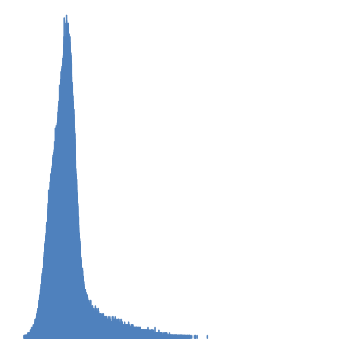
| Category | Series 1 |
|---|---|
| 0 | 0 |
| 1 | 0 |
| 2 | 0 |
| 3 | 0 |
| 4 | 0 |
| 5 | 0 |
| 6 | 0 |
| 7 | 0 |
| 8 | 0 |
| 9 | 0 |
| 10 | 0 |
| 11 | 0 |
| 12 | 0 |
| 13 | 0 |
| 14 | 0 |
| 15 | 0 |
| 16 | 0 |
| 17 | 0 |
| 18 | 0 |
| 19 | 0 |
| 20 | 0 |
| 21 | 0 |
| 22 | 0 |
| 23 | 0 |
| 24 | 0 |
| 25 | 0 |
| 26 | 0 |
| 27 | 0 |
| 28 | 0 |
| 29 | 0 |
| 30 | 0 |
| 31 | 0 |
| 32 | 0 |
| 33 | 0 |
| 34 | 0 |
| 35 | 0 |
| 36 | 0 |
| 37 | 0 |
| 38 | 0 |
| 39 | 0 |
| 40 | 0 |
| 41 | 0 |
| 42 | 0 |
| 43 | 0 |
| 44 | 0 |
| 45 | 0 |
| 46 | 0 |
| 47 | 0 |
| 48 | 0 |
| 49 | 0 |
| 50 | 0 |
| 51 | 0 |
| 52 | 0 |
| 53 | 0 |
| 54 | 0 |
| 55 | 0 |
| 56 | 0 |
| 57 | 0 |
| 58 | 0 |
| 59 | 0 |
| 60 | 0 |
| 61 | 0 |
| 62 | 0 |
| 63 | 0 |
| 64 | 0 |
| 65 | 0 |
| 66 | 0 |
| 67 | 0 |
| 68 | 0 |
| 69 | 0 |
| 70 | 0 |
| 71 | 0 |
| 72 | 0 |
| 73 | 0 |
| 74 | 0 |
| 75 | 0 |
| 76 | 0 |
| 77 | 0 |
| 78 | 0 |
| 79 | 0 |
| 80 | 0 |
| 81 | 0 |
| 82 | 0 |
| 83 | 0 |
| 84 | 0 |
| 85 | 0 |
| 86 | 0 |
| 87 | 0 |
| 88 | 0 |
| 89 | 0 |
| 90 | 0 |
| 91 | 0 |
| 92 | 0 |
| 93 | 0 |
| 94 | 0 |
| 95 | 0 |
| 96 | 0 |
| 97 | 0 |
| 98 | 0 |
| 99 | 0 |
| 100 | 0 |
| 101 | 0 |
| 102 | 0 |
| 103 | 0 |
| 104 | 0 |
| 105 | 0 |
| 106 | 0 |
| 107 | 0 |
| 108 | 0 |
| 109 | 0 |
| 110 | 0 |
| 111 | 0 |
| 112 | 0 |
| 113 | 0 |
| 114 | 0 |
| 115 | 0 |
| 116 | 0 |
| 117 | 0 |
| 118 | 0 |
| 119 | 0 |
| 120 | 0 |
| 121 | 0 |
| 122 | 0 |
| 123 | 0 |
| 124 | 0 |
| 125 | 0 |
| 126 | 0 |
| 127 | 0 |
| 128 | 0 |
| 129 | 0 |
| 130 | 0 |
| 131 | 0 |
| 132 | 0 |
| 133 | 0 |
| 134 | 0 |
| 135 | 0 |
| 136 | 0 |
| 137 | 0 |
| 138 | 0 |
| 139 | 0 |
| 140 | 0 |
| 141 | 0 |
| 142 | 0 |
| 143 | 0 |
| 144 | 0 |
| 145 | 0 |
| 146 | 0 |
| 147 | 0 |
| 148 | 0 |
| 149 | 0 |
| 150 | 0 |
| 151 | 0 |
| 152 | 0 |
| 153 | 0 |
| 154 | 0 |
| 155 | 0 |
| 156 | 0 |
| 157 | 0 |
| 158 | 0 |
| 159 | 0 |
| 160 | 0 |
| 161 | 0 |
| 162 | 0 |
| 163 | 0 |
| 164 | 0 |
| 165 | 0 |
| 166 | 0 |
| 167 | 0 |
| 168 | 0 |
| 169 | 0 |
| 170 | 0 |
| 171 | 0 |
| 172 | 0 |
| 173 | 0 |
| 174 | 0 |
| 175 | 0 |
| 176 | 0 |
| 177 | 0 |
| 178 | 0 |
| 179 | 0 |
| 180 | 0 |
| 181 | 0 |
| 182 | 0 |
| 183 | 0 |
| 184 | 0 |
| 185 | 0 |
| 186 | 0 |
| 187 | 0 |
| 188 | 0 |
| 189 | 0 |
| 190 | 0 |
| 191 | 0 |
| 192 | 0 |
| 193 | 0 |
| 194 | 0 |
| 195 | 0 |
| 196 | 0 |
| 197 | 0 |
| 198 | 0 |
| 199 | 0 |
| 200 | 0 |
| 201 | 0 |
| 202 | 0 |
| 203 | 0 |
| 204 | 0 |
| 205 | 0 |
| 206 | 0 |
| 207 | 0 |
| 208 | 0 |
| 209 | 0 |
| 210 | 0 |
| 211 | 0 |
| 212 | 0 |
| 213 | 0 |
| 214 | 0 |
| 215 | 0 |
| 216 | 0 |
| 217 | 0 |
| 218 | 0 |
| 219 | 0 |
| 220 | 0 |
| 221 | 0 |
| 222 | 0 |
| 223 | 0 |
| 224 | 0 |
| 225 | 0 |
| 226 | 0 |
| 227 | 0 |
| 228 | 0 |
| 229 | 0 |
| 230 | 0 |
| 231 | 0 |
| 232 | 0 |
| 233 | 0 |
| 234 | 0 |
| 235 | 0 |
| 236 | 0 |
| 237 | 0 |
| 238 | 0 |
| 239 | 0 |
| 240 | 0 |
| 241 | 0 |
| 242 | 0 |
| 243 | 0 |
| 244 | 0 |
| 245 | 0 |
| 246 | 0 |
| 247 | 0 |
| 248 | 0 |
| 249 | 0 |
| 250 | 0 |
| 251 | 0 |
| 252 | 0 |
| 253 | 0 |
| 254 | 0 |
| 255 | 0 |
| 256 | 0 |
| 257 | 0 |
| 258 | 0 |
| 259 | 0 |
| 260 | 0 |
| 261 | 0 |
| 262 | 0 |
| 263 | 0 |
| 264 | 0 |
| 265 | 0 |
| 266 | 0 |
| 267 | 0 |
| 268 | 0 |
| 269 | 0 |
| 270 | 0 |
| 271 | 0 |
| 272 | 0 |
| 273 | 0 |
| 274 | 0 |
| 275 | 0 |
| 276 | 0 |
| 277 | 0 |
| 278 | 0 |
| 279 | 0 |
| 280 | 0 |
| 281 | 0 |
| 282 | 0 |
| 283 | 0 |
| 284 | 0 |
| 285 | 0 |
| 286 | 0 |
| 287 | 0 |
| 288 | 0 |
| 289 | 0 |
| 290 | 0 |
| 291 | 0 |
| 292 | 0 |
| 293 | 0 |
| 294 | 0 |
| 295 | 0 |
| 296 | 0 |
| 297 | 0 |
| 298 | 0 |
| 299 | 0 |
| 300 | 0 |
| 301 | 0 |
| 302 | 0 |
| 303 | 0 |
| 304 | 0 |
| 305 | 0 |
| 306 | 0 |
| 307 | 0 |
| 308 | 0 |
| 309 | 0 |
| 310 | 0 |
| 311 | 0 |
| 312 | 0 |
| 313 | 0 |
| 314 | 0 |
| 315 | 0 |
| 316 | 0 |
| 317 | 0 |
| 318 | 0 |
| 319 | 0 |
| 320 | 0 |
| 321 | 0 |
| 322 | 0 |
| 323 | 0 |
| 324 | 0 |
| 325 | 0 |
| 326 | 0 |
| 327 | 0 |
| 328 | 0 |
| 329 | 0 |
| 330 | 0 |
| 331 | 0 |
| 332 | 0 |
| 333 | 0 |
| 334 | 0 |
| 335 | 0 |
| 336 | 0 |
| 337 | 0 |
| 338 | 0 |
| 339 | 0 |
| 340 | 0 |
| 341 | 0 |
| 342 | 0 |
| 343 | 0 |
| 344 | 0 |
| 345 | 0 |
| 346 | 0 |
| 347 | 0 |
| 348 | 0 |
| 349 | 0 |
| 350 | 0 |
| 351 | 0 |
| 352 | 0 |
| 353 | 0 |
| 354 | 0 |
| 355 | 0 |
| 356 | 0 |
| 357 | 0 |
| 358 | 0 |
| 359 | 0 |
| 360 | 0 |
| 361 | 0 |
| 362 | 0 |
| 363 | 0 |
| 364 | 0 |
| 365 | 0 |
| 366 | 0 |
| 367 | 0 |
| 368 | 0 |
| 369 | 0 |
| 370 | 0 |
| 371 | 0 |
| 372 | 0 |
| 373 | 0 |
| 374 | 0 |
| 375 | 0 |
| 376 | 0 |
| 377 | 0 |
| 378 | 0 |
| 379 | 0 |
| 380 | 0 |
| 381 | 0 |
| 382 | 0 |
| 383 | 0 |
| 384 | 0 |
| 385 | 0 |
| 386 | 0 |
| 387 | 0 |
| 388 | 0 |
| 389 | 0 |
| 390 | 0 |
| 391 | 0 |
| 392 | 0 |
| 393 | 0 |
| 394 | 0 |
| 395 | 0 |
| 396 | 0 |
| 397 | 0 |
| 398 | 0 |
| 399 | 0 |
| 400 | 0 |
| 401 | 0 |
| 402 | 0 |
| 403 | 0 |
| 404 | 0 |
| 405 | 0 |
| 406 | 0 |
| 407 | 0 |
| 408 | 0 |
| 409 | 0 |
| 410 | 0 |
| 411 | 0 |
| 412 | 0 |
| 413 | 0 |
| 414 | 0 |
| 415 | 0 |
| 416 | 0 |
| 417 | 0 |
| 418 | 0 |
| 419 | 0 |
| 420 | 0 |
| 421 | 0 |
| 422 | 0 |
| 423 | 0 |
| 424 | 0 |
| 425 | 0 |
| 426 | 0 |
| 427 | 0 |
| 428 | 0 |
| 429 | 0 |
| 430 | 0 |
| 431 | 0 |
| 432 | 0 |
| 433 | 0 |
| 434 | 0 |
| 435 | 0 |
| 436 | 0 |
| 437 | 0 |
| 438 | 0 |
| 439 | 0 |
| 440 | 0 |
| 441 | 0 |
| 442 | 0 |
| 443 | 0 |
| 444 | 0 |
| 445 | 0 |
| 446 | 0 |
| 447 | 0 |
| 448 | 0 |
| 449 | 0 |
| 450 | 0 |
| 451 | 0 |
| 452 | 0 |
| 453 | 0 |
| 454 | 0 |
| 455 | 0 |
| 456 | 0 |
| 457 | 0 |
| 458 | 0 |
| 459 | 0 |
| 460 | 0 |
| 461 | 0 |
| 462 | 0 |
| 463 | 0 |
| 464 | 0 |
| 465 | 0 |
| 466 | 0 |
| 467 | 0 |
| 468 | 0 |
| 469 | 0 |
| 470 | 0 |
| 471 | 0 |
| 472 | 0 |
| 473 | 0 |
| 474 | 0 |
| 475 | 0 |
| 476 | 0 |
| 477 | 0 |
| 478 | 0 |
| 479 | 0 |
| 480 | 0 |
| 481 | 0 |
| 482 | 0 |
| 483 | 0 |
| 484 | 0 |
| 485 | 0 |
| 486 | 0 |
| 487 | 0 |
| 488 | 0 |
| 489 | 0 |
| 490 | 0 |
| 491 | 0 |
| 492 | 0 |
| 493 | 0 |
| 494 | 0 |
| 495 | 0 |
| 496 | 0 |
| 497 | 0 |
| 498 | 0 |
| 499 | 0 |
| 500 | 0 |
| 501 | 0 |
| 502 | 0 |
| 503 | 0 |
| 504 | 0 |
| 505 | 0 |
| 506 | 0 |
| 507 | 0 |
| 508 | 0 |
| 509 | 0 |
| 510 | 0 |
| 511 | 0 |
| 512 | 0 |
| 513 | 0 |
| 514 | 0 |
| 515 | 0 |
| 516 | 0 |
| 517 | 0 |
| 518 | 0 |
| 519 | 0 |
| 520 | 0 |
| 521 | 0 |
| 522 | 0 |
| 523 | 0 |
| 524 | 0 |
| 525 | 0 |
| 526 | 0 |
| 527 | 0 |
| 528 | 0 |
| 529 | 0 |
| 530 | 0 |
| 531 | 0 |
| 532 | 0 |
| 533 | 0 |
| 534 | 0 |
| 535 | 0 |
| 536 | 0 |
| 537 | 0 |
| 538 | 0 |
| 539 | 0 |
| 540 | 0 |
| 541 | 0 |
| 542 | 0 |
| 543 | 0 |
| 544 | 0 |
| 545 | 0 |
| 546 | 0 |
| 547 | 0 |
| 548 | 0 |
| 549 | 0 |
| 550 | 0 |
| 551 | 0 |
| 552 | 0 |
| 553 | 0 |
| 554 | 0 |
| 555 | 0 |
| 556 | 0 |
| 557 | 0 |
| 558 | 0 |
| 559 | 0 |
| 560 | 0 |
| 561 | 0 |
| 562 | 0 |
| 563 | 0 |
| 564 | 0 |
| 565 | 0 |
| 566 | 0 |
| 567 | 0 |
| 568 | 0 |
| 569 | 0 |
| 570 | 0 |
| 571 | 0 |
| 572 | 0 |
| 573 | 0 |
| 574 | 0 |
| 575 | 0 |
| 576 | 0 |
| 577 | 0 |
| 578 | 0 |
| 579 | 0 |
| 580 | 0 |
| 581 | 0 |
| 582 | 0 |
| 583 | 0 |
| 584 | 0 |
| 585 | 0 |
| 586 | 0 |
| 587 | 0 |
| 588 | 0 |
| 589 | 0 |
| 590 | 0 |
| 591 | 0 |
| 592 | 0 |
| 593 | 0 |
| 594 | 0 |
| 595 | 0 |
| 596 | 0 |
| 597 | 0 |
| 598 | 0 |
| 599 | 0 |
| 600 | 0 |
| 601 | 0 |
| 602 | 0 |
| 603 | 0 |
| 604 | 0 |
| 605 | 0 |
| 606 | 0 |
| 607 | 0 |
| 608 | 0 |
| 609 | 0 |
| 610 | 0 |
| 611 | 0 |
| 612 | 0 |
| 613 | 0 |
| 614 | 0 |
| 615 | 0 |
| 616 | 0 |
| 617 | 0 |
| 618 | 0 |
| 619 | 0 |
| 620 | 0 |
| 621 | 0 |
| 622 | 0 |
| 623 | 0 |
| 624 | 0 |
| 625 | 0 |
| 626 | 0 |
| 627 | 0 |
| 628 | 0 |
| 629 | 0 |
| 630 | 0 |
| 631 | 0 |
| 632 | 0 |
| 633 | 0 |
| 634 | 0 |
| 635 | 0 |
| 636 | 0 |
| 637 | 0 |
| 638 | 0 |
| 639 | 0 |
| 640 | 0 |
| 641 | 0 |
| 642 | 0 |
| 643 | 0 |
| 644 | 0 |
| 645 | 0 |
| 646 | 0 |
| 647 | 0 |
| 648 | 0 |
| 649 | 0 |
| 650 | 0 |
| 651 | 0 |
| 652 | 0 |
| 653 | 0 |
| 654 | 0 |
| 655 | 0 |
| 656 | 0 |
| 657 | 0 |
| 658 | 0 |
| 659 | 0 |
| 660 | 0 |
| 661 | 0 |
| 662 | 0 |
| 663 | 0 |
| 664 | 0 |
| 665 | 0 |
| 666 | 0 |
| 667 | 0 |
| 668 | 0 |
| 669 | 0 |
| 670 | 0 |
| 671 | 0 |
| 672 | 0 |
| 673 | 0 |
| 674 | 0 |
| 675 | 0 |
| 676 | 0 |
| 677 | 0 |
| 678 | 0 |
| 679 | 0 |
| 680 | 0 |
| 681 | 0 |
| 682 | 0 |
| 683 | 0 |
| 684 | 0 |
| 685 | 0 |
| 686 | 0 |
| 687 | 0 |
| 688 | 0 |
| 689 | 0 |
| 690 | 0 |
| 691 | 0 |
| 692 | 0 |
| 693 | 0 |
| 694 | 0 |
| 695 | 0 |
| 696 | 0 |
| 697 | 0 |
| 698 | 0 |
| 699 | 0 |
| 700 | 0 |
| 701 | 0 |
| 702 | 0 |
| 703 | 0 |
| 704 | 0 |
| 705 | 0 |
| 706 | 0 |
| 707 | 0 |
| 708 | 0 |
| 709 | 0 |
| 710 | 0 |
| 711 | 0 |
| 712 | 0 |
| 713 | 0 |
| 714 | 0 |
| 715 | 0 |
| 716 | 0 |
| 717 | 0 |
| 718 | 0 |
| 719 | 0 |
| 720 | 0 |
| 721 | 0 |
| 722 | 0 |
| 723 | 0 |
| 724 | 0 |
| 725 | 0 |
| 726 | 0 |
| 727 | 0 |
| 728 | 0 |
| 729 | 0 |
| 730 | 0 |
| 731 | 0 |
| 732 | 0 |
| 733 | 0 |
| 734 | 0 |
| 735 | 0 |
| 736 | 0 |
| 737 | 0 |
| 738 | 0 |
| 739 | 0 |
| 740 | 0 |
| 741 | 0 |
| 742 | 0 |
| 743 | 0 |
| 744 | 0 |
| 745 | 0 |
| 746 | 0 |
| 747 | 0 |
| 748 | 0 |
| 749 | 0 |
| 750 | 0 |
| 751 | 0 |
| 752 | 0 |
| 753 | 0 |
| 754 | 0 |
| 755 | 0 |
| 756 | 0 |
| 757 | 0 |
| 758 | 0 |
| 759 | 0 |
| 760 | 0 |
| 761 | 0 |
| 762 | 0 |
| 763 | 0 |
| 764 | 0 |
| 765 | 0 |
| 766 | 0 |
| 767 | 0 |
| 768 | 0 |
| 769 | 0 |
| 770 | 0 |
| 771 | 0 |
| 772 | 0 |
| 773 | 0 |
| 774 | 0 |
| 775 | 0 |
| 776 | 0 |
| 777 | 0 |
| 778 | 0 |
| 779 | 0 |
| 780 | 0 |
| 781 | 0 |
| 782 | 0 |
| 783 | 0 |
| 784 | 0 |
| 785 | 0 |
| 786 | 0 |
| 787 | 0 |
| 788 | 0 |
| 789 | 0 |
| 790 | 0 |
| 791 | 0 |
| 792 | 0 |
| 793 | 0 |
| 794 | 0 |
| 795 | 0 |
| 796 | 0 |
| 797 | 0 |
| 798 | 0 |
| 799 | 0 |
| 800 | 0 |
| 801 | 0 |
| 802 | 0 |
| 803 | 0 |
| 804 | 0 |
| 805 | 0 |
| 806 | 0 |
| 807 | 0 |
| 808 | 0 |
| 809 | 0 |
| 810 | 0 |
| 811 | 0 |
| 812 | 0 |
| 813 | 0 |
| 814 | 0 |
| 815 | 0 |
| 816 | 0 |
| 817 | 0 |
| 818 | 0 |
| 819 | 0 |
| 820 | 0 |
| 821 | 0 |
| 822 | 0 |
| 823 | 0 |
| 824 | 0 |
| 825 | 0 |
| 826 | 0 |
| 827 | 0 |
| 828 | 0 |
| 829 | 0 |
| 830 | 0 |
| 831 | 0 |
| 832 | 0 |
| 833 | 0 |
| 834 | 0 |
| 835 | 0 |
| 836 | 0 |
| 837 | 0 |
| 838 | 0 |
| 839 | 0 |
| 840 | 0 |
| 841 | 0 |
| 842 | 0 |
| 843 | 0 |
| 844 | 0 |
| 845 | 0 |
| 846 | 0 |
| 847 | 0 |
| 848 | 0 |
| 849 | 0 |
| 850 | 0 |
| 851 | 0 |
| 852 | 0 |
| 853 | 0 |
| 854 | 0 |
| 855 | 0 |
| 856 | 0 |
| 857 | 0 |
| 858 | 0 |
| 859 | 0 |
| 860 | 0 |
| 861 | 0 |
| 862 | 0 |
| 863 | 0 |
| 864 | 0 |
| 865 | 0 |
| 866 | 0 |
| 867 | 0 |
| 868 | 0 |
| 869 | 0 |
| 870 | 0 |
| 871 | 0 |
| 872 | 0 |
| 873 | 0 |
| 874 | 0 |
| 875 | 0 |
| 876 | 0 |
| 877 | 0 |
| 878 | 0 |
| 879 | 0 |
| 880 | 0 |
| 881 | 0 |
| 882 | 0 |
| 883 | 0 |
| 884 | 0 |
| 885 | 0 |
| 886 | 0 |
| 887 | 0 |
| 888 | 0 |
| 889 | 0 |
| 890 | 0 |
| 891 | 0 |
| 892 | 0 |
| 893 | 0 |
| 894 | 0 |
| 895 | 0 |
| 896 | 0 |
| 897 | 0 |
| 898 | 0 |
| 899 | 0 |
| 900 | 0 |
| 901 | 0 |
| 902 | 0 |
| 903 | 0 |
| 904 | 0 |
| 905 | 0 |
| 906 | 0 |
| 907 | 0 |
| 908 | 0 |
| 909 | 0 |
| 910 | 0 |
| 911 | 0 |
| 912 | 0 |
| 913 | 0 |
| 914 | 0 |
| 915 | 0 |
| 916 | 0 |
| 917 | 0 |
| 918 | 0 |
| 919 | 0 |
| 920 | 0 |
| 921 | 0 |
| 922 | 0 |
| 923 | 0 |
| 924 | 0 |
| 925 | 0 |
| 926 | 0 |
| 927 | 0 |
| 928 | 0 |
| 929 | 0 |
| 930 | 0 |
| 931 | 0 |
| 932 | 0 |
| 933 | 0 |
| 934 | 0 |
| 935 | 0 |
| 936 | 0 |
| 937 | 0 |
| 938 | 0 |
| 939 | 0 |
| 940 | 0 |
| 941 | 0 |
| 942 | 0 |
| 943 | 0 |
| 944 | 0 |
| 945 | 0 |
| 946 | 0 |
| 947 | 0 |
| 948 | 0 |
| 949 | 0 |
| 950 | 0 |
| 951 | 0 |
| 952 | 0 |
| 953 | 0 |
| 954 | 0 |
| 955 | 0 |
| 956 | 0 |
| 957 | 0 |
| 958 | 0 |
| 959 | 0 |
| 960 | 0 |
| 961 | 0 |
| 962 | 0 |
| 963 | 0 |
| 964 | 0 |
| 965 | 0 |
| 966 | 0 |
| 967 | 0 |
| 968 | 0 |
| 969 | 0 |
| 970 | 0 |
| 971 | 0 |
| 972 | 0 |
| 973 | 0 |
| 974 | 0 |
| 975 | 0 |
| 976 | 0 |
| 977 | 0 |
| 978 | 0 |
| 979 | 0 |
| 980 | 0 |
| 981 | 0 |
| 982 | 0 |
| 983 | 0 |
| 984 | 0 |
| 985 | 0 |
| 986 | 0 |
| 987 | 0 |
| 988 | 0 |
| 989 | 0 |
| 990 | 0 |
| 991 | 0 |
| 992 | 0 |
| 993 | 0 |
| 994 | 0 |
| 995 | 0 |
| 996 | 0 |
| 997 | 0 |
| 998 | 0 |
| 999 | 0 |
| 1000 | 0 |
| 1001 | 0 |
| 1002 | 0 |
| 1003 | 0 |
| 1004 | 0 |
| 1005 | 0 |
| 1006 | 0 |
| 1007 | 0 |
| 1008 | 0 |
| 1009 | 0 |
| 1010 | 0 |
| 1011 | 0 |
| 1012 | 0 |
| 1013 | 0 |
| 1014 | 0 |
| 1015 | 0 |
| 1016 | 0 |
| 1017 | 0 |
| 1018 | 0 |
| 1019 | 0 |
| 1020 | 0 |
| 1021 | 0 |
| 1022 | 0 |
| 1023 | 0 |
| 1024 | 0 |
| 1025 | 0 |
| 1026 | 0 |
| 1027 | 0 |
| 1028 | 0 |
| 1029 | 0 |
| 1030 | 0 |
| 1031 | 0 |
| 1032 | 0 |
| 1033 | 0 |
| 1034 | 0 |
| 1035 | 0 |
| 1036 | 0 |
| 1037 | 0 |
| 1038 | 0 |
| 1039 | 0 |
| 1040 | 0 |
| 1041 | 0 |
| 1042 | 0 |
| 1043 | 0 |
| 1044 | 0 |
| 1045 | 0 |
| 1046 | 0 |
| 1047 | 0 |
| 1048 | 0 |
| 1049 | 0 |
| 1050 | 0 |
| 1051 | 0 |
| 1052 | 0 |
| 1053 | 0 |
| 1054 | 0 |
| 1055 | 0 |
| 1056 | 0 |
| 1057 | 0 |
| 1058 | 0 |
| 1059 | 0 |
| 1060 | 0 |
| 1061 | 0 |
| 1062 | 0 |
| 1063 | 0.001 |
| 1064 | 0 |
| 1065 | 0 |
| 1066 | 0 |
| 1067 | 0 |
| 1068 | 0 |
| 1069 | 0 |
| 1070 | 0 |
| 1071 | 0 |
| 1072 | 0 |
| 1073 | 0 |
| 1074 | 0 |
| 1075 | 0 |
| 1076 | 0 |
| 1077 | 0 |
| 1078 | 0 |
| 1079 | 0 |
| 1080 | 0.001 |
| 1081 | 0 |
| 1082 | 0.001 |
| 1083 | 0 |
| 1084 | 0 |
| 1085 | 0 |
| 1086 | 0.001 |
| 1087 | 0 |
| 1088 | 0 |
| 1089 | 0 |
| 1090 | 0 |
| 1091 | 0 |
| 1092 | 0 |
| 1093 | 0 |
| 1094 | 0 |
| 1095 | 0 |
| 1096 | 0.001 |
| 1097 | 0 |
| 1098 | 0 |
| 1099 | 0 |
| 1100 | 0 |
| 1101 | 0 |
| 1102 | 0.001 |
| 1103 | 0 |
| 1104 | 0.001 |
| 1105 | 0 |
| 1106 | 0 |
| 1107 | 0.001 |
| 1108 | 0.001 |
| 1109 | 0 |
| 1110 | 0.001 |
| 1111 | 0.001 |
| 1112 | 0 |
| 1113 | 0.001 |
| 1114 | 0 |
| 1115 | 0.001 |
| 1116 | 0 |
| 1117 | 0 |
| 1118 | 0.001 |
| 1119 | 0.001 |
| 1120 | 0 |
| 1121 | 0.001 |
| 1122 | 0 |
| 1123 | 0.001 |
| 1124 | 0 |
| 1125 | 0.001 |
| 1126 | 0.001 |
| 1127 | 0.001 |
| 1128 | 0 |
| 1129 | 0.001 |
| 1130 | 0.001 |
| 1131 | 0.001 |
| 1132 | 0.001 |
| 1133 | 0.001 |
| 1134 | 0.001 |
| 1135 | 0.001 |
| 1136 | 0.001 |
| 1137 | 0.001 |
| 1138 | 0.001 |
| 1139 | 0.001 |
| 1140 | 0.001 |
| 1141 | 0.001 |
| 1142 | 0.001 |
| 1143 | 0.001 |
| 1144 | 0.001 |
| 1145 | 0.001 |
| 1146 | 0.001 |
| 1147 | 0.001 |
| 1148 | 0.001 |
| 1149 | 0.001 |
| 1150 | 0.001 |
| 1151 | 0.001 |
| 1152 | 0.001 |
| 1153 | 0.001 |
| 1154 | 0.001 |
| 1155 | 0.001 |
| 1156 | 0.001 |
| 1157 | 0.001 |
| 1158 | 0.001 |
| 1159 | 0.001 |
| 1160 | 0.001 |
| 1161 | 0.001 |
| 1162 | 0.001 |
| 1163 | 0.001 |
| 1164 | 0.001 |
| 1165 | 0.001 |
| 1166 | 0.001 |
| 1167 | 0.001 |
| 1168 | 0.001 |
| 1169 | 0.001 |
| 1170 | 0.001 |
| 1171 | 0.001 |
| 1172 | 0.001 |
| 1173 | 0.001 |
| 1174 | 0.001 |
| 1175 | 0.001 |
| 1176 | 0.001 |
| 1177 | 0.001 |
| 1178 | 0.001 |
| 1179 | 0.001 |
| 1180 | 0.001 |
| 1181 | 0.001 |
| 1182 | 0.001 |
| 1183 | 0.001 |
| 1184 | 0.001 |
| 1185 | 0.001 |
| 1186 | 0.001 |
| 1187 | 0.001 |
| 1188 | 0.001 |
| 1189 | 0.001 |
| 1190 | 0.001 |
| 1191 | 0.001 |
| 1192 | 0.001 |
| 1193 | 0.001 |
| 1194 | 0.001 |
| 1195 | 0.001 |
| 1196 | 0.001 |
| 1197 | 0.001 |
| 1198 | 0.001 |
| 1199 | 0.001 |
| 1200 | 0.001 |
| 1201 | 0.001 |
| 1202 | 0.001 |
| 1203 | 0.001 |
| 1204 | 0.001 |
| 1205 | 0.001 |
| 1206 | 0.001 |
| 1207 | 0.001 |
| 1208 | 0.001 |
| 1209 | 0.001 |
| 1210 | 0.001 |
| 1211 | 0.001 |
| 1212 | 0.001 |
| 1213 | 0.001 |
| 1214 | 0.001 |
| 1215 | 0.001 |
| 1216 | 0.001 |
| 1217 | 0.001 |
| 1218 | 0.001 |
| 1219 | 0.001 |
| 1220 | 0.001 |
| 1221 | 0.001 |
| 1222 | 0.001 |
| 1223 | 0.001 |
| 1224 | 0.001 |
| 1225 | 0.001 |
| 1226 | 0.001 |
| 1227 | 0.001 |
| 1228 | 0.001 |
| 1229 | 0.001 |
| 1230 | 0.001 |
| 1231 | 0.001 |
| 1232 | 0.001 |
| 1233 | 0.001 |
| 1234 | 0.001 |
| 1235 | 0.001 |
| 1236 | 0.001 |
| 1237 | 0.001 |
| 1238 | 0.001 |
| 1239 | 0.001 |
| 1240 | 0.001 |
| 1241 | 0.001 |
| 1242 | 0.001 |
| 1243 | 0.001 |
| 1244 | 0.001 |
| 1245 | 0.001 |
| 1246 | 0.001 |
| 1247 | 0.001 |
| 1248 | 0.001 |
| 1249 | 0.001 |
| 1250 | 0.001 |
| 1251 | 0.001 |
| 1252 | 0.001 |
| 1253 | 0.001 |
| 1254 | 0.001 |
| 1255 | 0.001 |
| 1256 | 0.001 |
| 1257 | 0.001 |
| 1258 | 0.001 |
| 1259 | 0.001 |
| 1260 | 0.001 |
| 1261 | 0.001 |
| 1262 | 0.001 |
| 1263 | 0.001 |
| 1264 | 0.001 |
| 1265 | 0.001 |
| 1266 | 0.001 |
| 1267 | 0.001 |
| 1268 | 0.001 |
| 1269 | 0.001 |
| 1270 | 0.001 |
| 1271 | 0.001 |
| 1272 | 0.001 |
| 1273 | 0.001 |
| 1274 | 0.001 |
| 1275 | 0.001 |
| 1276 | 0.001 |
| 1277 | 0.001 |
| 1278 | 0.001 |
| 1279 | 0.001 |
| 1280 | 0.001 |
| 1281 | 0.001 |
| 1282 | 0.001 |
| 1283 | 0.001 |
| 1284 | 0.001 |
| 1285 | 0.001 |
| 1286 | 0.001 |
| 1287 | 0.001 |
| 1288 | 0.001 |
| 1289 | 0.001 |
| 1290 | 0.001 |
| 1291 | 0.001 |
| 1292 | 0.001 |
| 1293 | 0.001 |
| 1294 | 0.001 |
| 1295 | 0.001 |
| 1296 | 0.001 |
| 1297 | 0.001 |
| 1298 | 0.001 |
| 1299 | 0.001 |
| 1300 | 0.001 |
| 1301 | 0.001 |
| 1302 | 0.001 |
| 1303 | 0.001 |
| 1304 | 0.001 |
| 1305 | 0.001 |
| 1306 | 0.001 |
| 1307 | 0.001 |
| 1308 | 0.001 |
| 1309 | 0.001 |
| 1310 | 0.001 |
| 1311 | 0.001 |
| 1312 | 0.001 |
| 1313 | 0.001 |
| 1314 | 0.001 |
| 1315 | 0.001 |
| 1316 | 0.001 |
| 1317 | 0.001 |
| 1318 | 0.001 |
| 1319 | 0.001 |
| 1320 | 0.001 |
| 1321 | 0.001 |
| 1322 | 0.001 |
| 1323 | 0.001 |
| 1324 | 0.001 |
| 1325 | 0.001 |
| 1326 | 0.001 |
| 1327 | 0.001 |
| 1328 | 0.001 |
| 1329 | 0.001 |
| 1330 | 0.001 |
| 1331 | 0.001 |
| 1332 | 0.001 |
| 1333 | 0.001 |
| 1334 | 0.001 |
| 1335 | 0.001 |
| 1336 | 0.001 |
| 1337 | 0.001 |
| 1338 | 0.001 |
| 1339 | 0.001 |
| 1340 | 0.001 |
| 1341 | 0.001 |
| 1342 | 0.001 |
| 1343 | 0.001 |
| 1344 | 0.001 |
| 1345 | 0.001 |
| 1346 | 0.001 |
| 1347 | 0.001 |
| 1348 | 0.001 |
| 1349 | 0.001 |
| 1350 | 0.001 |
| 1351 | 0.001 |
| 1352 | 0.001 |
| 1353 | 0.001 |
| 1354 | 0.001 |
| 1355 | 0.001 |
| 1356 | 0.001 |
| 1357 | 0.001 |
| 1358 | 0.001 |
| 1359 | 0.001 |
| 1360 | 0.001 |
| 1361 | 0.001 |
| 1362 | 0.001 |
| 1363 | 0.001 |
| 1364 | 0.001 |
| 1365 | 0.001 |
| 1366 | 0.001 |
| 1367 | 0.001 |
| 1368 | 0.001 |
| 1369 | 0.001 |
| 1370 | 0.001 |
| 1371 | 0.001 |
| 1372 | 0.001 |
| 1373 | 0.001 |
| 1374 | 0.001 |
| 1375 | 0.001 |
| 1376 | 0.001 |
| 1377 | 0.001 |
| 1378 | 0.001 |
| 1379 | 0.001 |
| 1380 | 0.001 |
| 1381 | 0.001 |
| 1382 | 0.001 |
| 1383 | 0.001 |
| 1384 | 0.001 |
| 1385 | 0.001 |
| 1386 | 0.001 |
| 1387 | 0.001 |
| 1388 | 0.001 |
| 1389 | 0.001 |
| 1390 | 0.001 |
| 1391 | 0.001 |
| 1392 | 0.001 |
| 1393 | 0.001 |
| 1394 | 0.001 |
| 1395 | 0.001 |
| 1396 | 0.001 |
| 1397 | 0.001 |
| 1398 | 0.001 |
| 1399 | 0.001 |
| 1400 | 0.001 |
| 1401 | 0.001 |
| 1402 | 0.001 |
| 1403 | 0.001 |
| 1404 | 0.001 |
| 1405 | 0.001 |
| 1406 | 0.001 |
| 1407 | 0.001 |
| 1408 | 0.001 |
| 1409 | 0.001 |
| 1410 | 0.001 |
| 1411 | 0.001 |
| 1412 | 0.001 |
| 1413 | 0.001 |
| 1414 | 0.001 |
| 1415 | 0.001 |
| 1416 | 0.001 |
| 1417 | 0.001 |
| 1418 | 0.001 |
| 1419 | 0.001 |
| 1420 | 0.001 |
| 1421 | 0.001 |
| 1422 | 0.001 |
| 1423 | 0.001 |
| 1424 | 0.001 |
| 1425 | 0.001 |
| 1426 | 0.001 |
| 1427 | 0.001 |
| 1428 | 0.001 |
| 1429 | 0.001 |
| 1430 | 0.001 |
| 1431 | 0.001 |
| 1432 | 0.001 |
| 1433 | 0.001 |
| 1434 | 0.001 |
| 1435 | 0.001 |
| 1436 | 0.001 |
| 1437 | 0.001 |
| 1438 | 0.001 |
| 1439 | 0.001 |
| 1440 | 0.001 |
| 1441 | 0.001 |
| 1442 | 0.001 |
| 1443 | 0.001 |
| 1444 | 0.001 |
| 1445 | 0.001 |
| 1446 | 0.001 |
| 1447 | 0.001 |
| 1448 | 0.001 |
| 1449 | 0.001 |
| 1450 | 0.001 |
| 1451 | 0.001 |
| 1452 | 0.001 |
| 1453 | 0.001 |
| 1454 | 0.001 |
| 1455 | 0.001 |
| 1456 | 0.001 |
| 1457 | 0.001 |
| 1458 | 0.001 |
| 1459 | 0.001 |
| 1460 | 0.001 |
| 1461 | 0.001 |
| 1462 | 0.001 |
| 1463 | 0.001 |
| 1464 | 0.001 |
| 1465 | 0.001 |
| 1466 | 0.001 |
| 1467 | 0.001 |
| 1468 | 0.001 |
| 1469 | 0.001 |
| 1470 | 0.001 |
| 1471 | 0.001 |
| 1472 | 0.001 |
| 1473 | 0.001 |
| 1474 | 0.001 |
| 1475 | 0.001 |
| 1476 | 0.001 |
| 1477 | 0.001 |
| 1478 | 0.001 |
| 1479 | 0.001 |
| 1480 | 0.001 |
| 1481 | 0.001 |
| 1482 | 0.001 |
| 1483 | 0.001 |
| 1484 | 0.001 |
| 1485 | 0.001 |
| 1486 | 0.001 |
| 1487 | 0.001 |
| 1488 | 0.001 |
| 1489 | 0.001 |
| 1490 | 0.001 |
| 1491 | 0.001 |
| 1492 | 0.001 |
| 1493 | 0.001 |
| 1494 | 0.001 |
| 1495 | 0.001 |
| 1496 | 0.001 |
| 1497 | 0.001 |
| 1498 | 0.001 |
| 1499 | 0.001 |
| 1500 | 0.001 |
| 1501 | 0.001 |
| 1502 | 0.001 |
| 1503 | 0.001 |
| 1504 | 0.001 |
| 1505 | 0.001 |
| 1506 | 0.001 |
| 1507 | 0.001 |
| 1508 | 0.001 |
| 1509 | 0.001 |
| 1510 | 0.001 |
| 1511 | 0.001 |
| 1512 | 0.001 |
| 1513 | 0.001 |
| 1514 | 0.001 |
| 1515 | 0.001 |
| 1516 | 0.001 |
| 1517 | 0.001 |
| 1518 | 0.001 |
| 1519 | 0.001 |
| 1520 | 0.001 |
| 1521 | 0.001 |
| 1522 | 0.001 |
| 1523 | 0.001 |
| 1524 | 0.001 |
| 1525 | 0.001 |
| 1526 | 0.001 |
| 1527 | 0.001 |
| 1528 | 0.001 |
| 1529 | 0.001 |
| 1530 | 0.001 |
| 1531 | 0.001 |
| 1532 | 0.001 |
| 1533 | 0.001 |
| 1534 | 0.001 |
| 1535 | 0.001 |
| 1536 | 0.001 |
| 1537 | 0.001 |
| 1538 | 0.001 |
| 1539 | 0.001 |
| 1540 | 0.001 |
| 1541 | 0.001 |
| 1542 | 0.001 |
| 1543 | 0.001 |
| 1544 | 0.001 |
| 1545 | 0.001 |
| 1546 | 0.001 |
| 1547 | 0.001 |
| 1548 | 0.001 |
| 1549 | 0.001 |
| 1550 | 0.001 |
| 1551 | 0.001 |
| 1552 | 0.001 |
| 1553 | 0.001 |
| 1554 | 0.001 |
| 1555 | 0.001 |
| 1556 | 0.001 |
| 1557 | 0.001 |
| 1558 | 0.001 |
| 1559 | 0.001 |
| 1560 | 0.001 |
| 1561 | 0.001 |
| 1562 | 0.001 |
| 1563 | 0.001 |
| 1564 | 0.001 |
| 1565 | 0.001 |
| 1566 | 0.001 |
| 1567 | 0.001 |
| 1568 | 0.001 |
| 1569 | 0.001 |
| 1570 | 0.001 |
| 1571 | 0.001 |
| 1572 | 0.001 |
| 1573 | 0.001 |
| 1574 | 0.001 |
| 1575 | 0.001 |
| 1576 | 0.001 |
| 1577 | 0.001 |
| 1578 | 0.001 |
| 1579 | 0.001 |
| 1580 | 0.001 |
| 1581 | 0.001 |
| 1582 | 0.001 |
| 1583 | 0.001 |
| 1584 | 0.001 |
| 1585 | 0.001 |
| 1586 | 0.001 |
| 1587 | 0.001 |
| 1588 | 0.001 |
| 1589 | 0.001 |
| 1590 | 0.001 |
| 1591 | 0.001 |
| 1592 | 0.001 |
| 1593 | 0.001 |
| 1594 | 0.001 |
| 1595 | 0.001 |
| 1596 | 0.001 |
| 1597 | 0.001 |
| 1598 | 0.001 |
| 1599 | 0.001 |
| 1600 | 0.001 |
| 1601 | 0.001 |
| 1602 | 0.001 |
| 1603 | 0.001 |
| 1604 | 0.001 |
| 1605 | 0.001 |
| 1606 | 0.001 |
| 1607 | 0.001 |
| 1608 | 0.001 |
| 1609 | 0.001 |
| 1610 | 0.001 |
| 1611 | 0.001 |
| 1612 | 0.001 |
| 1613 | 0.001 |
| 1614 | 0.001 |
| 1615 | 0.001 |
| 1616 | 0.001 |
| 1617 | 0.001 |
| 1618 | 0.001 |
| 1619 | 0.001 |
| 1620 | 0.001 |
| 1621 | 0.001 |
| 1622 | 0.001 |
| 1623 | 0.001 |
| 1624 | 0.001 |
| 1625 | 0.001 |
| 1626 | 0.001 |
| 1627 | 0.001 |
| 1628 | 0.001 |
| 1629 | 0.001 |
| 1630 | 0.001 |
| 1631 | 0.001 |
| 1632 | 0.001 |
| 1633 | 0.001 |
| 1634 | 0.001 |
| 1635 | 0.001 |
| 1636 | 0.001 |
| 1637 | 0.001 |
| 1638 | 0.001 |
| 1639 | 0.001 |
| 1640 | 0.001 |
| 1641 | 0.001 |
| 1642 | 0.001 |
| 1643 | 0.001 |
| 1644 | 0.001 |
| 1645 | 0.001 |
| 1646 | 0.001 |
| 1647 | 0.001 |
| 1648 | 0.001 |
| 1649 | 0.001 |
| 1650 | 0.001 |
| 1651 | 0.001 |
| 1652 | 0.001 |
| 1653 | 0.001 |
| 1654 | 0.001 |
| 1655 | 0.001 |
| 1656 | 0.001 |
| 1657 | 0.001 |
| 1658 | 0.001 |
| 1659 | 0.001 |
| 1660 | 0.001 |
| 1661 | 0.001 |
| 1662 | 0.001 |
| 1663 | 0.001 |
| 1664 | 0.001 |
| 1665 | 0.001 |
| 1666 | 0.001 |
| 1667 | 0.001 |
| 1668 | 0.001 |
| 1669 | 0.001 |
| 1670 | 0.001 |
| 1671 | 0.001 |
| 1672 | 0.001 |
| 1673 | 0.001 |
| 1674 | 0.001 |
| 1675 | 0.001 |
| 1676 | 0.001 |
| 1677 | 0.001 |
| 1678 | 0.001 |
| 1679 | 0.001 |
| 1680 | 0.001 |
| 1681 | 0.001 |
| 1682 | 0.001 |
| 1683 | 0.001 |
| 1684 | 0.001 |
| 1685 | 0.001 |
| 1686 | 0.001 |
| 1687 | 0.001 |
| 1688 | 0.001 |
| 1689 | 0.001 |
| 1690 | 0.001 |
| 1691 | 0.001 |
| 1692 | 0.001 |
| 1693 | 0.001 |
| 1694 | 0.001 |
| 1695 | 0.001 |
| 1696 | 0.001 |
| 1697 | 0.001 |
| 1698 | 0.001 |
| 1699 | 0.001 |
| 1700 | 0.001 |
| 1701 | 0.001 |
| 1702 | 0.001 |
| 1703 | 0.001 |
| 1704 | 0.001 |
| 1705 | 0.001 |
| 1706 | 0.001 |
| 1707 | 0.001 |
| 1708 | 0.001 |
| 1709 | 0.001 |
| 1710 | 0.001 |
| 1711 | 0.001 |
| 1712 | 0.001 |
| 1713 | 0.001 |
| 1714 | 0.001 |
| 1715 | 0.001 |
| 1716 | 0.001 |
| 1717 | 0.001 |
| 1718 | 0.001 |
| 1719 | 0.001 |
| 1720 | 0.001 |
| 1721 | 0.001 |
| 1722 | 0.001 |
| 1723 | 0.001 |
| 1724 | 0.001 |
| 1725 | 0.001 |
| 1726 | 0.001 |
| 1727 | 0.001 |
| 1728 | 0.001 |
| 1729 | 0.001 |
| 1730 | 0.001 |
| 1731 | 0.001 |
| 1732 | 0.001 |
| 1733 | 0.001 |
| 1734 | 0.001 |
| 1735 | 0.001 |
| 1736 | 0.001 |
| 1737 | 0.001 |
| 1738 | 0.001 |
| 1739 | 0.001 |
| 1740 | 0.001 |
| 1741 | 0.001 |
| 1742 | 0.001 |
| 1743 | 0.001 |
| 1744 | 0.001 |
| 1745 | 0.001 |
| 1746 | 0.001 |
| 1747 | 0.001 |
| 1748 | 0.001 |
| 1749 | 0.001 |
| 1750 | 0.001 |
| 1751 | 0.001 |
| 1752 | 0.001 |
| 1753 | 0.001 |
| 1754 | 0.001 |
| 1755 | 0.001 |
| 1756 | 0.001 |
| 1757 | 0.001 |
| 1758 | 0.001 |
| 1759 | 0.001 |
| 1760 | 0.001 |
| 1761 | 0.001 |
| 1762 | 0.001 |
| 1763 | 0.001 |
| 1764 | 0.001 |
| 1765 | 0.001 |
| 1766 | 0.001 |
| 1767 | 0.001 |
| 1768 | 0.001 |
| 1769 | 0.001 |
| 1770 | 0.001 |
| 1771 | 0.001 |
| 1772 | 0.001 |
| 1773 | 0.001 |
| 1774 | 0.001 |
| 1775 | 0.001 |
| 1776 | 0.001 |
| 1777 | 0.001 |
| 1778 | 0.001 |
| 1779 | 0.001 |
| 1780 | 0.001 |
| 1781 | 0.001 |
| 1782 | 0.001 |
| 1783 | 0.001 |
| 1784 | 0.001 |
| 1785 | 0.001 |
| 1786 | 0.001 |
| 1787 | 0.001 |
| 1788 | 0.001 |
| 1789 | 0.001 |
| 1790 | 0.001 |
| 1791 | 0.001 |
| 1792 | 0.001 |
| 1793 | 0.001 |
| 1794 | 0.001 |
| 1795 | 0.001 |
| 1796 | 0.001 |
| 1797 | 0.001 |
| 1798 | 0.001 |
| 1799 | 0.001 |
| 1800 | 0.001 |
| 1801 | 0.001 |
| 1802 | 0.001 |
| 1803 | 0.001 |
| 1804 | 0.001 |
| 1805 | 0.001 |
| 1806 | 0.001 |
| 1807 | 0.001 |
| 1808 | 0.001 |
| 1809 | 0.001 |
| 1810 | 0.001 |
| 1811 | 0.001 |
| 1812 | 0.001 |
| 1813 | 0.001 |
| 1814 | 0.001 |
| 1815 | 0.001 |
| 1816 | 0.001 |
| 1817 | 0.001 |
| 1818 | 0.001 |
| 1819 | 0.001 |
| 1820 | 0.001 |
| 1821 | 0.001 |
| 1822 | 0.001 |
| 1823 | 0.001 |
| 1824 | 0.001 |
| 1825 | 0.001 |
| 1826 | 0.001 |
| 1827 | 0.001 |
| 1828 | 0.001 |
| 1829 | 0.001 |
| 1830 | 0.001 |
| 1831 | 0.001 |
| 1832 | 0.001 |
| 1833 | 0.001 |
| 1834 | 0.001 |
| 1835 | 0.001 |
| 1836 | 0.001 |
| 1837 | 0.001 |
| 1838 | 0.001 |
| 1839 | 0.001 |
| 1840 | 0.001 |
| 1841 | 0.001 |
| 1842 | 0.001 |
| 1843 | 0.001 |
| 1844 | 0.001 |
| 1845 | 0.001 |
| 1846 | 0.001 |
| 1847 | 0.001 |
| 1848 | 0.001 |
| 1849 | 0.001 |
| 1850 | 0.001 |
| 1851 | 0.001 |
| 1852 | 0.001 |
| 1853 | 0.001 |
| 1854 | 0.001 |
| 1855 | 0.001 |
| 1856 | 0.001 |
| 1857 | 0.001 |
| 1858 | 0.001 |
| 1859 | 0.001 |
| 1860 | 0.001 |
| 1861 | 0.001 |
| 1862 | 0.001 |
| 1863 | 0.001 |
| 1864 | 0.001 |
| 1865 | 0.001 |
| 1866 | 0.001 |
| 1867 | 0.001 |
| 1868 | 0.001 |
| 1869 | 0.001 |
| 1870 | 0.001 |
| 1871 | 0.001 |
| 1872 | 0.001 |
| 1873 | 0.001 |
| 1874 | 0.001 |
| 1875 | 0.001 |
| 1876 | 0.001 |
| 1877 | 0.001 |
| 1878 | 0.001 |
| 1879 | 0.001 |
| 1880 | 0.001 |
| 1881 | 0.001 |
| 1882 | 0.001 |
| 1883 | 0.001 |
| 1884 | 0.001 |
| 1885 | 0.001 |
| 1886 | 0.001 |
| 1887 | 0.001 |
| 1888 | 0.001 |
| 1889 | 0.001 |
| 1890 | 0.001 |
| 1891 | 0.001 |
| 1892 | 0.001 |
| 1893 | 0.001 |
| 1894 | 0.001 |
| 1895 | 0.001 |
| 1896 | 0.001 |
| 1897 | 0.001 |
| 1898 | 0.001 |
| 1899 | 0.001 |
| 1900 | 0.001 |
| 1901 | 0.001 |
| 1902 | 0.001 |
| 1903 | 0.001 |
| 1904 | 0.001 |
| 1905 | 0.001 |
| 1906 | 0.001 |
| 1907 | 0.001 |
| 1908 | 0.001 |
| 1909 | 0.001 |
| 1910 | 0.001 |
| 1911 | 0.001 |
| 1912 | 0.001 |
| 1913 | 0.001 |
| 1914 | 0.001 |
| 1915 | 0.001 |
| 1916 | 0.001 |
| 1917 | 0 |
| 1918 | 0.001 |
| 1919 | 0.001 |
| 1920 | 0.001 |
| 1921 | 0.001 |
| 1922 | 0.001 |
| 1923 | 0.001 |
| 1924 | 0.001 |
| 1925 | 0.001 |
| 1926 | 0 |
| 1927 | 0.001 |
| 1928 | 0.001 |
| 1929 | 0.001 |
| 1930 | 0 |
| 1931 | 0.001 |
| 1932 | 0.001 |
| 1933 | 0.001 |
| 1934 | 0.001 |
| 1935 | 0.001 |
| 1936 | 0.001 |
| 1937 | 0.001 |
| 1938 | 0.001 |
| 1939 | 0.001 |
| 1940 | 0 |
| 1941 | 0.001 |
| 1942 | 0 |
| 1943 | 0 |
| 1944 | 0.001 |
| 1945 | 0 |
| 1946 | 0 |
| 1947 | 0 |
| 1948 | 0 |
| 1949 | 0.001 |
| 1950 | 0.001 |
| 1951 | 0 |
| 1952 | 0 |
| 1953 | 0.001 |
| 1954 | 0 |
| 1955 | 0.001 |
| 1956 | 0 |
| 1957 | 0 |
| 1958 | 0 |
| 1959 | 0 |
| 1960 | 0 |
| 1961 | 0 |
| 1962 | 0 |
| 1963 | 0 |
| 1964 | 0 |
| 1965 | 0 |
| 1966 | 0 |
| 1967 | 0 |
| 1968 | 0 |
| 1969 | 0 |
| 1970 | 0 |
| 1971 | 0 |
| 1972 | 0 |
| 1973 | 0 |
| 1974 | 0 |
| 1975 | 0 |
| 1976 | 0 |
| 1977 | 0 |
| 1978 | 0 |
| 1979 | 0 |
| 1980 | 0 |
| 1981 | 0 |
| 1982 | 0 |
| 1983 | 0 |
| 1984 | 0 |
| 1985 | 0 |
| 1986 | 0 |
| 1987 | 0 |
| 1988 | 0 |
| 1989 | 0 |
| 1990 | 0 |
| 1991 | 0 |
| 1992 | 0 |
| 1993 | 0 |
| 1994 | 0 |
| 1995 | 0 |
| 1996 | 0 |
| 1997 | 0 |
| 1998 | 0 |
| 1999 | 0 |
| 2000 | 0 |
| 2001 | 0 |
| 2002 | 0 |
| 2003 | 0 |
| 2004 | 0 |
| 2005 | 0 |
| 2006 | 0 |
| 2007 | 0 |
| 2008 | 0 |
| 2009 | 0 |
| 2010 | 0 |
| 2011 | 0 |
| 2012 | 0 |
| 2013 | 0 |
| 2014 | 0 |
| 2015 | 0 |
| 2016 | 0 |
| 2017 | 0 |
| 2018 | 0 |
| 2019 | 0 |
| 2020 | 0 |
| 2021 | 0 |
| 2022 | 0 |
| 2023 | 0 |
| 2024 | 0 |
| 2025 | 0 |
| 2026 | 0 |
| 2027 | 0 |
| 2028 | 0 |
| 2029 | 0 |
| 2030 | 0 |
| 2031 | 0 |
| 2032 | 0 |
| 2033 | 0 |
| 2034 | 0 |
| 2035 | 0 |
| 2036 | 0 |
| 2037 | 0 |
| 2038 | 0 |
| 2039 | 0 |
| 2040 | 0 |
| 2041 | 0 |
| 2042 | 0 |
| 2043 | 0 |
| 2044 | 0 |
| 2045 | 0 |
| 2046 | 0 |
| 2047 | 0 |
| 2048 | 0 |
| 2049 | 0 |
| 2050 | 0 |
| 2051 | 0 |
| 2052 | 0 |
| 2053 | 0 |
| 2054 | 0 |
| 2055 | 0 |
| 2056 | 0 |
| 2057 | 0 |
| 2058 | 0 |
| 2059 | 0 |
| 2060 | 0 |
| 2061 | 0 |
| 2062 | 0 |
| 2063 | 0 |
| 2064 | 0 |
| 2065 | 0 |
| 2066 | 0 |
| 2067 | 0 |
| 2068 | 0 |
| 2069 | 0 |
| 2070 | 0 |
| 2071 | 0 |
| 2072 | 0 |
| 2073 | 0 |
| 2074 | 0 |
| 2075 | 0 |
| 2076 | 0 |
| 2077 | 0 |
| 2078 | 0 |
| 2079 | 0 |
| 2080 | 0 |
| 2081 | 0 |
| 2082 | 0 |
| 2083 | 0 |
| 2084 | 0 |
| 2085 | 0 |
| 2086 | 0 |
| 2087 | 0 |
| 2088 | 0 |
| 2089 | 0 |
| 2090 | 0 |
| 2091 | 0 |
| 2092 | 0 |
| 2093 | 0 |
| 2094 | 0 |
| 2095 | 0 |
| 2096 | 0 |
| 2097 | 0 |
| 2098 | 0 |
| 2099 | 0 |
| 2100 | 0 |
| 2101 | 0 |
| 2102 | 0 |
| 2103 | 0 |
| 2104 | 0 |
| 2105 | 0 |
| 2106 | 0 |
| 2107 | 0 |
| 2108 | 0 |
| 2109 | 0 |
| 2110 | 0 |
| 2111 | 0 |
| 2112 | 0 |
| 2113 | 0 |
| 2114 | 0 |
| 2115 | 0 |
| 2116 | 0 |
| 2117 | 0 |
| 2118 | 0 |
| 2119 | 0 |
| 2120 | 0 |
| 2121 | 0 |
| 2122 | 0 |
| 2123 | 0 |
| 2124 | 0 |
| 2125 | 0 |
| 2126 | 0 |
| 2127 | 0 |
| 2128 | 0 |
| 2129 | 0 |
| 2130 | 0 |
| 2131 | 0 |
| 2132 | 0 |
| 2133 | 0 |
| 2134 | 0 |
| 2135 | 0 |
| 2136 | 0 |
| 2137 | 0 |
| 2138 | 0 |
| 2139 | 0 |
| 2140 | 0 |
| 2141 | 0 |
| 2142 | 0 |
| 2143 | 0 |
| 2144 | 0 |
| 2145 | 0 |
| 2146 | 0 |
| 2147 | 0 |
| 2148 | 0 |
| 2149 | 0 |
| 2150 | 0 |
| 2151 | 0 |
| 2152 | 0 |
| 2153 | 0 |
| 2154 | 0 |
| 2155 | 0 |
| 2156 | 0 |
| 2157 | 0 |
| 2158 | 0 |
| 2159 | 0 |
| 2160 | 0 |
| 2161 | 0 |
| 2162 | 0 |
| 2163 | 0 |
| 2164 | 0 |
| 2165 | 0 |
| 2166 | 0 |
| 2167 | 0 |
| 2168 | 0 |
| 2169 | 0 |
| 2170 | 0 |
| 2171 | 0 |
| 2172 | 0 |
| 2173 | 0 |
| 2174 | 0 |
| 2175 | 0 |
| 2176 | 0 |
| 2177 | 0 |
| 2178 | 0 |
| 2179 | 0 |
| 2180 | 0 |
| 2181 | 0 |
| 2182 | 0 |
| 2183 | 0 |
| 2184 | 0 |
| 2185 | 0 |
| 2186 | 0 |
| 2187 | 0 |
| 2188 | 0 |
| 2189 | 0 |
| 2190 | 0 |
| 2191 | 0 |
| 2192 | 0 |
| 2193 | 0 |
| 2194 | 0 |
| 2195 | 0 |
| 2196 | 0 |
| 2197 | 0 |
| 2198 | 0 |
| 2199 | 0 |
| 2200 | 0 |
| 2201 | 0 |
| 2202 | 0 |
| 2203 | 0 |
| 2204 | 0 |
| 2205 | 0 |
| 2206 | 0 |
| 2207 | 0 |
| 2208 | 0 |
| 2209 | 0 |
| 2210 | 0 |
| 2211 | 0 |
| 2212 | 0 |
| 2213 | 0 |
| 2214 | 0 |
| 2215 | 0 |
| 2216 | 0 |
| 2217 | 0 |
| 2218 | 0 |
| 2219 | 0 |
| 2220 | 0 |
| 2221 | 0 |
| 2222 | 0 |
| 2223 | 0 |
| 2224 | 0 |
| 2225 | 0 |
| 2226 | 0 |
| 2227 | 0 |
| 2228 | 0 |
| 2229 | 0 |
| 2230 | 0 |
| 2231 | 0 |
| 2232 | 0 |
| 2233 | 0 |
| 2234 | 0 |
| 2235 | 0 |
| 2236 | 0 |
| 2237 | 0 |
| 2238 | 0 |
| 2239 | 0 |
| 2240 | 0 |
| 2241 | 0 |
| 2242 | 0 |
| 2243 | 0 |
| 2244 | 0 |
| 2245 | 0 |
| 2246 | 0 |
| 2247 | 0 |
| 2248 | 0 |
| 2249 | 0 |
| 2250 | 0 |
| 2251 | 0 |
| 2252 | 0 |
| 2253 | 0 |
| 2254 | 0 |
| 2255 | 0 |
| 2256 | 0 |
| 2257 | 0 |
| 2258 | 0 |
| 2259 | 0 |
| 2260 | 0 |
| 2261 | 0 |
| 2262 | 0 |
| 2263 | 0 |
| 2264 | 0 |
| 2265 | 0 |
| 2266 | 0 |
| 2267 | 0 |
| 2268 | 0 |
| 2269 | 0 |
| 2270 | 0 |
| 2271 | 0 |
| 2272 | 0 |
| 2273 | 0 |
| 2274 | 0 |
| 2275 | 0 |
| 2276 | 0 |
| 2277 | 0 |
| 2278 | 0 |
| 2279 | 0 |
| 2280 | 0 |
| 2281 | 0 |
| 2282 | 0 |
| 2283 | 0 |
| 2284 | 0 |
| 2285 | 0 |
| 2286 | 0 |
| 2287 | 0 |
| 2288 | 0 |
| 2289 | 0 |
| 2290 | 0 |
| 2291 | 0 |
| 2292 | 0 |
| 2293 | 0 |
| 2294 | 0 |
| 2295 | 0 |
| 2296 | 0 |
| 2297 | 0 |
| 2298 | 0 |
| 2299 | 0 |
| 2300 | 0 |
| 2301 | 0 |
| 2302 | 0 |
| 2303 | 0 |
| 2304 | 0 |
| 2305 | 0 |
| 2306 | 0 |
| 2307 | 0 |
| 2308 | 0 |
| 2309 | 0 |
| 2310 | 0 |
| 2311 | 0 |
| 2312 | 0 |
| 2313 | 0 |
| 2314 | 0 |
| 2315 | 0 |
| 2316 | 0 |
| 2317 | 0 |
| 2318 | 0 |
| 2319 | 0 |
| 2320 | 0 |
| 2321 | 0 |
| 2322 | 0 |
| 2323 | 0 |
| 2324 | 0 |
| 2325 | 0 |
| 2326 | 0 |
| 2327 | 0 |
| 2328 | 0 |
| 2329 | 0 |
| 2330 | 0 |
| 2331 | 0 |
| 2332 | 0 |
| 2333 | 0 |
| 2334 | 0 |
| 2335 | 0 |
| 2336 | 0 |
| 2337 | 0 |
| 2338 | 0 |
| 2339 | 0 |
| 2340 | 0 |
| 2341 | 0 |
| 2342 | 0 |
| 2343 | 0 |
| 2344 | 0 |
| 2345 | 0 |
| 2346 | 0 |
| 2347 | 0 |
| 2348 | 0 |
| 2349 | 0 |
| 2350 | 0 |
| 2351 | 0 |
| 2352 | 0 |
| 2353 | 0 |
| 2354 | 0 |
| 2355 | 0 |
| 2356 | 0 |
| 2357 | 0 |
| 2358 | 0 |
| 2359 | 0 |
| 2360 | 0 |
| 2361 | 0 |
| 2362 | 0 |
| 2363 | 0 |
| 2364 | 0 |
| 2365 | 0 |
| 2366 | 0 |
| 2367 | 0 |
| 2368 | 0 |
| 2369 | 0 |
| 2370 | 0 |
| 2371 | 0 |
| 2372 | 0 |
| 2373 | 0 |
| 2374 | 0 |
| 2375 | 0 |
| 2376 | 0 |
| 2377 | 0 |
| 2378 | 0 |
| 2379 | 0 |
| 2380 | 0 |
| 2381 | 0 |
| 2382 | 0 |
| 2383 | 0 |
| 2384 | 0 |
| 2385 | 0 |
| 2386 | 0 |
| 2387 | 0 |
| 2388 | 0 |
| 2389 | 0 |
| 2390 | 0 |
| 2391 | 0 |
| 2392 | 0 |
| 2393 | 0 |
| 2394 | 0 |
| 2395 | 0 |
| 2396 | 0 |
| 2397 | 0 |
| 2398 | 0 |
| 2399 | 0 |
| 2400 | 0 |
| 2401 | 0 |
| 2402 | 0 |
| 2403 | 0 |
| 2404 | 0 |
| 2405 | 0 |
| 2406 | 0 |
| 2407 | 0 |
| 2408 | 0 |
| 2409 | 0 |
| 2410 | 0 |
| 2411 | 0 |
| 2412 | 0 |
| 2413 | 0 |
| 2414 | 0 |
| 2415 | 0 |
| 2416 | 0 |
| 2417 | 0 |
| 2418 | 0 |
| 2419 | 0 |
| 2420 | 0 |
| 2421 | 0 |
| 2422 | 0 |
| 2423 | 0 |
| 2424 | 0 |
| 2425 | 0 |
| 2426 | 0 |
| 2427 | 0 |
| 2428 | 0 |
| 2429 | 0 |
| 2430 | 0 |
| 2431 | 0 |
| 2432 | 0 |
| 2433 | 0 |
| 2434 | 0 |
| 2435 | 0 |
| 2436 | 0 |
| 2437 | 0 |
| 2438 | 0 |
| 2439 | 0 |
| 2440 | 0 |
| 2441 | 0 |
| 2442 | 0 |
| 2443 | 0 |
| 2444 | 0 |
| 2445 | 0 |
| 2446 | 0 |
| 2447 | 0 |
| 2448 | 0 |
| 2449 | 0 |
| 2450 | 0 |
| 2451 | 0 |
| 2452 | 0 |
| 2453 | 0 |
| 2454 | 0 |
| 2455 | 0 |
| 2456 | 0 |
| 2457 | 0 |
| 2458 | 0 |
| 2459 | 0 |
| 2460 | 0 |
| 2461 | 0 |
| 2462 | 0 |
| 2463 | 0 |
| 2464 | 0 |
| 2465 | 0 |
| 2466 | 0 |
| 2467 | 0 |
| 2468 | 0 |
| 2469 | 0 |
| 2470 | 0 |
| 2471 | 0 |
| 2472 | 0 |
| 2473 | 0 |
| 2474 | 0 |
| 2475 | 0 |
| 2476 | 0 |
| 2477 | 0 |
| 2478 | 0 |
| 2479 | 0 |
| 2480 | 0 |
| 2481 | 0 |
| 2482 | 0 |
| 2483 | 0 |
| 2484 | 0 |
| 2485 | 0 |
| 2486 | 0 |
| 2487 | 0 |
| 2488 | 0 |
| 2489 | 0 |
| 2490 | 0 |
| 2491 | 0 |
| 2492 | 0 |
| 2493 | 0 |
| 2494 | 0 |
| 2495 | 0 |
| 2496 | 0 |
| 2497 | 0 |
| 2498 | 0 |
| 2499 | 0 |
| 2500 | 0 |
| 2501 | 0 |
| 2502 | 0 |
| 2503 | 0 |
| 2504 | 0 |
| 2505 | 0 |
| 2506 | 0 |
| 2507 | 0 |
| 2508 | 0 |
| 2509 | 0 |
| 2510 | 0 |
| 2511 | 0 |
| 2512 | 0 |
| 2513 | 0 |
| 2514 | 0 |
| 2515 | 0 |
| 2516 | 0 |
| 2517 | 0 |
| 2518 | 0 |
| 2519 | 0 |
| 2520 | 0 |
| 2521 | 0 |
| 2522 | 0 |
| 2523 | 0 |
| 2524 | 0 |
| 2525 | 0 |
| 2526 | 0 |
| 2527 | 0 |
| 2528 | 0 |
| 2529 | 0 |
| 2530 | 0 |
| 2531 | 0 |
| 2532 | 0 |
| 2533 | 0 |
| 2534 | 0 |
| 2535 | 0 |
| 2536 | 0 |
| 2537 | 0 |
| 2538 | 0 |
| 2539 | 0 |
| 2540 | 0 |
| 2541 | 0 |
| 2542 | 0 |
| 2543 | 0 |
| 2544 | 0 |
| 2545 | 0 |
| 2546 | 0 |
| 2547 | 0 |
| 2548 | 0 |
| 2549 | 0 |
| 2550 | 0 |
| 2551 | 0 |
| 2552 | 0 |
| 2553 | 0 |
| 2554 | 0 |
| 2555 | 0 |
| 2556 | 0 |
| 2557 | 0 |
| 2558 | 0 |
| 2559 | 0 |
| 2560 | 0 |
| 2561 | 0 |
| 2562 | 0 |
| 2563 | 0 |
| 2564 | 0 |
| 2565 | 0 |
| 2566 | 0 |
| 2567 | 0 |
| 2568 | 0 |
| 2569 | 0 |
| 2570 | 0 |
| 2571 | 0 |
| 2572 | 0 |
| 2573 | 0 |
| 2574 | 0 |
| 2575 | 0 |
| 2576 | 0 |
| 2577 | 0 |
| 2578 | 0 |
| 2579 | 0 |
| 2580 | 0 |
| 2581 | 0 |
| 2582 | 0 |
| 2583 | 0 |
| 2584 | 0 |
| 2585 | 0 |
| 2586 | 0 |
| 2587 | 0 |
| 2588 | 0 |
| 2589 | 0 |
| 2590 | 0 |
| 2591 | 0 |
| 2592 | 0 |
| 2593 | 0 |
| 2594 | 0 |
| 2595 | 0 |
| 2596 | 0 |
| 2597 | 0 |
| 2598 | 0 |
| 2599 | 0 |
| 2600 | 0 |
| 2601 | 0 |
| 2602 | 0 |
| 2603 | 0 |
| 2604 | 0 |
| 2605 | 0 |
| 2606 | 0 |
| 2607 | 0 |
| 2608 | 0 |
| 2609 | 0 |
| 2610 | 0 |
| 2611 | 0 |
| 2612 | 0 |
| 2613 | 0 |
| 2614 | 0 |
| 2615 | 0 |
| 2616 | 0 |
| 2617 | 0 |
| 2618 | 0 |
| 2619 | 0 |
| 2620 | 0 |
| 2621 | 0 |
| 2622 | 0 |
| 2623 | 0 |
| 2624 | 0 |
| 2625 | 0 |
| 2626 | 0 |
| 2627 | 0 |
| 2628 | 0 |
| 2629 | 0 |
| 2630 | 0 |
| 2631 | 0 |
| 2632 | 0 |
| 2633 | 0 |
| 2634 | 0 |
| 2635 | 0 |
| 2636 | 0 |
| 2637 | 0 |
| 2638 | 0 |
| 2639 | 0 |
| 2640 | 0 |
| 2641 | 0 |
| 2642 | 0 |
| 2643 | 0 |
| 2644 | 0 |
| 2645 | 0 |
| 2646 | 0 |
| 2647 | 0 |
| 2648 | 0 |
| 2649 | 0 |
| 2650 | 0 |
| 2651 | 0 |
| 2652 | 0 |
| 2653 | 0 |
| 2654 | 0 |
| 2655 | 0 |
| 2656 | 0 |
| 2657 | 0 |
| 2658 | 0 |
| 2659 | 0 |
| 2660 | 0 |
| 2661 | 0 |
| 2662 | 0 |
| 2663 | 0 |
| 2664 | 0 |
| 2665 | 0 |
| 2666 | 0 |
| 2667 | 0 |
| 2668 | 0 |
| 2669 | 0 |
| 2670 | 0 |
| 2671 | 0 |
| 2672 | 0 |
| 2673 | 0 |
| 2674 | 0 |
| 2675 | 0 |
| 2676 | 0 |
| 2677 | 0 |
| 2678 | 0 |
| 2679 | 0 |
| 2680 | 0 |
| 2681 | 0 |
| 2682 | 0 |
| 2683 | 0 |
| 2684 | 0 |
| 2685 | 0 |
| 2686 | 0 |
| 2687 | 0 |
| 2688 | 0 |
| 2689 | 0 |
| 2690 | 0 |
| 2691 | 0 |
| 2692 | 0 |
| 2693 | 0 |
| 2694 | 0 |
| 2695 | 0 |
| 2696 | 0 |
| 2697 | 0 |
| 2698 | 0 |
| 2699 | 0 |
| 2700 | 0 |
| 2701 | 0 |
| 2702 | 0 |
| 2703 | 0 |
| 2704 | 0 |
| 2705 | 0 |
| 2706 | 0 |
| 2707 | 0 |
| 2708 | 0 |
| 2709 | 0 |
| 2710 | 0 |
| 2711 | 0 |
| 2712 | 0 |
| 2713 | 0 |
| 2714 | 0 |
| 2715 | 0 |
| 2716 | 0 |
| 2717 | 0 |
| 2718 | 0 |
| 2719 | 0 |
| 2720 | 0 |
| 2721 | 0 |
| 2722 | 0 |
| 2723 | 0 |
| 2724 | 0 |
| 2725 | 0 |
| 2726 | 0 |
| 2727 | 0 |
| 2728 | 0 |
| 2729 | 0 |
| 2730 | 0 |
| 2731 | 0 |
| 2732 | 0 |
| 2733 | 0 |
| 2734 | 0 |
| 2735 | 0 |
| 2736 | 0 |
| 2737 | 0 |
| 2738 | 0 |
| 2739 | 0 |
| 2740 | 0 |
| 2741 | 0 |
| 2742 | 0 |
| 2743 | 0 |
| 2744 | 0 |
| 2745 | 0 |
| 2746 | 0 |
| 2747 | 0 |
| 2748 | 0 |
| 2749 | 0 |
| 2750 | 0 |
| 2751 | 0 |
| 2752 | 0 |
| 2753 | 0 |
| 2754 | 0 |
| 2755 | 0 |
| 2756 | 0 |
| 2757 | 0 |
| 2758 | 0 |
| 2759 | 0 |
| 2760 | 0 |
| 2761 | 0 |
| 2762 | 0 |
| 2763 | 0 |
| 2764 | 0 |
| 2765 | 0 |
| 2766 | 0 |
| 2767 | 0 |
| 2768 | 0 |
| 2769 | 0 |
| 2770 | 0 |
| 2771 | 0 |
| 2772 | 0 |
| 2773 | 0 |
| 2774 | 0 |
| 2775 | 0 |
| 2776 | 0 |
| 2777 | 0 |
| 2778 | 0 |
| 2779 | 0 |
| 2780 | 0 |
| 2781 | 0 |
| 2782 | 0 |
| 2783 | 0 |
| 2784 | 0 |
| 2785 | 0 |
| 2786 | 0 |
| 2787 | 0 |
| 2788 | 0 |
| 2789 | 0 |
| 2790 | 0 |
| 2791 | 0 |
| 2792 | 0 |
| 2793 | 0 |
| 2794 | 0 |
| 2795 | 0 |
| 2796 | 0 |
| 2797 | 0 |
| 2798 | 0 |
| 2799 | 0 |
| 2800 | 0 |
| 2801 | 0 |
| 2802 | 0 |
| 2803 | 0 |
| 2804 | 0 |
| 2805 | 0 |
| 2806 | 0 |
| 2807 | 0 |
| 2808 | 0 |
| 2809 | 0 |
| 2810 | 0 |
| 2811 | 0 |
| 2812 | 0 |
| 2813 | 0 |
| 2814 | 0 |
| 2815 | 0 |
| 2816 | 0 |
| 2817 | 0 |
| 2818 | 0 |
| 2819 | 0 |
| 2820 | 0 |
| 2821 | 0 |
| 2822 | 0 |
| 2823 | 0 |
| 2824 | 0 |
| 2825 | 0 |
| 2826 | 0 |
| 2827 | 0 |
| 2828 | 0 |
| 2829 | 0 |
| 2830 | 0 |
| 2831 | 0 |
| 2832 | 0 |
| 2833 | 0 |
| 2834 | 0 |
| 2835 | 0 |
| 2836 | 0 |
| 2837 | 0 |
| 2838 | 0 |
| 2839 | 0 |
| 2840 | 0 |
| 2841 | 0 |
| 2842 | 0 |
| 2843 | 0 |
| 2844 | 0 |
| 2845 | 0 |
| 2846 | 0 |
| 2847 | 0 |
| 2848 | 0 |
| 2849 | 0 |
| 2850 | 0 |
| 2851 | 0 |
| 2852 | 0 |
| 2853 | 0 |
| 2854 | 0 |
| 2855 | 0 |
| 2856 | 0 |
| 2857 | 0 |
| 2858 | 0 |
| 2859 | 0 |
| 2860 | 0 |
| 2861 | 0 |
| 2862 | 0 |
| 2863 | 0 |
| 2864 | 0 |
| 2865 | 0 |
| 2866 | 0 |
| 2867 | 0 |
| 2868 | 0 |
| 2869 | 0 |
| 2870 | 0 |
| 2871 | 0 |
| 2872 | 0 |
| 2873 | 0 |
| 2874 | 0 |
| 2875 | 0 |
| 2876 | 0 |
| 2877 | 0 |
| 2878 | 0 |
| 2879 | 0 |
| 2880 | 0 |
| 2881 | 0 |
| 2882 | 0 |
| 2883 | 0 |
| 2884 | 0 |
| 2885 | 0 |
| 2886 | 0 |
| 2887 | 0 |
| 2888 | 0 |
| 2889 | 0 |
| 2890 | 0 |
| 2891 | 0 |
| 2892 | 0 |
| 2893 | 0 |
| 2894 | 0 |
| 2895 | 0 |
| 2896 | 0 |
| 2897 | 0 |
| 2898 | 0 |
| 2899 | 0 |
| 2900 | 0 |
| 2901 | 0 |
| 2902 | 0 |
| 2903 | 0 |
| 2904 | 0 |
| 2905 | 0 |
| 2906 | 0 |
| 2907 | 0 |
| 2908 | 0 |
| 2909 | 0 |
| 2910 | 0 |
| 2911 | 0 |
| 2912 | 0 |
| 2913 | 0 |
| 2914 | 0 |
| 2915 | 0 |
| 2916 | 0 |
| 2917 | 0 |
| 2918 | 0 |
| 2919 | 0 |
| 2920 | 0 |
| 2921 | 0 |
| 2922 | 0 |
| 2923 | 0 |
| 2924 | 0 |
| 2925 | 0 |
| 2926 | 0 |
| 2927 | 0 |
| 2928 | 0 |
| 2929 | 0 |
| 2930 | 0 |
| 2931 | 0 |
| 2932 | 0 |
| 2933 | 0 |
| 2934 | 0 |
| 2935 | 0 |
| 2936 | 0 |
| 2937 | 0 |
| 2938 | 0 |
| 2939 | 0 |
| 2940 | 0 |
| 2941 | 0 |
| 2942 | 0 |
| 2943 | 0 |
| 2944 | 0 |
| 2945 | 0 |
| 2946 | 0 |
| 2947 | 0 |
| 2948 | 0 |
| 2949 | 0 |
| 2950 | 0 |
| 2951 | 0 |
| 2952 | 0 |
| 2953 | 0 |
| 2954 | 0 |
| 2955 | 0 |
| 2956 | 0 |
| 2957 | 0 |
| 2958 | 0 |
| 2959 | 0 |
| 2960 | 0 |
| 2961 | 0 |
| 2962 | 0 |
| 2963 | 0 |
| 2964 | 0 |
| 2965 | 0 |
| 2966 | 0 |
| 2967 | 0 |
| 2968 | 0 |
| 2969 | 0 |
| 2970 | 0 |
| 2971 | 0 |
| 2972 | 0 |
| 2973 | 0 |
| 2974 | 0 |
| 2975 | 0 |
| 2976 | 0 |
| 2977 | 0 |
| 2978 | 0 |
| 2979 | 0 |
| 2980 | 0 |
| 2981 | 0 |
| 2982 | 0 |
| 2983 | 0 |
| 2984 | 0 |
| 2985 | 0 |
| 2986 | 0 |
| 2987 | 0 |
| 2988 | 0 |
| 2989 | 0 |
| 2990 | 0 |
| 2991 | 0 |
| 2992 | 0 |
| 2993 | 0 |
| 2994 | 0 |
| 2995 | 0 |
| 2996 | 0 |
| 2997 | 0 |
| 2998 | 0 |
| 2999 | 0 |
| 3000 | 0 |
| 3001 | 0 |
| 3002 | 0 |
| 3003 | 0 |
| 3004 | 0 |
| 3005 | 0 |
| 3006 | 0 |
| 3007 | 0 |
| 3008 | 0 |
| 3009 | 0 |
| 3010 | 0 |
| 3011 | 0 |
| 3012 | 0 |
| 3013 | 0 |
| 3014 | 0 |
| 3015 | 0 |
| 3016 | 0 |
| 3017 | 0 |
| 3018 | 0 |
| 3019 | 0 |
| 3020 | 0 |
| 3021 | 0 |
| 3022 | 0 |
| 3023 | 0 |
| 3024 | 0 |
| 3025 | 0 |
| 3026 | 0 |
| 3027 | 0 |
| 3028 | 0 |
| 3029 | 0 |
| 3030 | 0 |
| 3031 | 0 |
| 3032 | 0 |
| 3033 | 0 |
| 3034 | 0 |
| 3035 | 0 |
| 3036 | 0 |
| 3037 | 0 |
| 3038 | 0 |
| 3039 | 0 |
| 3040 | 0 |
| 3041 | 0 |
| 3042 | 0 |
| 3043 | 0 |
| 3044 | 0 |
| 3045 | 0 |
| 3046 | 0 |
| 3047 | 0 |
| 3048 | 0 |
| 3049 | 0 |
| 3050 | 0 |
| 3051 | 0 |
| 3052 | 0 |
| 3053 | 0 |
| 3054 | 0 |
| 3055 | 0 |
| 3056 | 0 |
| 3057 | 0 |
| 3058 | 0 |
| 3059 | 0 |
| 3060 | 0 |
| 3061 | 0 |
| 3062 | 0 |
| 3063 | 0 |
| 3064 | 0 |
| 3065 | 0 |
| 3066 | 0 |
| 3067 | 0 |
| 3068 | 0 |
| 3069 | 0 |
| 3070 | 0 |
| 3071 | 0 |
| 3072 | 0 |
| 3073 | 0 |
| 3074 | 0 |
| 3075 | 0 |
| 3076 | 0 |
| 3077 | 0 |
| 3078 | 0 |
| 3079 | 0 |
| 3080 | 0 |
| 3081 | 0 |
| 3082 | 0 |
| 3083 | 0 |
| 3084 | 0 |
| 3085 | 0 |
| 3086 | 0 |
| 3087 | 0 |
| 3088 | 0 |
| 3089 | 0 |
| 3090 | 0 |
| 3091 | 0 |
| 3092 | 0 |
| 3093 | 0 |
| 3094 | 0 |
| 3095 | 0 |
| 3096 | 0 |
| 3097 | 0 |
| 3098 | 0 |
| 3099 | 0 |
| 3100 | 0 |
| 3101 | 0 |
| 3102 | 0 |
| 3103 | 0 |
| 3104 | 0 |
| 3105 | 0 |
| 3106 | 0 |
| 3107 | 0 |
| 3108 | 0 |
| 3109 | 0 |
| 3110 | 0 |
| 3111 | 0 |
| 3112 | 0 |
| 3113 | 0 |
| 3114 | 0 |
| 3115 | 0 |
| 3116 | 0 |
| 3117 | 0 |
| 3118 | 0 |
| 3119 | 0 |
| 3120 | 0 |
| 3121 | 0 |
| 3122 | 0 |
| 3123 | 0 |
| 3124 | 0 |
| 3125 | 0 |
| 3126 | 0 |
| 3127 | 0 |
| 3128 | 0 |
| 3129 | 0 |
| 3130 | 0 |
| 3131 | 0 |
| 3132 | 0 |
| 3133 | 0 |
| 3134 | 0 |
| 3135 | 0 |
| 3136 | 0 |
| 3137 | 0 |
| 3138 | 0 |
| 3139 | 0 |
| 3140 | 0 |
| 3141 | 0 |
| 3142 | 0 |
| 3143 | 0 |
| 3144 | 0 |
| 3145 | 0 |
| 3146 | 0 |
| 3147 | 0 |
| 3148 | 0 |
| 3149 | 0 |
| 3150 | 0 |
| 3151 | 0 |
| 3152 | 0 |
| 3153 | 0 |
| 3154 | 0 |
| 3155 | 0 |
| 3156 | 0 |
| 3157 | 0 |
| 3158 | 0 |
| 3159 | 0 |
| 3160 | 0 |
| 3161 | 0 |
| 3162 | 0 |
| 3163 | 0 |
| 3164 | 0 |
| 3165 | 0 |
| 3166 | 0 |
| 3167 | 0 |
| 3168 | 0 |
| 3169 | 0 |
| 3170 | 0 |
| 3171 | 0 |
| 3172 | 0 |
| 3173 | 0 |
| 3174 | 0 |
| 3175 | 0 |
| 3176 | 0 |
| 3177 | 0 |
| 3178 | 0 |
| 3179 | 0 |
| 3180 | 0 |
| 3181 | 0 |
| 3182 | 0 |
| 3183 | 0 |
| 3184 | 0 |
| 3185 | 0 |
| 3186 | 0 |
| 3187 | 0 |
| 3188 | 0 |
| 3189 | 0 |
| 3190 | 0 |
| 3191 | 0 |
| 3192 | 0 |
| 3193 | 0 |
| 3194 | 0 |
| 3195 | 0 |
| 3196 | 0 |
| 3197 | 0 |
| 3198 | 0 |
| 3199 | 0 |
| 3200 | 0 |
| 3201 | 0 |
| 3202 | 0 |
| 3203 | 0 |
| 3204 | 0 |
| 3205 | 0 |
| 3206 | 0 |
| 3207 | 0 |
| 3208 | 0 |
| 3209 | 0 |
| 3210 | 0 |
| 3211 | 0 |
| 3212 | 0 |
| 3213 | 0 |
| 3214 | 0 |
| 3215 | 0 |
| 3216 | 0 |
| 3217 | 0 |
| 3218 | 0 |
| 3219 | 0 |
| 3220 | 0 |
| 3221 | 0 |
| 3222 | 0 |
| 3223 | 0 |
| 3224 | 0 |
| 3225 | 0 |
| 3226 | 0 |
| 3227 | 0 |
| 3228 | 0 |
| 3229 | 0 |
| 3230 | 0 |
| 3231 | 0 |
| 3232 | 0 |
| 3233 | 0 |
| 3234 | 0 |
| 3235 | 0 |
| 3236 | 0 |
| 3237 | 0 |
| 3238 | 0 |
| 3239 | 0 |
| 3240 | 0 |
| 3241 | 0 |
| 3242 | 0 |
| 3243 | 0 |
| 3244 | 0 |
| 3245 | 0 |
| 3246 | 0 |
| 3247 | 0 |
| 3248 | 0 |
| 3249 | 0 |
| 3250 | 0 |
| 3251 | 0 |
| 3252 | 0 |
| 3253 | 0 |
| 3254 | 0 |
| 3255 | 0 |
| 3256 | 0 |
| 3257 | 0 |
| 3258 | 0 |
| 3259 | 0 |
| 3260 | 0 |
| 3261 | 0 |
| 3262 | 0 |
| 3263 | 0 |
| 3264 | 0 |
| 3265 | 0 |
| 3266 | 0 |
| 3267 | 0 |
| 3268 | 0 |
| 3269 | 0 |
| 3270 | 0 |
| 3271 | 0 |
| 3272 | 0 |
| 3273 | 0 |
| 3274 | 0 |
| 3275 | 0 |
| 3276 | 0 |
| 3277 | 0 |
| 3278 | 0 |
| 3279 | 0 |
| 3280 | 0 |
| 3281 | 0 |
| 3282 | 0 |
| 3283 | 0 |
| 3284 | 0 |
| 3285 | 0 |
| 3286 | 0 |
| 3287 | 0 |
| 3288 | 0 |
| 3289 | 0 |
| 3290 | 0 |
| 3291 | 0 |
| 3292 | 0 |
| 3293 | 0 |
| 3294 | 0 |
| 3295 | 0 |
| 3296 | 0 |
| 3297 | 0 |
| 3298 | 0 |
| 3299 | 0 |
| 3300 | 0 |
| 3301 | 0 |
| 3302 | 0 |
| 3303 | 0 |
| 3304 | 0 |
| 3305 | 0 |
| 3306 | 0 |
| 3307 | 0 |
| 3308 | 0 |
| 3309 | 0 |
| 3310 | 0 |
| 3311 | 0 |
| 3312 | 0 |
| 3313 | 0 |
| 3314 | 0 |
| 3315 | 0 |
| 3316 | 0 |
| 3317 | 0 |
| 3318 | 0 |
| 3319 | 0 |
| 3320 | 0 |
| 3321 | 0 |
| 3322 | 0 |
| 3323 | 0 |
| 3324 | 0 |
| 3325 | 0 |
| 3326 | 0 |
| 3327 | 0 |
| 3328 | 0 |
| 3329 | 0 |
| 3330 | 0 |
| 3331 | 0 |
| 3332 | 0 |
| 3333 | 0 |
| 3334 | 0 |
| 3335 | 0 |
| 3336 | 0 |
| 3337 | 0 |
| 3338 | 0 |
| 3339 | 0 |
| 3340 | 0 |
| 3341 | 0 |
| 3342 | 0 |
| 3343 | 0 |
| 3344 | 0 |
| 3345 | 0 |
| 3346 | 0 |
| 3347 | 0 |
| 3348 | 0 |
| 3349 | 0 |
| 3350 | 0 |
| 3351 | 0 |
| 3352 | 0 |
| 3353 | 0 |
| 3354 | 0 |
| 3355 | 0 |
| 3356 | 0 |
| 3357 | 0 |
| 3358 | 0 |
| 3359 | 0 |
| 3360 | 0 |
| 3361 | 0 |
| 3362 | 0 |
| 3363 | 0 |
| 3364 | 0 |
| 3365 | 0 |
| 3366 | 0 |
| 3367 | 0 |
| 3368 | 0 |
| 3369 | 0 |
| 3370 | 0 |
| 3371 | 0 |
| 3372 | 0 |
| 3373 | 0 |
| 3374 | 0 |
| 3375 | 0 |
| 3376 | 0 |
| 3377 | 0 |
| 3378 | 0 |
| 3379 | 0 |
| 3380 | 0 |
| 3381 | 0 |
| 3382 | 0 |
| 3383 | 0 |
| 3384 | 0 |
| 3385 | 0 |
| 3386 | 0 |
| 3387 | 0 |
| 3388 | 0 |
| 3389 | 0 |
| 3390 | 0 |
| 3391 | 0 |
| 3392 | 0 |
| 3393 | 0 |
| 3394 | 0 |
| 3395 | 0 |
| 3396 | 0 |
| 3397 | 0 |
| 3398 | 0 |
| 3399 | 0 |
| 3400 | 0 |
| 3401 | 0 |
| 3402 | 0 |
| 3403 | 0 |
| 3404 | 0 |
| 3405 | 0 |
| 3406 | 0 |
| 3407 | 0 |
| 3408 | 0 |
| 3409 | 0 |
| 3410 | 0 |
| 3411 | 0 |
| 3412 | 0 |
| 3413 | 0 |
| 3414 | 0 |
| 3415 | 0 |
| 3416 | 0 |
| 3417 | 0 |
| 3418 | 0 |
| 3419 | 0 |
| 3420 | 0 |
| 3421 | 0 |
| 3422 | 0 |
| 3423 | 0 |
| 3424 | 0 |
| 3425 | 0 |
| 3426 | 0 |
| 3427 | 0 |
| 3428 | 0 |
| 3429 | 0 |
| 3430 | 0 |
| 3431 | 0 |
| 3432 | 0 |
| 3433 | 0 |
| 3434 | 0 |
| 3435 | 0 |
| 3436 | 0 |
| 3437 | 0 |
| 3438 | 0 |
| 3439 | 0 |
| 3440 | 0 |
| 3441 | 0 |
| 3442 | 0 |
| 3443 | 0 |
| 3444 | 0 |
| 3445 | 0 |
| 3446 | 0 |
| 3447 | 0 |
| 3448 | 0 |
| 3449 | 0 |
| 3450 | 0 |
| 3451 | 0 |
| 3452 | 0 |
| 3453 | 0 |
| 3454 | 0 |
| 3455 | 0 |
| 3456 | 0 |
| 3457 | 0 |
| 3458 | 0 |
| 3459 | 0 |
| 3460 | 0 |
| 3461 | 0 |
| 3462 | 0 |
| 3463 | 0 |
| 3464 | 0 |
| 3465 | 0 |
| 3466 | 0 |
| 3467 | 0 |
| 3468 | 0 |
| 3469 | 0 |
| 3470 | 0 |
| 3471 | 0 |
| 3472 | 0 |
| 3473 | 0 |
| 3474 | 0 |
| 3475 | 0 |
| 3476 | 0 |
| 3477 | 0 |
| 3478 | 0 |
| 3479 | 0 |
| 3480 | 0 |
| 3481 | 0 |
| 3482 | 0 |
| 3483 | 0 |
| 3484 | 0 |
| 3485 | 0 |
| 3486 | 0 |
| 3487 | 0 |
| 3488 | 0 |
| 3489 | 0 |
| 3490 | 0 |
| 3491 | 0 |
| 3492 | 0 |
| 3493 | 0 |
| 3494 | 0 |
| 3495 | 0 |
| 3496 | 0 |
| 3497 | 0 |
| 3498 | 0 |
| 3499 | 0 |
| 3500 | 0 |
| 3501 | 0 |
| 3502 | 0 |
| 3503 | 0 |
| 3504 | 0 |
| 3505 | 0 |
| 3506 | 0 |
| 3507 | 0 |
| 3508 | 0 |
| 3509 | 0 |
| 3510 | 0 |
| 3511 | 0 |
| 3512 | 0 |
| 3513 | 0 |
| 3514 | 0 |
| 3515 | 0 |
| 3516 | 0 |
| 3517 | 0 |
| 3518 | 0 |
| 3519 | 0 |
| 3520 | 0 |
| 3521 | 0 |
| 3522 | 0 |
| 3523 | 0 |
| 3524 | 0 |
| 3525 | 0 |
| 3526 | 0 |
| 3527 | 0 |
| 3528 | 0 |
| 3529 | 0 |
| 3530 | 0 |
| 3531 | 0 |
| 3532 | 0 |
| 3533 | 0 |
| 3534 | 0 |
| 3535 | 0 |
| 3536 | 0 |
| 3537 | 0 |
| 3538 | 0 |
| 3539 | 0 |
| 3540 | 0 |
| 3541 | 0 |
| 3542 | 0 |
| 3543 | 0 |
| 3544 | 0 |
| 3545 | 0 |
| 3546 | 0 |
| 3547 | 0 |
| 3548 | 0 |
| 3549 | 0 |
| 3550 | 0 |
| 3551 | 0 |
| 3552 | 0 |
| 3553 | 0 |
| 3554 | 0 |
| 3555 | 0 |
| 3556 | 0 |
| 3557 | 0 |
| 3558 | 0 |
| 3559 | 0 |
| 3560 | 0 |
| 3561 | 0 |
| 3562 | 0 |
| 3563 | 0 |
| 3564 | 0 |
| 3565 | 0 |
| 3566 | 0 |
| 3567 | 0 |
| 3568 | 0 |
| 3569 | 0 |
| 3570 | 0 |
| 3571 | 0 |
| 3572 | 0 |
| 3573 | 0 |
| 3574 | 0 |
| 3575 | 0 |
| 3576 | 0 |
| 3577 | 0 |
| 3578 | 0 |
| 3579 | 0 |
| 3580 | 0 |
| 3581 | 0 |
| 3582 | 0 |
| 3583 | 0 |
| 3584 | 0 |
| 3585 | 0 |
| 3586 | 0 |
| 3587 | 0 |
| 3588 | 0 |
| 3589 | 0 |
| 3590 | 0 |
| 3591 | 0 |
| 3592 | 0 |
| 3593 | 0 |
| 3594 | 0 |
| 3595 | 0 |
| 3596 | 0 |
| 3597 | 0 |
| 3598 | 0 |
| 3599 | 0 |
| 3600 | 0 |
| 3601 | 0 |
| 3602 | 0 |
| 3603 | 0 |
| 3604 | 0 |
| 3605 | 0 |
| 3606 | 0 |
| 3607 | 0 |
| 3608 | 0 |
| 3609 | 0 |
| 3610 | 0 |
| 3611 | 0 |
| 3612 | 0 |
| 3613 | 0 |
| 3614 | 0 |
| 3615 | 0 |
| 3616 | 0 |
| 3617 | 0 |
| 3618 | 0 |
| 3619 | 0 |
| 3620 | 0 |
| 3621 | 0 |
| 3622 | 0 |
| 3623 | 0 |
| 3624 | 0 |
| 3625 | 0 |
| 3626 | 0 |
| 3627 | 0 |
| 3628 | 0 |
| 3629 | 0 |
| 3630 | 0 |
| 3631 | 0 |
| 3632 | 0 |
| 3633 | 0 |
| 3634 | 0 |
| 3635 | 0 |
| 3636 | 0 |
| 3637 | 0 |
| 3638 | 0 |
| 3639 | 0 |
| 3640 | 0 |
| 3641 | 0 |
| 3642 | 0 |
| 3643 | 0 |
| 3644 | 0 |
| 3645 | 0 |
| 3646 | 0 |
| 3647 | 0 |
| 3648 | 0 |
| 3649 | 0 |
| 3650 | 0 |
| 3651 | 0 |
| 3652 | 0 |
| 3653 | 0 |
| 3654 | 0 |
| 3655 | 0 |
| 3656 | 0 |
| 3657 | 0 |
| 3658 | 0 |
| 3659 | 0 |
| 3660 | 0 |
| 3661 | 0 |
| 3662 | 0 |
| 3663 | 0 |
| 3664 | 0 |
| 3665 | 0 |
| 3666 | 0 |
| 3667 | 0 |
| 3668 | 0 |
| 3669 | 0 |
| 3670 | 0 |
| 3671 | 0 |
| 3672 | 0 |
| 3673 | 0 |
| 3674 | 0 |
| 3675 | 0 |
| 3676 | 0 |
| 3677 | 0 |
| 3678 | 0 |
| 3679 | 0 |
| 3680 | 0 |
| 3681 | 0 |
| 3682 | 0 |
| 3683 | 0 |
| 3684 | 0 |
| 3685 | 0 |
| 3686 | 0 |
| 3687 | 0 |
| 3688 | 0 |
| 3689 | 0 |
| 3690 | 0 |
| 3691 | 0 |
| 3692 | 0 |
| 3693 | 0 |
| 3694 | 0 |
| 3695 | 0 |
| 3696 | 0 |
| 3697 | 0 |
| 3698 | 0 |
| 3699 | 0 |
| 3700 | 0 |
| 3701 | 0 |
| 3702 | 0 |
| 3703 | 0 |
| 3704 | 0 |
| 3705 | 0 |
| 3706 | 0 |
| 3707 | 0 |
| 3708 | 0 |
| 3709 | 0 |
| 3710 | 0 |
| 3711 | 0 |
| 3712 | 0 |
| 3713 | 0 |
| 3714 | 0 |
| 3715 | 0 |
| 3716 | 0 |
| 3717 | 0 |
| 3718 | 0 |
| 3719 | 0 |
| 3720 | 0 |
| 3721 | 0 |
| 3722 | 0 |
| 3723 | 0 |
| 3724 | 0 |
| 3725 | 0 |
| 3726 | 0 |
| 3727 | 0 |
| 3728 | 0 |
| 3729 | 0 |
| 3730 | 0 |
| 3731 | 0 |
| 3732 | 0 |
| 3733 | 0 |
| 3734 | 0 |
| 3735 | 0 |
| 3736 | 0 |
| 3737 | 0 |
| 3738 | 0 |
| 3739 | 0 |
| 3740 | 0 |
| 3741 | 0 |
| 3742 | 0 |
| 3743 | 0 |
| 3744 | 0 |
| 3745 | 0 |
| 3746 | 0 |
| 3747 | 0 |
| 3748 | 0 |
| 3749 | 0 |
| 3750 | 0 |
| 3751 | 0 |
| 3752 | 0 |
| 3753 | 0 |
| 3754 | 0 |
| 3755 | 0 |
| 3756 | 0 |
| 3757 | 0 |
| 3758 | 0 |
| 3759 | 0 |
| 3760 | 0 |
| 3761 | 0 |
| 3762 | 0 |
| 3763 | 0 |
| 3764 | 0 |
| 3765 | 0 |
| 3766 | 0 |
| 3767 | 0 |
| 3768 | 0 |
| 3769 | 0 |
| 3770 | 0 |
| 3771 | 0 |
| 3772 | 0 |
| 3773 | 0 |
| 3774 | 0 |
| 3775 | 0 |
| 3776 | 0 |
| 3777 | 0 |
| 3778 | 0 |
| 3779 | 0 |
| 3780 | 0 |
| 3781 | 0 |
| 3782 | 0 |
| 3783 | 0 |
| 3784 | 0 |
| 3785 | 0 |
| 3786 | 0 |
| 3787 | 0 |
| 3788 | 0 |
| 3789 | 0 |
| 3790 | 0 |
| 3791 | 0 |
| 3792 | 0 |
| 3793 | 0 |
| 3794 | 0 |
| 3795 | 0 |
| 3796 | 0 |
| 3797 | 0 |
| 3798 | 0 |
| 3799 | 0 |
| 3800 | 0 |
| 3801 | 0 |
| 3802 | 0 |
| 3803 | 0 |
| 3804 | 0 |
| 3805 | 0 |
| 3806 | 0 |
| 3807 | 0 |
| 3808 | 0 |
| 3809 | 0 |
| 3810 | 0 |
| 3811 | 0 |
| 3812 | 0 |
| 3813 | 0 |
| 3814 | 0 |
| 3815 | 0 |
| 3816 | 0 |
| 3817 | 0 |
| 3818 | 0 |
| 3819 | 0 |
| 3820 | 0 |
| 3821 | 0 |
| 3822 | 0 |
| 3823 | 0 |
| 3824 | 0 |
| 3825 | 0 |
| 3826 | 0 |
| 3827 | 0 |
| 3828 | 0 |
| 3829 | 0 |
| 3830 | 0 |
| 3831 | 0 |
| 3832 | 0 |
| 3833 | 0 |
| 3834 | 0 |
| 3835 | 0 |
| 3836 | 0 |
| 3837 | 0 |
| 3838 | 0 |
| 3839 | 0 |
| 3840 | 0 |
| 3841 | 0 |
| 3842 | 0 |
| 3843 | 0 |
| 3844 | 0 |
| 3845 | 0 |
| 3846 | 0 |
| 3847 | 0 |
| 3848 | 0 |
| 3849 | 0 |
| 3850 | 0 |
| 3851 | 0 |
| 3852 | 0 |
| 3853 | 0 |
| 3854 | 0 |
| 3855 | 0 |
| 3856 | 0 |
| 3857 | 0 |
| 3858 | 0 |
| 3859 | 0 |
| 3860 | 0 |
| 3861 | 0 |
| 3862 | 0 |
| 3863 | 0 |
| 3864 | 0 |
| 3865 | 0 |
| 3866 | 0 |
| 3867 | 0 |
| 3868 | 0 |
| 3869 | 0 |
| 3870 | 0 |
| 3871 | 0 |
| 3872 | 0 |
| 3873 | 0 |
| 3874 | 0 |
| 3875 | 0 |
| 3876 | 0 |
| 3877 | 0 |
| 3878 | 0 |
| 3879 | 0 |
| 3880 | 0 |
| 3881 | 0 |
| 3882 | 0 |
| 3883 | 0 |
| 3884 | 0 |
| 3885 | 0 |
| 3886 | 0 |
| 3887 | 0 |
| 3888 | 0 |
| 3889 | 0 |
| 3890 | 0 |
| 3891 | 0 |
| 3892 | 0 |
| 3893 | 0 |
| 3894 | 0 |
| 3895 | 0 |
| 3896 | 0 |
| 3897 | 0 |
| 3898 | 0 |
| 3899 | 0 |
| 3900 | 0 |
| 3901 | 0 |
| 3902 | 0 |
| 3903 | 0 |
| 3904 | 0 |
| 3905 | 0 |
| 3906 | 0 |
| 3907 | 0 |
| 3908 | 0 |
| 3909 | 0 |
| 3910 | 0 |
| 3911 | 0 |
| 3912 | 0 |
| 3913 | 0 |
| 3914 | 0 |
| 3915 | 0 |
| 3916 | 0 |
| 3917 | 0 |
| 3918 | 0 |
| 3919 | 0 |
| 3920 | 0 |
| 3921 | 0 |
| 3922 | 0 |
| 3923 | 0 |
| 3924 | 0 |
| 3925 | 0 |
| 3926 | 0 |
| 3927 | 0 |
| 3928 | 0 |
| 3929 | 0 |
| 3930 | 0 |
| 3931 | 0 |
| 3932 | 0 |
| 3933 | 0 |
| 3934 | 0 |
| 3935 | 0 |
| 3936 | 0 |
| 3937 | 0 |
| 3938 | 0 |
| 3939 | 0 |
| 3940 | 0 |
| 3941 | 0 |
| 3942 | 0 |
| 3943 | 0 |
| 3944 | 0 |
| 3945 | 0 |
| 3946 | 0 |
| 3947 | 0 |
| 3948 | 0 |
| 3949 | 0 |
| 3950 | 0 |
| 3951 | 0 |
| 3952 | 0 |
| 3953 | 0 |
| 3954 | 0 |
| 3955 | 0 |
| 3956 | 0 |
| 3957 | 0 |
| 3958 | 0 |
| 3959 | 0 |
| 3960 | 0 |
| 3961 | 0 |
| 3962 | 0 |
| 3963 | 0 |
| 3964 | 0 |
| 3965 | 0 |
| 3966 | 0 |
| 3967 | 0 |
| 3968 | 0 |
| 3969 | 0 |
| 3970 | 0 |
| 3971 | 0 |
| 3972 | 0 |
| 3973 | 0 |
| 3974 | 0 |
| 3975 | 0 |
| 3976 | 0 |
| 3977 | 0 |
| 3978 | 0 |
| 3979 | 0 |
| 3980 | 0 |
| 3981 | 0 |
| 3982 | 0 |
| 3983 | 0 |
| 3984 | 0 |
| 3985 | 0 |
| 3986 | 0 |
| 3987 | 0 |
| 3988 | 0 |
| 3989 | 0 |
| 3990 | 0 |
| 3991 | 0 |
| 3992 | 0 |
| 3993 | 0 |
| 3994 | 0 |
| 3995 | 0 |
| 3996 | 0 |
| 3997 | 0 |
| 3998 | 0 |
| 3999 | 0 |
| 4000 | 0 |
| 4001 | 0 |
| 4002 | 0 |
| 4003 | 0 |
| 4004 | 0 |
| 4005 | 0 |
| 4006 | 0 |
| 4007 | 0 |
| 4008 | 0 |
| 4009 | 0 |
| 4010 | 0 |
| 4011 | 0 |
| 4012 | 0 |
| 4013 | 0 |
| 4014 | 0 |
| 4015 | 0 |
| 4016 | 0 |
| 4017 | 0 |
| 4018 | 0 |
| 4019 | 0 |
| 4020 | 0 |
| 4021 | 0 |
| 4022 | 0 |
| 4023 | 0 |
| 4024 | 0 |
| 4025 | 0 |
| 4026 | 0 |
| 4027 | 0 |
| 4028 | 0 |
| 4029 | 0 |
| 4030 | 0 |
| 4031 | 0 |
| 4032 | 0 |
| 4033 | 0 |
| 4034 | 0 |
| 4035 | 0 |
| 4036 | 0 |
| 4037 | 0 |
| 4038 | 0 |
| 4039 | 0 |
| 4040 | 0 |
| 4041 | 0 |
| 4042 | 0 |
| 4043 | 0 |
| 4044 | 0 |
| 4045 | 0 |
| 4046 | 0 |
| 4047 | 0 |
| 4048 | 0 |
| 4049 | 0 |
| 4050 | 0 |
| 4051 | 0 |
| 4052 | 0 |
| 4053 | 0 |
| 4054 | 0 |
| 4055 | 0 |
| 4056 | 0 |
| 4057 | 0 |
| 4058 | 0 |
| 4059 | 0 |
| 4060 | 0 |
| 4061 | 0 |
| 4062 | 0 |
| 4063 | 0 |
| 4064 | 0 |
| 4065 | 0 |
| 4066 | 0 |
| 4067 | 0 |
| 4068 | 0 |
| 4069 | 0 |
| 4070 | 0 |
| 4071 | 0 |
| 4072 | 0 |
| 4073 | 0 |
| 4074 | 0 |
| 4075 | 0 |
| 4076 | 0 |
| 4077 | 0 |
| 4078 | 0 |
| 4079 | 0 |
| 4080 | 0 |
| 4081 | 0 |
| 4082 | 0 |
| 4083 | 0 |
| 4084 | 0 |
| 4085 | 0 |
| 4086 | 0 |
| 4087 | 0 |
| 4088 | 0 |
| 4089 | 0 |
| 4090 | 0 |
| 4091 | 0 |
| 4092 | 0 |
| 4093 | 0 |
| 4094 | 0 |
| 4095 | 0 |
| 4096 | 0 |
| 4097 | 0 |
| 4098 | 0 |
| 4099 | 0 |
| 4100 | 0 |
| 4101 | 0 |
| 4102 | 0 |
| 4103 | 0 |
| 4104 | 0 |
| 4105 | 0 |
| 4106 | 0 |
| 4107 | 0 |
| 4108 | 0 |
| 4109 | 0 |
| 4110 | 0 |
| 4111 | 0 |
| 4112 | 0 |
| 4113 | 0 |
| 4114 | 0 |
| 4115 | 0 |
| 4116 | 0 |
| 4117 | 0 |
| 4118 | 0 |
| 4119 | 0 |
| 4120 | 0 |
| 4121 | 0 |
| 4122 | 0 |
| 4123 | 0 |
| 4124 | 0 |
| 4125 | 0 |
| 4126 | 0 |
| 4127 | 0 |
| 4128 | 0 |
| 4129 | 0 |
| 4130 | 0 |
| 4131 | 0 |
| 4132 | 0 |
| 4133 | 0 |
| 4134 | 0 |
| 4135 | 0 |
| 4136 | 0 |
| 4137 | 0 |
| 4138 | 0 |
| 4139 | 0 |
| 4140 | 0 |
| 4141 | 0 |
| 4142 | 0 |
| 4143 | 0 |
| 4144 | 0 |
| 4145 | 0 |
| 4146 | 0 |
| 4147 | 0 |
| 4148 | 0 |
| 4149 | 0 |
| 4150 | 0 |
| 4151 | 0 |
| 4152 | 0 |
| 4153 | 0 |
| 4154 | 0 |
| 4155 | 0 |
| 4156 | 0 |
| 4157 | 0 |
| 4158 | 0 |
| 4159 | 0 |
| 4160 | 0 |
| 4161 | 0 |
| 4162 | 0 |
| 4163 | 0 |
| 4164 | 0 |
| 4165 | 0 |
| 4166 | 0 |
| 4167 | 0 |
| 4168 | 0 |
| 4169 | 0 |
| 4170 | 0 |
| 4171 | 0 |
| 4172 | 0 |
| 4173 | 0 |
| 4174 | 0 |
| 4175 | 0 |
| 4176 | 0 |
| 4177 | 0 |
| 4178 | 0 |
| 4179 | 0 |
| 4180 | 0 |
| 4181 | 0 |
| 4182 | 0 |
| 4183 | 0 |
| 4184 | 0 |
| 4185 | 0 |
| 4186 | 0 |
| 4187 | 0 |
| 4188 | 0 |
| 4189 | 0 |
| 4190 | 0 |
| 4191 | 0 |
| 4192 | 0 |
| 4193 | 0 |
| 4194 | 0 |
| 4195 | 0 |
| 4196 | 0 |
| 4197 | 0 |
| 4198 | 0 |
| 4199 | 0 |
| 4200 | 0 |
| 4201 | 0 |
| 4202 | 0 |
| 4203 | 0 |
| 4204 | 0 |
| 4205 | 0 |
| 4206 | 0 |
| 4207 | 0 |
| 4208 | 0 |
| 4209 | 0 |
| 4210 | 0 |
| 4211 | 0 |
| 4212 | 0 |
| 4213 | 0 |
| 4214 | 0 |
| 4215 | 0 |
| 4216 | 0 |
| 4217 | 0 |
| 4218 | 0 |
| 4219 | 0 |
| 4220 | 0 |
| 4221 | 0 |
| 4222 | 0 |
| 4223 | 0 |
| 4224 | 0 |
| 4225 | 0 |
| 4226 | 0 |
| 4227 | 0 |
| 4228 | 0 |
| 4229 | 0 |
| 4230 | 0 |
| 4231 | 0 |
| 4232 | 0 |
| 4233 | 0 |
| 4234 | 0 |
| 4235 | 0 |
| 4236 | 0 |
| 4237 | 0 |
| 4238 | 0 |
| 4239 | 0 |
| 4240 | 0 |
| 4241 | 0 |
| 4242 | 0 |
| 4243 | 0 |
| 4244 | 0 |
| 4245 | 0 |
| 4246 | 0 |
| 4247 | 0 |
| 4248 | 0 |
| 4249 | 0 |
| 4250 | 0 |
| 4251 | 0 |
| 4252 | 0 |
| 4253 | 0 |
| 4254 | 0 |
| 4255 | 0 |
| 4256 | 0 |
| 4257 | 0 |
| 4258 | 0 |
| 4259 | 0 |
| 4260 | 0 |
| 4261 | 0 |
| 4262 | 0 |
| 4263 | 0 |
| 4264 | 0 |
| 4265 | 0 |
| 4266 | 0 |
| 4267 | 0 |
| 4268 | 0 |
| 4269 | 0 |
| 4270 | 0 |
| 4271 | 0 |
| 4272 | 0 |
| 4273 | 0 |
| 4274 | 0 |
| 4275 | 0 |
| 4276 | 0 |
| 4277 | 0 |
| 4278 | 0 |
| 4279 | 0 |
| 4280 | 0 |
| 4281 | 0 |
| 4282 | 0 |
| 4283 | 0 |
| 4284 | 0 |
| 4285 | 0 |
| 4286 | 0 |
| 4287 | 0 |
| 4288 | 0 |
| 4289 | 0 |
| 4290 | 0 |
| 4291 | 0 |
| 4292 | 0 |
| 4293 | 0 |
| 4294 | 0 |
| 4295 | 0 |
| 4296 | 0 |
| 4297 | 0 |
| 4298 | 0 |
| 4299 | 0 |
| 4300 | 0 |
| 4301 | 0 |
| 4302 | 0 |
| 4303 | 0 |
| 4304 | 0 |
| 4305 | 0 |
| 4306 | 0 |
| 4307 | 0 |
| 4308 | 0 |
| 4309 | 0 |
| 4310 | 0 |
| 4311 | 0 |
| 4312 | 0 |
| 4313 | 0 |
| 4314 | 0 |
| 4315 | 0 |
| 4316 | 0 |
| 4317 | 0 |
| 4318 | 0 |
| 4319 | 0 |
| 4320 | 0 |
| 4321 | 0 |
| 4322 | 0 |
| 4323 | 0 |
| 4324 | 0 |
| 4325 | 0 |
| 4326 | 0 |
| 4327 | 0 |
| 4328 | 0 |
| 4329 | 0 |
| 4330 | 0 |
| 4331 | 0 |
| 4332 | 0 |
| 4333 | 0 |
| 4334 | 0 |
| 4335 | 0 |
| 4336 | 0 |
| 4337 | 0 |
| 4338 | 0 |
| 4339 | 0 |
| 4340 | 0 |
| 4341 | 0 |
| 4342 | 0 |
| 4343 | 0 |
| 4344 | 0 |
| 4345 | 0 |
| 4346 | 0 |
| 4347 | 0 |
| 4348 | 0 |
| 4349 | 0 |
| 4350 | 0 |
| 4351 | 0 |
| 4352 | 0 |
| 4353 | 0 |
| 4354 | 0 |
| 4355 | 0 |
| 4356 | 0 |
| 4357 | 0 |
| 4358 | 0 |
| 4359 | 0 |
| 4360 | 0 |
| 4361 | 0 |
| 4362 | 0 |
| 4363 | 0 |
| 4364 | 0 |
| 4365 | 0 |
| 4366 | 0 |
| 4367 | 0 |
| 4368 | 0 |
| 4369 | 0 |
| 4370 | 0 |
| 4371 | 0 |
| 4372 | 0 |
| 4373 | 0 |
| 4374 | 0 |
| 4375 | 0 |
| 4376 | 0 |
| 4377 | 0 |
| 4378 | 0 |
| 4379 | 0 |
| 4380 | 0 |
| 4381 | 0 |
| 4382 | 0 |
| 4383 | 0 |
| 4384 | 0 |
| 4385 | 0 |
| 4386 | 0 |
| 4387 | 0 |
| 4388 | 0 |
| 4389 | 0 |
| 4390 | 0 |
| 4391 | 0 |
| 4392 | 0 |
| 4393 | 0 |
| 4394 | 0 |
| 4395 | 0 |
| 4396 | 0 |
| 4397 | 0 |
| 4398 | 0 |
| 4399 | 0 |
| 4400 | 0 |
| 4401 | 0 |
| 4402 | 0 |
| 4403 | 0 |
| 4404 | 0 |
| 4405 | 0 |
| 4406 | 0 |
| 4407 | 0 |
| 4408 | 0 |
| 4409 | 0 |
| 4410 | 0 |
| 4411 | 0 |
| 4412 | 0 |
| 4413 | 0 |
| 4414 | 0 |
| 4415 | 0 |
| 4416 | 0 |
| 4417 | 0 |
| 4418 | 0 |
| 4419 | 0 |
| 4420 | 0 |
| 4421 | 0 |
| 4422 | 0 |
| 4423 | 0 |
| 4424 | 0 |
| 4425 | 0 |
| 4426 | 0 |
| 4427 | 0 |
| 4428 | 0 |
| 4429 | 0 |
| 4430 | 0 |
| 4431 | 0 |
| 4432 | 0 |
| 4433 | 0 |
| 4434 | 0 |
| 4435 | 0 |
| 4436 | 0 |
| 4437 | 0 |
| 4438 | 0 |
| 4439 | 0 |
| 4440 | 0 |
| 4441 | 0 |
| 4442 | 0 |
| 4443 | 0 |
| 4444 | 0 |
| 4445 | 0 |
| 4446 | 0 |
| 4447 | 0 |
| 4448 | 0 |
| 4449 | 0 |
| 4450 | 0 |
| 4451 | 0 |
| 4452 | 0 |
| 4453 | 0 |
| 4454 | 0 |
| 4455 | 0 |
| 4456 | 0 |
| 4457 | 0 |
| 4458 | 0 |
| 4459 | 0 |
| 4460 | 0 |
| 4461 | 0 |
| 4462 | 0 |
| 4463 | 0 |
| 4464 | 0 |
| 4465 | 0 |
| 4466 | 0 |
| 4467 | 0 |
| 4468 | 0 |
| 4469 | 0 |
| 4470 | 0 |
| 4471 | 0 |
| 4472 | 0 |
| 4473 | 0 |
| 4474 | 0 |
| 4475 | 0 |
| 4476 | 0 |
| 4477 | 0 |
| 4478 | 0 |
| 4479 | 0 |
| 4480 | 0 |
| 4481 | 0 |
| 4482 | 0 |
| 4483 | 0 |
| 4484 | 0 |
| 4485 | 0 |
| 4486 | 0 |
| 4487 | 0 |
| 4488 | 0 |
| 4489 | 0 |
| 4490 | 0 |
| 4491 | 0 |
| 4492 | 0 |
| 4493 | 0 |
| 4494 | 0 |
| 4495 | 0 |
| 4496 | 0 |
| 4497 | 0 |
| 4498 | 0 |
| 4499 | 0 |
| 4500 | 0 |
| 4501 | 0 |
| 4502 | 0 |
| 4503 | 0 |
| 4504 | 0 |
| 4505 | 0 |
| 4506 | 0 |
| 4507 | 0 |
| 4508 | 0 |
| 4509 | 0 |
| 4510 | 0 |
| 4511 | 0 |
| 4512 | 0 |
| 4513 | 0 |
| 4514 | 0 |
| 4515 | 0 |
| 4516 | 0 |
| 4517 | 0 |
| 4518 | 0 |
| 4519 | 0 |
| 4520 | 0 |
| 4521 | 0 |
| 4522 | 0 |
| 4523 | 0 |
| 4524 | 0 |
| 4525 | 0 |
| 4526 | 0 |
| 4527 | 0 |
| 4528 | 0 |
| 4529 | 0 |
| 4530 | 0 |
| 4531 | 0 |
| 4532 | 0 |
| 4533 | 0 |
| 4534 | 0 |
| 4535 | 0 |
| 4536 | 0 |
| 4537 | 0 |
| 4538 | 0 |
| 4539 | 0 |
| 4540 | 0 |
| 4541 | 0 |
| 4542 | 0 |
| 4543 | 0 |
| 4544 | 0 |
| 4545 | 0 |
| 4546 | 0 |
| 4547 | 0 |
| 4548 | 0 |
| 4549 | 0 |
| 4550 | 0 |
| 4551 | 0 |
| 4552 | 0 |
| 4553 | 0 |
| 4554 | 0 |
| 4555 | 0 |
| 4556 | 0 |
| 4557 | 0 |
| 4558 | 0 |
| 4559 | 0 |
| 4560 | 0 |
| 4561 | 0 |
| 4562 | 0 |
| 4563 | 0 |
| 4564 | 0 |
| 4565 | 0 |
| 4566 | 0 |
| 4567 | 0 |
| 4568 | 0 |
| 4569 | 0 |
| 4570 | 0 |
| 4571 | 0 |
| 4572 | 0 |
| 4573 | 0 |
| 4574 | 0 |
| 4575 | 0 |
| 4576 | 0 |
| 4577 | 0 |
| 4578 | 0 |
| 4579 | 0 |
| 4580 | 0 |
| 4581 | 0 |
| 4582 | 0 |
| 4583 | 0 |
| 4584 | 0 |
| 4585 | 0 |
| 4586 | 0 |
| 4587 | 0 |
| 4588 | 0 |
| 4589 | 0 |
| 4590 | 0 |
| 4591 | 0 |
| 4592 | 0 |
| 4593 | 0 |
| 4594 | 0 |
| 4595 | 0 |
| 4596 | 0 |
| 4597 | 0 |
| 4598 | 0 |
| 4599 | 0 |
| 4600 | 0 |
| 4601 | 0 |
| 4602 | 0 |
| 4603 | 0 |
| 4604 | 0 |
| 4605 | 0 |
| 4606 | 0 |
| 4607 | 0 |
| 4608 | 0 |
| 4609 | 0 |
| 4610 | 0 |
| 4611 | 0 |
| 4612 | 0 |
| 4613 | 0 |
| 4614 | 0 |
| 4615 | 0 |
| 4616 | 0 |
| 4617 | 0 |
| 4618 | 0 |
| 4619 | 0 |
| 4620 | 0 |
| 4621 | 0 |
| 4622 | 0 |
| 4623 | 0 |
| 4624 | 0 |
| 4625 | 0 |
| 4626 | 0 |
| 4627 | 0 |
| 4628 | 0 |
| 4629 | 0 |
| 4630 | 0 |
| 4631 | 0 |
| 4632 | 0 |
| 4633 | 0 |
| 4634 | 0 |
| 4635 | 0 |
| 4636 | 0 |
| 4637 | 0 |
| 4638 | 0 |
| 4639 | 0 |
| 4640 | 0 |
| 4641 | 0 |
| 4642 | 0 |
| 4643 | 0 |
| 4644 | 0 |
| 4645 | 0 |
| 4646 | 0 |
| 4647 | 0 |
| 4648 | 0 |
| 4649 | 0 |
| 4650 | 0 |
| 4651 | 0 |
| 4652 | 0 |
| 4653 | 0 |
| 4654 | 0 |
| 4655 | 0 |
| 4656 | 0 |
| 4657 | 0 |
| 4658 | 0 |
| 4659 | 0 |
| 4660 | 0 |
| 4661 | 0 |
| 4662 | 0 |
| 4663 | 0 |
| 4664 | 0 |
| 4665 | 0 |
| 4666 | 0 |
| 4667 | 0 |
| 4668 | 0 |
| 4669 | 0 |
| 4670 | 0 |
| 4671 | 0 |
| 4672 | 0 |
| 4673 | 0 |
| 4674 | 0 |
| 4675 | 0 |
| 4676 | 0 |
| 4677 | 0 |
| 4678 | 0 |
| 4679 | 0 |
| 4680 | 0 |
| 4681 | 0 |
| 4682 | 0 |
| 4683 | 0 |
| 4684 | 0 |
| 4685 | 0 |
| 4686 | 0 |
| 4687 | 0 |
| 4688 | 0 |
| 4689 | 0 |
| 4690 | 0 |
| 4691 | 0 |
| 4692 | 0 |
| 4693 | 0 |
| 4694 | 0 |
| 4695 | 0 |
| 4696 | 0 |
| 4697 | 0 |
| 4698 | 0 |
| 4699 | 0 |
| 4700 | 0 |
| 4701 | 0 |
| 4702 | 0 |
| 4703 | 0 |
| 4704 | 0 |
| 4705 | 0 |
| 4706 | 0 |
| 4707 | 0 |
| 4708 | 0 |
| 4709 | 0 |
| 4710 | 0 |
| 4711 | 0 |
| 4712 | 0 |
| 4713 | 0 |
| 4714 | 0 |
| 4715 | 0 |
| 4716 | 0 |
| 4717 | 0 |
| 4718 | 0 |
| 4719 | 0 |
| 4720 | 0 |
| 4721 | 0 |
| 4722 | 0 |
| 4723 | 0 |
| 4724 | 0 |
| 4725 | 0 |
| 4726 | 0 |
| 4727 | 0 |
| 4728 | 0 |
| 4729 | 0 |
| 4730 | 0 |
| 4731 | 0 |
| 4732 | 0 |
| 4733 | 0 |
| 4734 | 0 |
| 4735 | 0 |
| 4736 | 0 |
| 4737 | 0 |
| 4738 | 0 |
| 4739 | 0 |
| 4740 | 0 |
| 4741 | 0 |
| 4742 | 0 |
| 4743 | 0 |
| 4744 | 0 |
| 4745 | 0 |
| 4746 | 0 |
| 4747 | 0 |
| 4748 | 0 |
| 4749 | 0 |
| 4750 | 0 |
| 4751 | 0 |
| 4752 | 0 |
| 4753 | 0 |
| 4754 | 0 |
| 4755 | 0 |
| 4756 | 0 |
| 4757 | 0 |
| 4758 | 0 |
| 4759 | 0 |
| 4760 | 0 |
| 4761 | 0 |
| 4762 | 0 |
| 4763 | 0 |
| 4764 | 0 |
| 4765 | 0 |
| 4766 | 0 |
| 4767 | 0 |
| 4768 | 0 |
| 4769 | 0 |
| 4770 | 0 |
| 4771 | 0 |
| 4772 | 0 |
| 4773 | 0 |
| 4774 | 0 |
| 4775 | 0 |
| 4776 | 0 |
| 4777 | 0 |
| 4778 | 0 |
| 4779 | 0 |
| 4780 | 0 |
| 4781 | 0 |
| 4782 | 0 |
| 4783 | 0 |
| 4784 | 0 |
| 4785 | 0 |
| 4786 | 0 |
| 4787 | 0 |
| 4788 | 0 |
| 4789 | 0 |
| 4790 | 0 |
| 4791 | 0 |
| 4792 | 0 |
| 4793 | 0 |
| 4794 | 0 |
| 4795 | 0 |
| 4796 | 0 |
| 4797 | 0 |
| 4798 | 0 |
| 4799 | 0 |
| 4800 | 0 |
| 4801 | 0 |
| 4802 | 0 |
| 4803 | 0 |
| 4804 | 0 |
| 4805 | 0 |
| 4806 | 0 |
| 4807 | 0 |
| 4808 | 0 |
| 4809 | 0 |
| 4810 | 0 |
| 4811 | 0 |
| 4812 | 0 |
| 4813 | 0 |
| 4814 | 0 |
| 4815 | 0 |
| 4816 | 0 |
| 4817 | 0 |
| 4818 | 0 |
| 4819 | 0 |
| 4820 | 0 |
| 4821 | 0 |
| 4822 | 0 |
| 4823 | 0 |
| 4824 | 0 |
| 4825 | 0 |
| 4826 | 0 |
| 4827 | 0 |
| 4828 | 0 |
| 4829 | 0 |
| 4830 | 0 |
| 4831 | 0 |
| 4832 | 0 |
| 4833 | 0 |
| 4834 | 0 |
| 4835 | 0 |
| 4836 | 0 |
| 4837 | 0 |
| 4838 | 0 |
| 4839 | 0 |
| 4840 | 0 |
| 4841 | 0 |
| 4842 | 0 |
| 4843 | 0 |
| 4844 | 0 |
| 4845 | 0 |
| 4846 | 0 |
| 4847 | 0 |
| 4848 | 0 |
| 4849 | 0 |
| 4850 | 0 |
| 4851 | 0 |
| 4852 | 0 |
| 4853 | 0 |
| 4854 | 0 |
| 4855 | 0 |
| 4856 | 0 |
| 4857 | 0 |
| 4858 | 0 |
| 4859 | 0 |
| 4860 | 0 |
| 4861 | 0 |
| 4862 | 0 |
| 4863 | 0 |
| 4864 | 0 |
| 4865 | 0 |
| 4866 | 0 |
| 4867 | 0 |
| 4868 | 0 |
| 4869 | 0 |
| 4870 | 0 |
| 4871 | 0 |
| 4872 | 0 |
| 4873 | 0 |
| 4874 | 0 |
| 4875 | 0 |
| 4876 | 0 |
| 4877 | 0 |
| 4878 | 0 |
| 4879 | 0 |
| 4880 | 0 |
| 4881 | 0 |
| 4882 | 0 |
| 4883 | 0 |
| 4884 | 0 |
| 4885 | 0 |
| 4886 | 0 |
| 4887 | 0 |
| 4888 | 0 |
| 4889 | 0 |
| 4890 | 0 |
| 4891 | 0 |
| 4892 | 0 |
| 4893 | 0 |
| 4894 | 0 |
| 4895 | 0 |
| 4896 | 0 |
| 4897 | 0 |
| 4898 | 0 |
| 4899 | 0 |
| 4900 | 0 |
| 4901 | 0 |
| 4902 | 0 |
| 4903 | 0 |
| 4904 | 0 |
| 4905 | 0 |
| 4906 | 0 |
| 4907 | 0 |
| 4908 | 0 |
| 4909 | 0 |
| 4910 | 0 |
| 4911 | 0 |
| 4912 | 0 |
| 4913 | 0 |
| 4914 | 0 |
| 4915 | 0 |
| 4916 | 0 |
| 4917 | 0 |
| 4918 | 0 |
| 4919 | 0 |
| 4920 | 0 |
| 4921 | 0 |
| 4922 | 0 |
| 4923 | 0 |
| 4924 | 0 |
| 4925 | 0 |
| 4926 | 0 |
| 4927 | 0 |
| 4928 | 0 |
| 4929 | 0 |
| 4930 | 0 |
| 4931 | 0 |
| 4932 | 0 |
| 4933 | 0 |
| 4934 | 0 |
| 4935 | 0 |
| 4936 | 0 |
| 4937 | 0 |
| 4938 | 0 |
| 4939 | 0 |
| 4940 | 0 |
| 4941 | 0 |
| 4942 | 0 |
| 4943 | 0 |
| 4944 | 0 |
| 4945 | 0 |
| 4946 | 0 |
| 4947 | 0 |
| 4948 | 0 |
| 4949 | 0 |
| 4950 | 0 |
| 4951 | 0 |
| 4952 | 0 |
| 4953 | 0 |
| 4954 | 0 |
| 4955 | 0 |
| 4956 | 0 |
| 4957 | 0 |
| 4958 | 0 |
| 4959 | 0 |
| 4960 | 0 |
| 4961 | 0 |
| 4962 | 0 |
| 4963 | 0 |
| 4964 | 0 |
| 4965 | 0 |
| 4966 | 0 |
| 4967 | 0 |
| 4968 | 0 |
| 4969 | 0 |
| 4970 | 0 |
| 4971 | 0 |
| 4972 | 0 |
| 4973 | 0 |
| 4974 | 0 |
| 4975 | 0 |
| 4976 | 0 |
| 4977 | 0 |
| 4978 | 0 |
| 4979 | 0 |
| 4980 | 0 |
| 4981 | 0 |
| 4982 | 0 |
| 4983 | 0 |
| 4984 | 0 |
| 4985 | 0 |
| 4986 | 0 |
| 4987 | 0 |
| 4988 | 0 |
| 4989 | 0 |
| 4990 | 0 |
| 4991 | 0 |
| 4992 | 0 |
| 4993 | 0 |
| 4994 | 0 |
| 4995 | 0 |
| 4996 | 0 |
| 4997 | 0 |
| 4998 | 0 |
| 4999 | 0 |
| 5000 | 0 |
| 5001 | 0 |
| 5002 | 0 |
| 5003 | 0 |
| 5004 | 0 |
| 5005 | 0 |
| 5006 | 0 |
| 5007 | 0 |
| 5008 | 0 |
| 5009 | 0 |
| 5010 | 0 |
| 5011 | 0 |
| 5012 | 0 |
| 5013 | 0 |
| 5014 | 0 |
| 5015 | 0 |
| 5016 | 0 |
| 5017 | 0 |
| 5018 | 0 |
| 5019 | 0 |
| 5020 | 0 |
| 5021 | 0 |
| 5022 | 0 |
| 5023 | 0 |
| 5024 | 0 |
| 5025 | 0 |
| 5026 | 0 |
| 5027 | 0 |
| 5028 | 0 |
| 5029 | 0 |
| 5030 | 0 |
| 5031 | 0 |
| 5032 | 0 |
| 5033 | 0 |
| 5034 | 0 |
| 5035 | 0 |
| 5036 | 0 |
| 5037 | 0 |
| 5038 | 0 |
| 5039 | 0 |
| 5040 | 0 |
| 5041 | 0 |
| 5042 | 0 |
| 5043 | 0 |
| 5044 | 0 |
| 5045 | 0 |
| 5046 | 0 |
| 5047 | 0 |
| 5048 | 0 |
| 5049 | 0 |
| 5050 | 0 |
| 5051 | 0 |
| 5052 | 0 |
| 5053 | 0 |
| 5054 | 0 |
| 5055 | 0 |
| 5056 | 0 |
| 5057 | 0 |
| 5058 | 0 |
| 5059 | 0 |
| 5060 | 0 |
| 5061 | 0 |
| 5062 | 0 |
| 5063 | 0 |
| 5064 | 0 |
| 5065 | 0 |
| 5066 | 0 |
| 5067 | 0 |
| 5068 | 0 |
| 5069 | 0 |
| 5070 | 0 |
| 5071 | 0 |
| 5072 | 0 |
| 5073 | 0 |
| 5074 | 0 |
| 5075 | 0 |
| 5076 | 0 |
| 5077 | 0 |
| 5078 | 0 |
| 5079 | 0 |
| 5080 | 0 |
| 5081 | 0 |
| 5082 | 0 |
| 5083 | 0 |
| 5084 | 0 |
| 5085 | 0 |
| 5086 | 0 |
| 5087 | 0 |
| 5088 | 0 |
| 5089 | 0 |
| 5090 | 0 |
| 5091 | 0 |
| 5092 | 0 |
| 5093 | 0 |
| 5094 | 0 |
| 5095 | 0 |
| 5096 | 0 |
| 5097 | 0 |
| 5098 | 0 |
| 5099 | 0 |
| 5100 | 0 |
| 5101 | 0 |
| 5102 | 0 |
| 5103 | 0 |
| 5104 | 0 |
| 5105 | 0 |
| 5106 | 0 |
| 5107 | 0 |
| 5108 | 0 |
| 5109 | 0 |
| 5110 | 0 |
| 5111 | 0 |
| 5112 | 0 |
| 5113 | 0 |
| 5114 | 0 |
| 5115 | 0 |
| 5116 | 0 |
| 5117 | 0 |
| 5118 | 0 |
| 5119 | 0 |
| 5120 | 0 |
| 5121 | 0 |
| 5122 | 0 |
| 5123 | 0 |
| 5124 | 0 |
| 5125 | 0 |
| 5126 | 0 |
| 5127 | 0 |
| 5128 | 0 |
| 5129 | 0 |
| 5130 | 0 |
| 5131 | 0 |
| 5132 | 0 |
| 5133 | 0 |
| 5134 | 0 |
| 5135 | 0 |
| 5136 | 0 |
| 5137 | 0 |
| 5138 | 0 |
| 5139 | 0 |
| 5140 | 0 |
| 5141 | 0 |
| 5142 | 0 |
| 5143 | 0 |
| 5144 | 0 |
| 5145 | 0 |
| 5146 | 0 |
| 5147 | 0 |
| 5148 | 0 |
| 5149 | 0 |
| 5150 | 0 |
| 5151 | 0 |
| 5152 | 0 |
| 5153 | 0 |
| 5154 | 0 |
| 5155 | 0 |
| 5156 | 0 |
| 5157 | 0 |
| 5158 | 0 |
| 5159 | 0 |
| 5160 | 0 |
| 5161 | 0 |
| 5162 | 0 |
| 5163 | 0 |
| 5164 | 0 |
| 5165 | 0 |
| 5166 | 0 |
| 5167 | 0 |
| 5168 | 0 |
| 5169 | 0 |
| 5170 | 0 |
| 5171 | 0 |
| 5172 | 0 |
| 5173 | 0 |
| 5174 | 0 |
| 5175 | 0 |
| 5176 | 0 |
| 5177 | 0 |
| 5178 | 0 |
| 5179 | 0 |
| 5180 | 0 |
| 5181 | 0 |
| 5182 | 0 |
| 5183 | 0 |
| 5184 | 0 |
| 5185 | 0 |
| 5186 | 0 |
| 5187 | 0 |
| 5188 | 0 |
| 5189 | 0 |
| 5190 | 0 |
| 5191 | 0 |
| 5192 | 0 |
| 5193 | 0 |
| 5194 | 0 |
| 5195 | 0 |
| 5196 | 0 |
| 5197 | 0 |
| 5198 | 0 |
| 5199 | 0 |
| 5200 | 0 |
| 5201 | 0 |
| 5202 | 0 |
| 5203 | 0 |
| 5204 | 0 |
| 5205 | 0 |
| 5206 | 0 |
| 5207 | 0 |
| 5208 | 0 |
| 5209 | 0 |
| 5210 | 0 |
| 5211 | 0 |
| 5212 | 0 |
| 5213 | 0 |
| 5214 | 0 |
| 5215 | 0 |
| 5216 | 0 |
| 5217 | 0 |
| 5218 | 0 |
| 5219 | 0 |
| 5220 | 0 |
| 5221 | 0 |
| 5222 | 0 |
| 5223 | 0 |
| 5224 | 0 |
| 5225 | 0 |
| 5226 | 0 |
| 5227 | 0 |
| 5228 | 0 |
| 5229 | 0 |
| 5230 | 0 |
| 5231 | 0 |
| 5232 | 0 |
| 5233 | 0 |
| 5234 | 0 |
| 5235 | 0 |
| 5236 | 0 |
| 5237 | 0 |
| 5238 | 0 |
| 5239 | 0 |
| 5240 | 0 |
| 5241 | 0 |
| 5242 | 0 |
| 5243 | 0 |
| 5244 | 0 |
| 5245 | 0 |
| 5246 | 0 |
| 5247 | 0 |
| 5248 | 0 |
| 5249 | 0 |
| 5250 | 0 |
| 5251 | 0 |
| 5252 | 0 |
| 5253 | 0 |
| 5254 | 0 |
| 5255 | 0 |
| 5256 | 0 |
| 5257 | 0 |
| 5258 | 0 |
| 5259 | 0 |
| 5260 | 0 |
| 5261 | 0 |
| 5262 | 0 |
| 5263 | 0 |
| 5264 | 0 |
| 5265 | 0 |
| 5266 | 0 |
| 5267 | 0 |
| 5268 | 0 |
| 5269 | 0 |
| 5270 | 0 |
| 5271 | 0 |
| 5272 | 0 |
| 5273 | 0 |
| 5274 | 0 |
| 5275 | 0 |
| 5276 | 0 |
| 5277 | 0 |
| 5278 | 0 |
| 5279 | 0 |
| 5280 | 0 |
| 5281 | 0 |
| 5282 | 0 |
| 5283 | 0 |
| 5284 | 0 |
| 5285 | 0 |
| 5286 | 0 |
| 5287 | 0 |
| 5288 | 0 |
| 5289 | 0 |
| 5290 | 0 |
| 5291 | 0 |
| 5292 | 0 |
| 5293 | 0 |
| 5294 | 0 |
| 5295 | 0 |
| 5296 | 0 |
| 5297 | 0 |
| 5298 | 0 |
| 5299 | 0 |
| 5300 | 0 |
| 5301 | 0 |
| 5302 | 0 |
| 5303 | 0 |
| 5304 | 0 |
| 5305 | 0 |
| 5306 | 0 |
| 5307 | 0 |
| 5308 | 0 |
| 5309 | 0 |
| 5310 | 0 |
| 5311 | 0 |
| 5312 | 0 |
| 5313 | 0 |
| 5314 | 0 |
| 5315 | 0 |
| 5316 | 0 |
| 5317 | 0 |
| 5318 | 0 |
| 5319 | 0 |
| 5320 | 0 |
| 5321 | 0 |
| 5322 | 0 |
| 5323 | 0 |
| 5324 | 0 |
| 5325 | 0 |
| 5326 | 0 |
| 5327 | 0 |
| 5328 | 0 |
| 5329 | 0 |
| 5330 | 0 |
| 5331 | 0 |
| 5332 | 0 |
| 5333 | 0 |
| 5334 | 0 |
| 5335 | 0 |
| 5336 | 0 |
| 5337 | 0 |
| 5338 | 0 |
| 5339 | 0 |
| 5340 | 0 |
| 5341 | 0 |
| 5342 | 0 |
| 5343 | 0 |
| 5344 | 0 |
| 5345 | 0 |
| 5346 | 0 |
| 5347 | 0 |
| 5348 | 0 |
| 5349 | 0 |
| 5350 | 0 |
| 5351 | 0 |
| 5352 | 0 |
| 5353 | 0 |
| 5354 | 0 |
| 5355 | 0 |
| 5356 | 0 |
| 5357 | 0 |
| 5358 | 0 |
| 5359 | 0 |
| 5360 | 0 |
| 5361 | 0 |
| 5362 | 0 |
| 5363 | 0 |
| 5364 | 0 |
| 5365 | 0 |
| 5366 | 0 |
| 5367 | 0 |
| 5368 | 0 |
| 5369 | 0 |
| 5370 | 0 |
| 5371 | 0 |
| 5372 | 0 |
| 5373 | 0 |
| 5374 | 0 |
| 5375 | 0 |
| 5376 | 0 |
| 5377 | 0 |
| 5378 | 0 |
| 5379 | 0 |
| 5380 | 0 |
| 5381 | 0 |
| 5382 | 0 |
| 5383 | 0 |
| 5384 | 0 |
| 5385 | 0 |
| 5386 | 0 |
| 5387 | 0 |
| 5388 | 0 |
| 5389 | 0 |
| 5390 | 0 |
| 5391 | 0 |
| 5392 | 0 |
| 5393 | 0 |
| 5394 | 0 |
| 5395 | 0 |
| 5396 | 0 |
| 5397 | 0 |
| 5398 | 0 |
| 5399 | 0 |
| 5400 | 0 |
| 5401 | 0 |
| 5402 | 0 |
| 5403 | 0 |
| 5404 | 0 |
| 5405 | 0 |
| 5406 | 0 |
| 5407 | 0 |
| 5408 | 0 |
| 5409 | 0 |
| 5410 | 0 |
| 5411 | 0 |
| 5412 | 0 |
| 5413 | 0 |
| 5414 | 0 |
| 5415 | 0 |
| 5416 | 0 |
| 5417 | 0 |
| 5418 | 0 |
| 5419 | 0 |
| 5420 | 0 |
| 5421 | 0 |
| 5422 | 0 |
| 5423 | 0 |
| 5424 | 0 |
| 5425 | 0 |
| 5426 | 0 |
| 5427 | 0 |
| 5428 | 0 |
| 5429 | 0 |
| 5430 | 0 |
| 5431 | 0 |
| 5432 | 0 |
| 5433 | 0 |
| 5434 | 0 |
| 5435 | 0 |
| 5436 | 0 |
| 5437 | 0 |
| 5438 | 0 |
| 5439 | 0 |
| 5440 | 0 |
| 5441 | 0 |
| 5442 | 0 |
| 5443 | 0 |
| 5444 | 0 |
| 5445 | 0 |
| 5446 | 0 |
| 5447 | 0 |
| 5448 | 0 |
| 5449 | 0 |
| 5450 | 0 |
| 5451 | 0 |
| 5452 | 0 |
| 5453 | 0 |
| 5454 | 0 |
| 5455 | 0 |
| 5456 | 0 |
| 5457 | 0 |
| 5458 | 0 |
| 5459 | 0 |
| 5460 | 0 |
| 5461 | 0 |
| 5462 | 0 |
| 5463 | 0 |
| 5464 | 0 |
| 5465 | 0 |
| 5466 | 0 |
| 5467 | 0 |
| 5468 | 0 |
| 5469 | 0 |
| 5470 | 0 |
| 5471 | 0 |
| 5472 | 0 |
| 5473 | 0 |
| 5474 | 0 |
| 5475 | 0 |
| 5476 | 0 |
| 5477 | 0 |
| 5478 | 0 |
| 5479 | 0 |
| 5480 | 0 |
| 5481 | 0 |
| 5482 | 0 |
| 5483 | 0 |
| 5484 | 0 |
| 5485 | 0 |
| 5486 | 0 |
| 5487 | 0 |
| 5488 | 0 |
| 5489 | 0 |
| 5490 | 0 |
| 5491 | 0 |
| 5492 | 0 |
| 5493 | 0 |
| 5494 | 0 |
| 5495 | 0 |
| 5496 | 0 |
| 5497 | 0 |
| 5498 | 0 |
| 5499 | 0 |
| 5500 | 0 |
| 5501 | 0 |
| 5502 | 0 |
| 5503 | 0 |
| 5504 | 0 |
| 5505 | 0 |
| 5506 | 0 |
| 5507 | 0 |
| 5508 | 0 |
| 5509 | 0 |
| 5510 | 0 |
| 5511 | 0 |
| 5512 | 0 |
| 5513 | 0 |
| 5514 | 0 |
| 5515 | 0 |
| 5516 | 0 |
| 5517 | 0 |
| 5518 | 0 |
| 5519 | 0 |
| 5520 | 0 |
| 5521 | 0 |
| 5522 | 0 |
| 5523 | 0 |
| 5524 | 0 |
| 5525 | 0 |
| 5526 | 0 |
| 5527 | 0 |
| 5528 | 0 |
| 5529 | 0 |
| 5530 | 0 |
| 5531 | 0 |
| 5532 | 0 |
| 5533 | 0 |
| 5534 | 0 |
| 5535 | 0 |
| 5536 | 0 |
| 5537 | 0 |
| 5538 | 0 |
| 5539 | 0 |
| 5540 | 0 |
| 5541 | 0 |
| 5542 | 0 |
| 5543 | 0 |
| 5544 | 0 |
| 5545 | 0 |
| 5546 | 0 |
| 5547 | 0 |
| 5548 | 0 |
| 5549 | 0 |
| 5550 | 0 |
| 5551 | 0 |
| 5552 | 0 |
| 5553 | 0 |
| 5554 | 0 |
| 5555 | 0 |
| 5556 | 0 |
| 5557 | 0 |
| 5558 | 0 |
| 5559 | 0 |
| 5560 | 0 |
| 5561 | 0 |
| 5562 | 0 |
| 5563 | 0 |
| 5564 | 0 |
| 5565 | 0 |
| 5566 | 0 |
| 5567 | 0 |
| 5568 | 0 |
| 5569 | 0 |
| 5570 | 0 |
| 5571 | 0 |
| 5572 | 0 |
| 5573 | 0 |
| 5574 | 0 |
| 5575 | 0 |
| 5576 | 0 |
| 5577 | 0 |
| 5578 | 0 |
| 5579 | 0 |
| 5580 | 0 |
| 5581 | 0 |
| 5582 | 0 |
| 5583 | 0 |
| 5584 | 0 |
| 5585 | 0 |
| 5586 | 0 |
| 5587 | 0 |
| 5588 | 0 |
| 5589 | 0 |
| 5590 | 0 |
| 5591 | 0 |
| 5592 | 0 |
| 5593 | 0 |
| 5594 | 0 |
| 5595 | 0 |
| 5596 | 0 |
| 5597 | 0 |
| 5598 | 0 |
| 5599 | 0 |
| 5600 | 0 |
| 5601 | 0 |
| 5602 | 0 |
| 5603 | 0 |
| 5604 | 0 |
| 5605 | 0 |
| 5606 | 0 |
| 5607 | 0 |
| 5608 | 0 |
| 5609 | 0 |
| 5610 | 0 |
| 5611 | 0 |
| 5612 | 0 |
| 5613 | 0 |
| 5614 | 0 |
| 5615 | 0 |
| 5616 | 0 |
| 5617 | 0 |
| 5618 | 0 |
| 5619 | 0 |
| 5620 | 0 |
| 5621 | 0 |
| 5622 | 0 |
| 5623 | 0 |
| 5624 | 0 |
| 5625 | 0 |
| 5626 | 0 |
| 5627 | 0 |
| 5628 | 0 |
| 5629 | 0 |
| 5630 | 0 |
| 5631 | 0 |
| 5632 | 0 |
| 5633 | 0 |
| 5634 | 0 |
| 5635 | 0 |
| 5636 | 0 |
| 5637 | 0 |
| 5638 | 0 |
| 5639 | 0 |
| 5640 | 0 |
| 5641 | 0 |
| 5642 | 0 |
| 5643 | 0 |
| 5644 | 0 |
| 5645 | 0 |
| 5646 | 0 |
| 5647 | 0 |
| 5648 | 0 |
| 5649 | 0 |
| 5650 | 0 |
| 5651 | 0 |
| 5652 | 0 |
| 5653 | 0 |
| 5654 | 0 |
| 5655 | 0 |
| 5656 | 0 |
| 5657 | 0 |
| 5658 | 0 |
| 5659 | 0 |
| 5660 | 0 |
| 5661 | 0 |
| 5662 | 0 |
| 5663 | 0 |
| 5664 | 0 |
| 5665 | 0 |
| 5666 | 0 |
| 5667 | 0 |
| 5668 | 0 |
| 5669 | 0 |
| 5670 | 0 |
| 5671 | 0 |
| 5672 | 0 |
| 5673 | 0 |
| 5674 | 0 |
| 5675 | 0 |
| 5676 | 0 |
| 5677 | 0 |
| 5678 | 0 |
| 5679 | 0 |
| 5680 | 0 |
| 5681 | 0 |
| 5682 | 0 |
| 5683 | 0 |
| 5684 | 0 |
| 5685 | 0 |
| 5686 | 0 |
| 5687 | 0 |
| 5688 | 0 |
| 5689 | 0 |
| 5690 | 0 |
| 5691 | 0 |
| 5692 | 0 |
| 5693 | 0 |
| 5694 | 0 |
| 5695 | 0 |
| 5696 | 0 |
| 5697 | 0 |
| 5698 | 0 |
| 5699 | 0 |
| 5700 | 0 |
| 5701 | 0 |
| 5702 | 0 |
| 5703 | 0 |
| 5704 | 0 |
| 5705 | 0 |
| 5706 | 0 |
| 5707 | 0 |
| 5708 | 0 |
| 5709 | 0 |
| 5710 | 0 |
| 5711 | 0 |
| 5712 | 0 |
| 5713 | 0 |
| 5714 | 0 |
| 5715 | 0 |
| 5716 | 0 |
| 5717 | 0 |
| 5718 | 0 |
| 5719 | 0 |
| 5720 | 0 |
| 5721 | 0 |
| 5722 | 0 |
| 5723 | 0 |
| 5724 | 0 |
| 5725 | 0 |
| 5726 | 0 |
| 5727 | 0 |
| 5728 | 0 |
| 5729 | 0 |
| 5730 | 0 |
| 5731 | 0 |
| 5732 | 0 |
| 5733 | 0 |
| 5734 | 0 |
| 5735 | 0 |
| 5736 | 0 |
| 5737 | 0 |
| 5738 | 0 |
| 5739 | 0 |
| 5740 | 0 |
| 5741 | 0 |
| 5742 | 0 |
| 5743 | 0 |
| 5744 | 0 |
| 5745 | 0 |
| 5746 | 0 |
| 5747 | 0 |
| 5748 | 0 |
| 5749 | 0 |
| 5750 | 0 |
| 5751 | 0 |
| 5752 | 0 |
| 5753 | 0 |
| 5754 | 0 |
| 5755 | 0 |
| 5756 | 0 |
| 5757 | 0 |
| 5758 | 0 |
| 5759 | 0 |
| 5760 | 0 |
| 5761 | 0 |
| 5762 | 0 |
| 5763 | 0 |
| 5764 | 0 |
| 5765 | 0 |
| 5766 | 0 |
| 5767 | 0 |
| 5768 | 0 |
| 5769 | 0 |
| 5770 | 0 |
| 5771 | 0 |
| 5772 | 0 |
| 5773 | 0 |
| 5774 | 0 |
| 5775 | 0 |
| 5776 | 0 |
| 5777 | 0 |
| 5778 | 0 |
| 5779 | 0 |
| 5780 | 0 |
| 5781 | 0 |
| 5782 | 0 |
| 5783 | 0 |
| 5784 | 0 |
| 5785 | 0 |
| 5786 | 0 |
| 5787 | 0 |
| 5788 | 0 |
| 5789 | 0 |
| 5790 | 0 |
| 5791 | 0 |
| 5792 | 0 |
| 5793 | 0 |
| 5794 | 0 |
| 5795 | 0 |
| 5796 | 0 |
| 5797 | 0 |
| 5798 | 0 |
| 5799 | 0 |
| 5800 | 0 |
| 5801 | 0 |
| 5802 | 0 |
| 5803 | 0 |
| 5804 | 0 |
| 5805 | 0 |
| 5806 | 0 |
| 5807 | 0 |
| 5808 | 0 |
| 5809 | 0 |
| 5810 | 0 |
| 5811 | 0 |
| 5812 | 0 |
| 5813 | 0 |
| 5814 | 0 |
| 5815 | 0 |
| 5816 | 0 |
| 5817 | 0 |
| 5818 | 0 |
| 5819 | 0 |
| 5820 | 0 |
| 5821 | 0 |
| 5822 | 0 |
| 5823 | 0 |
| 5824 | 0 |
| 5825 | 0 |
| 5826 | 0 |
| 5827 | 0 |
| 5828 | 0 |
| 5829 | 0 |
| 5830 | 0 |
| 5831 | 0 |
| 5832 | 0 |
| 5833 | 0 |
| 5834 | 0 |
| 5835 | 0 |
| 5836 | 0 |
| 5837 | 0 |
| 5838 | 0 |
| 5839 | 0 |
| 5840 | 0 |
| 5841 | 0 |
| 5842 | 0 |
| 5843 | 0 |
| 5844 | 0 |
| 5845 | 0 |
| 5846 | 0 |
| 5847 | 0 |
| 5848 | 0 |
| 5849 | 0 |
| 5850 | 0 |
| 5851 | 0 |
| 5852 | 0 |
| 5853 | 0 |
| 5854 | 0 |
| 5855 | 0 |
| 5856 | 0 |
| 5857 | 0 |
| 5858 | 0 |
| 5859 | 0 |
| 5860 | 0 |
| 5861 | 0 |
| 5862 | 0 |
| 5863 | 0 |
| 5864 | 0 |
| 5865 | 0 |
| 5866 | 0 |
| 5867 | 0 |
| 5868 | 0 |
| 5869 | 0 |
| 5870 | 0 |
| 5871 | 0 |
| 5872 | 0 |
| 5873 | 0 |
| 5874 | 0 |
| 5875 | 0 |
| 5876 | 0 |
| 5877 | 0 |
| 5878 | 0 |
| 5879 | 0 |
| 5880 | 0 |
| 5881 | 0 |
| 5882 | 0 |
| 5883 | 0 |
| 5884 | 0 |
| 5885 | 0 |
| 5886 | 0 |
| 5887 | 0 |
| 5888 | 0 |
| 5889 | 0 |
| 5890 | 0 |
| 5891 | 0 |
| 5892 | 0 |
| 5893 | 0 |
| 5894 | 0 |
| 5895 | 0 |
| 5896 | 0 |
| 5897 | 0 |
| 5898 | 0 |
| 5899 | 0 |
| 5900 | 0 |
| 5901 | 0 |
| 5902 | 0 |
| 5903 | 0 |
| 5904 | 0 |
| 5905 | 0 |
| 5906 | 0 |
| 5907 | 0 |
| 5908 | 0 |
| 5909 | 0 |
| 5910 | 0 |
| 5911 | 0 |
| 5912 | 0 |
| 5913 | 0 |
| 5914 | 0 |
| 5915 | 0 |
| 5916 | 0 |
| 5917 | 0 |
| 5918 | 0 |
| 5919 | 0 |
| 5920 | 0 |
| 5921 | 0 |
| 5922 | 0 |
| 5923 | 0 |
| 5924 | 0 |
| 5925 | 0 |
| 5926 | 0 |
| 5927 | 0 |
| 5928 | 0 |
| 5929 | 0 |
| 5930 | 0 |
| 5931 | 0 |
| 5932 | 0 |
| 5933 | 0 |
| 5934 | 0 |
| 5935 | 0 |
| 5936 | 0 |
| 5937 | 0 |
| 5938 | 0 |
| 5939 | 0 |
| 5940 | 0 |
| 5941 | 0 |
| 5942 | 0 |
| 5943 | 0 |
| 5944 | 0 |
| 5945 | 0 |
| 5946 | 0 |
| 5947 | 0 |
| 5948 | 0 |
| 5949 | 0 |
| 5950 | 0 |
| 5951 | 0 |
| 5952 | 0 |
| 5953 | 0 |
| 5954 | 0 |
| 5955 | 0 |
| 5956 | 0 |
| 5957 | 0 |
| 5958 | 0 |
| 5959 | 0 |
| 5960 | 0 |
| 5961 | 0 |
| 5962 | 0 |
| 5963 | 0 |
| 5964 | 0 |
| 5965 | 0 |
| 5966 | 0 |
| 5967 | 0 |
| 5968 | 0 |
| 5969 | 0 |
| 5970 | 0 |
| 5971 | 0 |
| 5972 | 0 |
| 5973 | 0 |
| 5974 | 0 |
| 5975 | 0 |
| 5976 | 0 |
| 5977 | 0 |
| 5978 | 0 |
| 5979 | 0 |
| 5980 | 0 |
| 5981 | 0 |
| 5982 | 0 |
| 5983 | 0 |
| 5984 | 0 |
| 5985 | 0 |
| 5986 | 0 |
| 5987 | 0 |
| 5988 | 0 |
| 5989 | 0 |
| 5990 | 0 |
| 5991 | 0 |
| 5992 | 0 |
| 5993 | 0 |
| 5994 | 0 |
| 5995 | 0 |
| 5996 | 0 |
| 5997 | 0 |
| 5998 | 0 |
| 5999 | 0 |
| 6000 | 0 |
| 6001 | 0 |
| 6002 | 0 |
| 6003 | 0 |
| 6004 | 0 |
| 6005 | 0 |
| 6006 | 0 |
| 6007 | 0 |
| 6008 | 0 |
| 6009 | 0 |
| 6010 | 0 |
| 6011 | 0 |
| 6012 | 0 |
| 6013 | 0 |
| 6014 | 0 |
| 6015 | 0 |
| 6016 | 0 |
| 6017 | 0 |
| 6018 | 0 |
| 6019 | 0 |
| 6020 | 0 |
| 6021 | 0 |
| 6022 | 0 |
| 6023 | 0 |
| 6024 | 0 |
| 6025 | 0 |
| 6026 | 0 |
| 6027 | 0 |
| 6028 | 0 |
| 6029 | 0 |
| 6030 | 0 |
| 6031 | 0 |
| 6032 | 0 |
| 6033 | 0 |
| 6034 | 0 |
| 6035 | 0 |
| 6036 | 0 |
| 6037 | 0 |
| 6038 | 0 |
| 6039 | 0 |
| 6040 | 0 |
| 6041 | 0 |
| 6042 | 0 |
| 6043 | 0 |
| 6044 | 0 |
| 6045 | 0 |
| 6046 | 0 |
| 6047 | 0 |
| 6048 | 0 |
| 6049 | 0 |
| 6050 | 0 |
| 6051 | 0 |
| 6052 | 0 |
| 6053 | 0 |
| 6054 | 0 |
| 6055 | 0 |
| 6056 | 0 |
| 6057 | 0 |
| 6058 | 0 |
| 6059 | 0 |
| 6060 | 0 |
| 6061 | 0 |
| 6062 | 0 |
| 6063 | 0 |
| 6064 | 0 |
| 6065 | 0 |
| 6066 | 0 |
| 6067 | 0 |
| 6068 | 0 |
| 6069 | 0 |
| 6070 | 0 |
| 6071 | 0 |
| 6072 | 0 |
| 6073 | 0 |
| 6074 | 0 |
| 6075 | 0 |
| 6076 | 0 |
| 6077 | 0 |
| 6078 | 0 |
| 6079 | 0 |
| 6080 | 0 |
| 6081 | 0 |
| 6082 | 0 |
| 6083 | 0 |
| 6084 | 0 |
| 6085 | 0 |
| 6086 | 0 |
| 6087 | 0 |
| 6088 | 0 |
| 6089 | 0 |
| 6090 | 0 |
| 6091 | 0 |
| 6092 | 0 |
| 6093 | 0 |
| 6094 | 0 |
| 6095 | 0 |
| 6096 | 0 |
| 6097 | 0 |
| 6098 | 0 |
| 6099 | 0 |
| 6100 | 0 |
| 6101 | 0 |
| 6102 | 0 |
| 6103 | 0 |
| 6104 | 0 |
| 6105 | 0 |
| 6106 | 0 |
| 6107 | 0 |
| 6108 | 0 |
| 6109 | 0 |
| 6110 | 0 |
| 6111 | 0 |
| 6112 | 0 |
| 6113 | 0 |
| 6114 | 0 |
| 6115 | 0 |
| 6116 | 0 |
| 6117 | 0 |
| 6118 | 0 |
| 6119 | 0 |
| 6120 | 0 |
| 6121 | 0 |
| 6122 | 0 |
| 6123 | 0 |
| 6124 | 0 |
| 6125 | 0 |
| 6126 | 0 |
| 6127 | 0 |
| 6128 | 0 |
| 6129 | 0 |
| 6130 | 0 |
| 6131 | 0 |
| 6132 | 0 |
| 6133 | 0 |
| 6134 | 0 |
| 6135 | 0 |
| 6136 | 0 |
| 6137 | 0 |
| 6138 | 0 |
| 6139 | 0 |
| 6140 | 0 |
| 6141 | 0 |
| 6142 | 0 |
| 6143 | 0 |
| 6144 | 0 |
| 6145 | 0 |
| 6146 | 0 |
| 6147 | 0 |
| 6148 | 0 |
| 6149 | 0 |
| 6150 | 0 |
| 6151 | 0 |
| 6152 | 0 |
| 6153 | 0 |
| 6154 | 0 |
| 6155 | 0 |
| 6156 | 0 |
| 6157 | 0 |
| 6158 | 0 |
| 6159 | 0 |
| 6160 | 0 |
| 6161 | 0 |
| 6162 | 0 |
| 6163 | 0 |
| 6164 | 0 |
| 6165 | 0 |
| 6166 | 0 |
| 6167 | 0 |
| 6168 | 0 |
| 6169 | 0 |
| 6170 | 0 |
| 6171 | 0 |
| 6172 | 0 |
| 6173 | 0 |
| 6174 | 0 |
| 6175 | 0 |
| 6176 | 0 |
| 6177 | 0 |
| 6178 | 0 |
| 6179 | 0 |
| 6180 | 0 |
| 6181 | 0 |
| 6182 | 0 |
| 6183 | 0 |
| 6184 | 0 |
| 6185 | 0 |
| 6186 | 0 |
| 6187 | 0 |
| 6188 | 0 |
| 6189 | 0 |
| 6190 | 0 |
| 6191 | 0 |
| 6192 | 0 |
| 6193 | 0 |
| 6194 | 0 |
| 6195 | 0 |
| 6196 | 0 |
| 6197 | 0 |
| 6198 | 0 |
| 6199 | 0 |
| 6200 | 0 |
| 6201 | 0 |
| 6202 | 0 |
| 6203 | 0 |
| 6204 | 0 |
| 6205 | 0 |
| 6206 | 0 |
| 6207 | 0 |
| 6208 | 0 |
| 6209 | 0 |
| 6210 | 0 |
| 6211 | 0 |
| 6212 | 0 |
| 6213 | 0 |
| 6214 | 0 |
| 6215 | 0 |
| 6216 | 0 |
| 6217 | 0 |
| 6218 | 0 |
| 6219 | 0 |
| 6220 | 0 |
| 6221 | 0 |
| 6222 | 0 |
| 6223 | 0 |
| 6224 | 0 |
| 6225 | 0 |
| 6226 | 0 |
| 6227 | 0 |
| 6228 | 0 |
| 6229 | 0 |
| 6230 | 0 |
| 6231 | 0 |
| 6232 | 0 |
| 6233 | 0 |
| 6234 | 0 |
| 6235 | 0 |
| 6236 | 0 |
| 6237 | 0 |
| 6238 | 0 |
| 6239 | 0 |
| 6240 | 0 |
| 6241 | 0 |
| 6242 | 0 |
| 6243 | 0 |
| 6244 | 0 |
| 6245 | 0 |
| 6246 | 0 |
| 6247 | 0 |
| 6248 | 0 |
| 6249 | 0 |
| 6250 | 0 |
| 6251 | 0 |
| 6252 | 0 |
| 6253 | 0 |
| 6254 | 0 |
| 6255 | 0 |
| 6256 | 0 |
| 6257 | 0 |
| 6258 | 0 |
| 6259 | 0 |
| 6260 | 0 |
| 6261 | 0 |
| 6262 | 0 |
| 6263 | 0 |
| 6264 | 0 |
| 6265 | 0 |
| 6266 | 0 |
| 6267 | 0 |
| 6268 | 0 |
| 6269 | 0 |
| 6270 | 0 |
| 6271 | 0 |
| 6272 | 0 |
| 6273 | 0 |
| 6274 | 0 |
| 6275 | 0 |
| 6276 | 0 |
| 6277 | 0 |
| 6278 | 0 |
| 6279 | 0 |
| 6280 | 0 |
| 6281 | 0 |
| 6282 | 0 |
| 6283 | 0 |
| 6284 | 0 |
| 6285 | 0 |
| 6286 | 0 |
| 6287 | 0 |
| 6288 | 0 |
| 6289 | 0 |
| 6290 | 0 |
| 6291 | 0 |
| 6292 | 0 |
| 6293 | 0 |
| 6294 | 0 |
| 6295 | 0 |
| 6296 | 0 |
| 6297 | 0 |
| 6298 | 0 |
| 6299 | 0 |
| 6300 | 0 |
| 6301 | 0 |
| 6302 | 0 |
| 6303 | 0 |
| 6304 | 0 |
| 6305 | 0 |
| 6306 | 0 |
| 6307 | 0 |
| 6308 | 0 |
| 6309 | 0 |
| 6310 | 0 |
| 6311 | 0 |
| 6312 | 0 |
| 6313 | 0 |
| 6314 | 0 |
| 6315 | 0 |
| 6316 | 0 |
| 6317 | 0 |
| 6318 | 0 |
| 6319 | 0 |
| 6320 | 0 |
| 6321 | 0 |
| 6322 | 0 |
| 6323 | 0 |
| 6324 | 0 |
| 6325 | 0 |
| 6326 | 0 |
| 6327 | 0 |
| 6328 | 0 |
| 6329 | 0 |
| 6330 | 0 |
| 6331 | 0 |
| 6332 | 0 |
| 6333 | 0 |
| 6334 | 0 |
| 6335 | 0 |
| 6336 | 0 |
| 6337 | 0 |
| 6338 | 0 |
| 6339 | 0 |
| 6340 | 0 |
| 6341 | 0 |
| 6342 | 0 |
| 6343 | 0 |
| 6344 | 0 |
| 6345 | 0 |
| 6346 | 0 |
| 6347 | 0 |
| 6348 | 0 |
| 6349 | 0 |
| 6350 | 0 |
| 6351 | 0 |
| 6352 | 0 |
| 6353 | 0 |
| 6354 | 0 |
| 6355 | 0 |
| 6356 | 0 |
| 6357 | 0 |
| 6358 | 0 |
| 6359 | 0 |
| 6360 | 0 |
| 6361 | 0 |
| 6362 | 0 |
| 6363 | 0 |
| 6364 | 0 |
| 6365 | 0 |
| 6366 | 0 |
| 6367 | 0 |
| 6368 | 0 |
| 6369 | 0 |
| 6370 | 0 |
| 6371 | 0 |
| 6372 | 0 |
| 6373 | 0 |
| 6374 | 0 |
| 6375 | 0 |
| 6376 | 0 |
| 6377 | 0 |
| 6378 | 0 |
| 6379 | 0 |
| 6380 | 0 |
| 6381 | 0 |
| 6382 | 0 |
| 6383 | 0 |
| 6384 | 0 |
| 6385 | 0 |
| 6386 | 0 |
| 6387 | 0 |
| 6388 | 0 |
| 6389 | 0 |
| 6390 | 0 |
| 6391 | 0 |
| 6392 | 0 |
| 6393 | 0 |
| 6394 | 0 |
| 6395 | 0 |
| 6396 | 0 |
| 6397 | 0 |
| 6398 | 0 |
| 6399 | 0 |
| 6400 | 0 |
| 6401 | 0 |
| 6402 | 0 |
| 6403 | 0 |
| 6404 | 0 |
| 6405 | 0 |
| 6406 | 0 |
| 6407 | 0 |
| 6408 | 0 |
| 6409 | 0 |
| 6410 | 0 |
| 6411 | 0 |
| 6412 | 0 |
| 6413 | 0 |
| 6414 | 0 |
| 6415 | 0 |
| 6416 | 0 |
| 6417 | 0 |
| 6418 | 0 |
| 6419 | 0 |
| 6420 | 0 |
| 6421 | 0 |
| 6422 | 0 |
| 6423 | 0 |
| 6424 | 0 |
| 6425 | 0 |
| 6426 | 0 |
| 6427 | 0 |
| 6428 | 0 |
| 6429 | 0 |
| 6430 | 0 |
| 6431 | 0 |
| 6432 | 0 |
| 6433 | 0 |
| 6434 | 0 |
| 6435 | 0 |
| 6436 | 0 |
| 6437 | 0 |
| 6438 | 0 |
| 6439 | 0 |
| 6440 | 0 |
| 6441 | 0 |
| 6442 | 0 |
| 6443 | 0 |
| 6444 | 0 |
| 6445 | 0 |
| 6446 | 0 |
| 6447 | 0 |
| 6448 | 0 |
| 6449 | 0 |
| 6450 | 0 |
| 6451 | 0 |
| 6452 | 0 |
| 6453 | 0 |
| 6454 | 0 |
| 6455 | 0 |
| 6456 | 0 |
| 6457 | 0 |
| 6458 | 0 |
| 6459 | 0 |
| 6460 | 0 |
| 6461 | 0 |
| 6462 | 0 |
| 6463 | 0 |
| 6464 | 0 |
| 6465 | 0 |
| 6466 | 0 |
| 6467 | 0 |
| 6468 | 0 |
| 6469 | 0 |
| 6470 | 0 |
| 6471 | 0 |
| 6472 | 0 |
| 6473 | 0 |
| 6474 | 0 |
| 6475 | 0 |
| 6476 | 0 |
| 6477 | 0 |
| 6478 | 0 |
| 6479 | 0 |
| 6480 | 0 |
| 6481 | 0 |
| 6482 | 0 |
| 6483 | 0 |
| 6484 | 0 |
| 6485 | 0 |
| 6486 | 0 |
| 6487 | 0 |
| 6488 | 0 |
| 6489 | 0 |
| 6490 | 0 |
| 6491 | 0 |
| 6492 | 0 |
| 6493 | 0 |
| 6494 | 0 |
| 6495 | 0 |
| 6496 | 0 |
| 6497 | 0 |
| 6498 | 0 |
| 6499 | 0 |
| 6500 | 0 |
| 6501 | 0 |
| 6502 | 0 |
| 6503 | 0 |
| 6504 | 0 |
| 6505 | 0 |
| 6506 | 0 |
| 6507 | 0 |
| 6508 | 0 |
| 6509 | 0 |
| 6510 | 0 |
| 6511 | 0 |
| 6512 | 0 |
| 6513 | 0 |
| 6514 | 0 |
| 6515 | 0 |
| 6516 | 0 |
| 6517 | 0 |
| 6518 | 0 |
| 6519 | 0 |
| 6520 | 0 |
| 6521 | 0 |
| 6522 | 0 |
| 6523 | 0 |
| 6524 | 0 |
| 6525 | 0 |
| 6526 | 0 |
| 6527 | 0 |
| 6528 | 0 |
| 6529 | 0 |
| 6530 | 0 |
| 6531 | 0 |
| 6532 | 0 |
| 6533 | 0 |
| 6534 | 0 |
| 6535 | 0 |
| 6536 | 0 |
| 6537 | 0 |
| 6538 | 0 |
| 6539 | 0 |
| 6540 | 0 |
| 6541 | 0 |
| 6542 | 0 |
| 6543 | 0 |
| 6544 | 0 |
| 6545 | 0 |
| 6546 | 0 |
| 6547 | 0 |
| 6548 | 0 |
| 6549 | 0 |
| 6550 | 0 |
| 6551 | 0 |
| 6552 | 0 |
| 6553 | 0 |
| 6554 | 0 |
| 6555 | 0 |
| 6556 | 0 |
| 6557 | 0 |
| 6558 | 0 |
| 6559 | 0 |
| 6560 | 0 |
| 6561 | 0 |
| 6562 | 0 |
| 6563 | 0 |
| 6564 | 0 |
| 6565 | 0 |
| 6566 | 0 |
| 6567 | 0 |
| 6568 | 0 |
| 6569 | 0 |
| 6570 | 0 |
| 6571 | 0 |
| 6572 | 0 |
| 6573 | 0 |
| 6574 | 0 |
| 6575 | 0 |
| 6576 | 0 |
| 6577 | 0 |
| 6578 | 0 |
| 6579 | 0 |
| 6580 | 0 |
| 6581 | 0 |
| 6582 | 0 |
| 6583 | 0 |
| 6584 | 0 |
| 6585 | 0 |
| 6586 | 0 |
| 6587 | 0 |
| 6588 | 0 |
| 6589 | 0 |
| 6590 | 0 |
| 6591 | 0 |
| 6592 | 0 |
| 6593 | 0 |
| 6594 | 0 |
| 6595 | 0 |
| 6596 | 0 |
| 6597 | 0 |
| 6598 | 0 |
| 6599 | 0 |
| 6600 | 0 |
| 6601 | 0 |
| 6602 | 0 |
| 6603 | 0 |
| 6604 | 0 |
| 6605 | 0 |
| 6606 | 0 |
| 6607 | 0 |
| 6608 | 0 |
| 6609 | 0 |
| 6610 | 0 |
| 6611 | 0 |
| 6612 | 0 |
| 6613 | 0 |
| 6614 | 0 |
| 6615 | 0 |
| 6616 | 0 |
| 6617 | 0 |
| 6618 | 0 |
| 6619 | 0 |
| 6620 | 0 |
| 6621 | 0 |
| 6622 | 0 |
| 6623 | 0 |
| 6624 | 0 |
| 6625 | 0 |
| 6626 | 0 |
| 6627 | 0 |
| 6628 | 0 |
| 6629 | 0 |
| 6630 | 0 |
| 6631 | 0 |
| 6632 | 0 |
| 6633 | 0 |
| 6634 | 0 |
| 6635 | 0 |
| 6636 | 0 |
| 6637 | 0 |
| 6638 | 0 |
| 6639 | 0 |
| 6640 | 0 |
| 6641 | 0 |
| 6642 | 0 |
| 6643 | 0 |
| 6644 | 0 |
| 6645 | 0 |
| 6646 | 0 |
| 6647 | 0 |
| 6648 | 0 |
| 6649 | 0 |
| 6650 | 0 |
| 6651 | 0 |
| 6652 | 0 |
| 6653 | 0 |
| 6654 | 0 |
| 6655 | 0 |
| 6656 | 0 |
| 6657 | 0 |
| 6658 | 0 |
| 6659 | 0 |
| 6660 | 0 |
| 6661 | 0 |
| 6662 | 0 |
| 6663 | 0 |
| 6664 | 0 |
| 6665 | 0 |
| 6666 | 0 |
| 6667 | 0 |
| 6668 | 0 |
| 6669 | 0 |
| 6670 | 0 |
| 6671 | 0 |
| 6672 | 0 |
| 6673 | 0 |
| 6674 | 0 |
| 6675 | 0 |
| 6676 | 0 |
| 6677 | 0 |
| 6678 | 0 |
| 6679 | 0 |
| 6680 | 0 |
| 6681 | 0 |
| 6682 | 0 |
| 6683 | 0 |
| 6684 | 0 |
| 6685 | 0 |
| 6686 | 0 |
| 6687 | 0 |
| 6688 | 0 |
| 6689 | 0 |
| 6690 | 0 |
| 6691 | 0 |
| 6692 | 0 |
| 6693 | 0 |
| 6694 | 0 |
| 6695 | 0 |
| 6696 | 0 |
| 6697 | 0 |
| 6698 | 0 |
| 6699 | 0 |
| 6700 | 0 |
| 6701 | 0 |
| 6702 | 0 |
| 6703 | 0 |
| 6704 | 0 |
| 6705 | 0 |
| 6706 | 0 |
| 6707 | 0 |
| 6708 | 0 |
| 6709 | 0 |
| 6710 | 0 |
| 6711 | 0 |
| 6712 | 0 |
| 6713 | 0 |
| 6714 | 0 |
| 6715 | 0 |
| 6716 | 0 |
| 6717 | 0 |
| 6718 | 0 |
| 6719 | 0 |
| 6720 | 0 |
| 6721 | 0 |
| 6722 | 0 |
| 6723 | 0 |
| 6724 | 0 |
| 6725 | 0 |
| 6726 | 0 |
| 6727 | 0 |
| 6728 | 0 |
| 6729 | 0 |
| 6730 | 0 |
| 6731 | 0 |
| 6732 | 0 |
| 6733 | 0 |
| 6734 | 0 |
| 6735 | 0 |
| 6736 | 0 |
| 6737 | 0 |
| 6738 | 0 |
| 6739 | 0 |
| 6740 | 0 |
| 6741 | 0 |
| 6742 | 0 |
| 6743 | 0 |
| 6744 | 0 |
| 6745 | 0 |
| 6746 | 0 |
| 6747 | 0 |
| 6748 | 0 |
| 6749 | 0 |
| 6750 | 0 |
| 6751 | 0 |
| 6752 | 0 |
| 6753 | 0 |
| 6754 | 0 |
| 6755 | 0 |
| 6756 | 0 |
| 6757 | 0 |
| 6758 | 0 |
| 6759 | 0 |
| 6760 | 0 |
| 6761 | 0 |
| 6762 | 0 |
| 6763 | 0 |
| 6764 | 0 |
| 6765 | 0 |
| 6766 | 0 |
| 6767 | 0 |
| 6768 | 0 |
| 6769 | 0 |
| 6770 | 0 |
| 6771 | 0 |
| 6772 | 0 |
| 6773 | 0 |
| 6774 | 0 |
| 6775 | 0 |
| 6776 | 0 |
| 6777 | 0 |
| 6778 | 0 |
| 6779 | 0 |
| 6780 | 0 |
| 6781 | 0 |
| 6782 | 0 |
| 6783 | 0 |
| 6784 | 0 |
| 6785 | 0 |
| 6786 | 0 |
| 6787 | 0 |
| 6788 | 0 |
| 6789 | 0 |
| 6790 | 0 |
| 6791 | 0 |
| 6792 | 0 |
| 6793 | 0 |
| 6794 | 0 |
| 6795 | 0 |
| 6796 | 0 |
| 6797 | 0 |
| 6798 | 0 |
| 6799 | 0 |
| 6800 | 0 |
| 6801 | 0 |
| 6802 | 0 |
| 6803 | 0 |
| 6804 | 0 |
| 6805 | 0 |
| 6806 | 0 |
| 6807 | 0 |
| 6808 | 0 |
| 6809 | 0 |
| 6810 | 0 |
| 6811 | 0 |
| 6812 | 0 |
| 6813 | 0 |
| 6814 | 0 |
| 6815 | 0 |
| 6816 | 0 |
| 6817 | 0 |
| 6818 | 0 |
| 6819 | 0 |
| 6820 | 0 |
| 6821 | 0 |
| 6822 | 0 |
| 6823 | 0 |
| 6824 | 0 |
| 6825 | 0 |
| 6826 | 0 |
| 6827 | 0 |
| 6828 | 0 |
| 6829 | 0 |
| 6830 | 0 |
| 6831 | 0 |
| 6832 | 0 |
| 6833 | 0 |
| 6834 | 0 |
| 6835 | 0 |
| 6836 | 0 |
| 6837 | 0 |
| 6838 | 0 |
| 6839 | 0 |
| 6840 | 0 |
| 6841 | 0 |
| 6842 | 0 |
| 6843 | 0 |
| 6844 | 0 |
| 6845 | 0 |
| 6846 | 0 |
| 6847 | 0 |
| 6848 | 0 |
| 6849 | 0 |
| 6850 | 0 |
| 6851 | 0 |
| 6852 | 0 |
| 6853 | 0 |
| 6854 | 0 |
| 6855 | 0 |
| 6856 | 0 |
| 6857 | 0 |
| 6858 | 0 |
| 6859 | 0 |
| 6860 | 0 |
| 6861 | 0 |
| 6862 | 0 |
| 6863 | 0 |
| 6864 | 0 |
| 6865 | 0 |
| 6866 | 0 |
| 6867 | 0 |
| 6868 | 0 |
| 6869 | 0 |
| 6870 | 0 |
| 6871 | 0 |
| 6872 | 0 |
| 6873 | 0 |
| 6874 | 0 |
| 6875 | 0 |
| 6876 | 0 |
| 6877 | 0 |
| 6878 | 0 |
| 6879 | 0 |
| 6880 | 0 |
| 6881 | 0 |
| 6882 | 0 |
| 6883 | 0 |
| 6884 | 0 |
| 6885 | 0 |
| 6886 | 0 |
| 6887 | 0 |
| 6888 | 0 |
| 6889 | 0 |
| 6890 | 0 |
| 6891 | 0 |
| 6892 | 0 |
| 6893 | 0 |
| 6894 | 0 |
| 6895 | 0 |
| 6896 | 0 |
| 6897 | 0 |
| 6898 | 0 |
| 6899 | 0 |
| 6900 | 0 |
| 6901 | 0 |
| 6902 | 0 |
| 6903 | 0 |
| 6904 | 0 |
| 6905 | 0 |
| 6906 | 0 |
| 6907 | 0 |
| 6908 | 0 |
| 6909 | 0 |
| 6910 | 0 |
| 6911 | 0 |
| 6912 | 0 |
| 6913 | 0 |
| 6914 | 0 |
| 6915 | 0 |
| 6916 | 0 |
| 6917 | 0 |
| 6918 | 0 |
| 6919 | 0 |
| 6920 | 0 |
| 6921 | 0 |
| 6922 | 0 |
| 6923 | 0 |
| 6924 | 0 |
| 6925 | 0 |
| 6926 | 0 |
| 6927 | 0 |
| 6928 | 0 |
| 6929 | 0 |
| 6930 | 0 |
| 6931 | 0 |
| 6932 | 0 |
| 6933 | 0 |
| 6934 | 0 |
| 6935 | 0 |
| 6936 | 0 |
| 6937 | 0 |
| 6938 | 0 |
| 6939 | 0 |
| 6940 | 0 |
| 6941 | 0 |
| 6942 | 0 |
| 6943 | 0 |
| 6944 | 0 |
| 6945 | 0 |
| 6946 | 0 |
| 6947 | 0 |
| 6948 | 0 |
| 6949 | 0 |
| 6950 | 0 |
| 6951 | 0 |
| 6952 | 0 |
| 6953 | 0 |
| 6954 | 0 |
| 6955 | 0 |
| 6956 | 0 |
| 6957 | 0 |
| 6958 | 0 |
| 6959 | 0 |
| 6960 | 0 |
| 6961 | 0 |
| 6962 | 0 |
| 6963 | 0 |
| 6964 | 0 |
| 6965 | 0 |
| 6966 | 0 |
| 6967 | 0 |
| 6968 | 0 |
| 6969 | 0 |
| 6970 | 0 |
| 6971 | 0 |
| 6972 | 0 |
| 6973 | 0 |
| 6974 | 0 |
| 6975 | 0 |
| 6976 | 0 |
| 6977 | 0 |
| 6978 | 0 |
| 6979 | 0 |
| 6980 | 0 |
| 6981 | 0 |
| 6982 | 0 |
| 6983 | 0 |
| 6984 | 0 |
| 6985 | 0 |
| 6986 | 0 |
| 6987 | 0 |
| 6988 | 0 |
| 6989 | 0 |
| 6990 | 0 |
| 6991 | 0 |
| 6992 | 0 |
| 6993 | 0 |
| 6994 | 0 |
| 6995 | 0 |
| 6996 | 0 |
| 6997 | 0 |
| 6998 | 0 |
| 6999 | 0 |
| 7000 | 0 |
| 7001 | 0 |
| 7002 | 0 |
| 7003 | 0 |
| 7004 | 0 |
| 7005 | 0 |
| 7006 | 0 |
| 7007 | 0 |
| 7008 | 0 |
| 7009 | 0 |
| 7010 | 0 |
| 7011 | 0 |
| 7012 | 0 |
| 7013 | 0 |
| 7014 | 0 |
| 7015 | 0 |
| 7016 | 0 |
| 7017 | 0 |
| 7018 | 0 |
| 7019 | 0 |
| 7020 | 0 |
| 7021 | 0 |
| 7022 | 0 |
| 7023 | 0 |
| 7024 | 0 |
| 7025 | 0 |
| 7026 | 0 |
| 7027 | 0 |
| 7028 | 0 |
| 7029 | 0 |
| 7030 | 0 |
| 7031 | 0 |
| 7032 | 0 |
| 7033 | 0 |
| 7034 | 0 |
| 7035 | 0 |
| 7036 | 0 |
| 7037 | 0 |
| 7038 | 0 |
| 7039 | 0 |
| 7040 | 0 |
| 7041 | 0 |
| 7042 | 0 |
| 7043 | 0 |
| 7044 | 0 |
| 7045 | 0 |
| 7046 | 0 |
| 7047 | 0 |
| 7048 | 0 |
| 7049 | 0 |
| 7050 | 0 |
| 7051 | 0 |
| 7052 | 0 |
| 7053 | 0 |
| 7054 | 0 |
| 7055 | 0 |
| 7056 | 0 |
| 7057 | 0 |
| 7058 | 0 |
| 7059 | 0 |
| 7060 | 0 |
| 7061 | 0 |
| 7062 | 0 |
| 7063 | 0 |
| 7064 | 0 |
| 7065 | 0 |
| 7066 | 0 |
| 7067 | 0 |
| 7068 | 0 |
| 7069 | 0 |
| 7070 | 0 |
| 7071 | 0 |
| 7072 | 0 |
| 7073 | 0 |
| 7074 | 0 |
| 7075 | 0 |
| 7076 | 0 |
| 7077 | 0 |
| 7078 | 0 |
| 7079 | 0 |
| 7080 | 0 |
| 7081 | 0 |
| 7082 | 0 |
| 7083 | 0 |
| 7084 | 0 |
| 7085 | 0 |
| 7086 | 0 |
| 7087 | 0 |
| 7088 | 0 |
| 7089 | 0 |
| 7090 | 0 |
| 7091 | 0 |
| 7092 | 0 |
| 7093 | 0 |
| 7094 | 0 |
| 7095 | 0 |
| 7096 | 0 |
| 7097 | 0 |
| 7098 | 0 |
| 7099 | 0 |
| 7100 | 0 |
| 7101 | 0 |
| 7102 | 0 |
| 7103 | 0 |
| 7104 | 0 |
| 7105 | 0 |
| 7106 | 0 |
| 7107 | 0 |
| 7108 | 0 |
| 7109 | 0 |
| 7110 | 0 |
| 7111 | 0 |
| 7112 | 0 |
| 7113 | 0 |
| 7114 | 0 |
| 7115 | 0 |
| 7116 | 0 |
| 7117 | 0 |
| 7118 | 0 |
| 7119 | 0 |
| 7120 | 0 |
| 7121 | 0 |
| 7122 | 0 |
| 7123 | 0 |
| 7124 | 0 |
| 7125 | 0 |
| 7126 | 0 |
| 7127 | 0 |
| 7128 | 0 |
| 7129 | 0 |
| 7130 | 0 |
| 7131 | 0 |
| 7132 | 0 |
| 7133 | 0 |
| 7134 | 0 |
| 7135 | 0 |
| 7136 | 0 |
| 7137 | 0 |
| 7138 | 0 |
| 7139 | 0 |
| 7140 | 0 |
| 7141 | 0 |
| 7142 | 0 |
| 7143 | 0 |
| 7144 | 0 |
| 7145 | 0 |
| 7146 | 0 |
| 7147 | 0 |
| 7148 | 0 |
| 7149 | 0 |
| 7150 | 0 |
| 7151 | 0 |
| 7152 | 0 |
| 7153 | 0 |
| 7154 | 0 |
| 7155 | 0 |
| 7156 | 0 |
| 7157 | 0 |
| 7158 | 0 |
| 7159 | 0 |
| 7160 | 0 |
| 7161 | 0 |
| 7162 | 0 |
| 7163 | 0 |
| 7164 | 0 |
| 7165 | 0 |
| 7166 | 0 |
| 7167 | 0 |
| 7168 | 0 |
| 7169 | 0 |
| 7170 | 0 |
| 7171 | 0 |
| 7172 | 0 |
| 7173 | 0 |
| 7174 | 0 |
| 7175 | 0 |
| 7176 | 0 |
| 7177 | 0 |
| 7178 | 0 |
| 7179 | 0 |
| 7180 | 0 |
| 7181 | 0 |
| 7182 | 0 |
| 7183 | 0 |
| 7184 | 0 |
| 7185 | 0 |
| 7186 | 0 |
| 7187 | 0 |
| 7188 | 0 |
| 7189 | 0 |
| 7190 | 0 |
| 7191 | 0 |
| 7192 | 0 |
| 7193 | 0 |
| 7194 | 0 |
| 7195 | 0 |
| 7196 | 0 |
| 7197 | 0 |
| 7198 | 0 |
| 7199 | 0 |
| 7200 | 0 |
| 7201 | 0 |
| 7202 | 0 |
| 7203 | 0 |
| 7204 | 0 |
| 7205 | 0 |
| 7206 | 0 |
| 7207 | 0 |
| 7208 | 0 |
| 7209 | 0 |
| 7210 | 0 |
| 7211 | 0 |
| 7212 | 0 |
| 7213 | 0 |
| 7214 | 0 |
| 7215 | 0 |
| 7216 | 0 |
| 7217 | 0 |
| 7218 | 0 |
| 7219 | 0 |
| 7220 | 0 |
| 7221 | 0 |
| 7222 | 0 |
| 7223 | 0 |
| 7224 | 0 |
| 7225 | 0 |
| 7226 | 0 |
| 7227 | 0 |
| 7228 | 0 |
| 7229 | 0 |
| 7230 | 0 |
| 7231 | 0 |
| 7232 | 0 |
| 7233 | 0 |
| 7234 | 0 |
| 7235 | 0 |
| 7236 | 0 |
| 7237 | 0 |
| 7238 | 0 |
| 7239 | 0 |
| 7240 | 0 |
| 7241 | 0 |
| 7242 | 0 |
| 7243 | 0 |
| 7244 | 0 |
| 7245 | 0 |
| 7246 | 0 |
| 7247 | 0 |
| 7248 | 0 |
| 7249 | 0 |
| 7250 | 0 |
| 7251 | 0 |
| 7252 | 0 |
| 7253 | 0 |
| 7254 | 0 |
| 7255 | 0 |
| 7256 | 0 |
| 7257 | 0 |
| 7258 | 0 |
| 7259 | 0 |
| 7260 | 0 |
| 7261 | 0 |
| 7262 | 0 |
| 7263 | 0 |
| 7264 | 0 |
| 7265 | 0 |
| 7266 | 0 |
| 7267 | 0 |
| 7268 | 0 |
| 7269 | 0 |
| 7270 | 0 |
| 7271 | 0 |
| 7272 | 0 |
| 7273 | 0 |
| 7274 | 0 |
| 7275 | 0 |
| 7276 | 0 |
| 7277 | 0 |
| 7278 | 0 |
| 7279 | 0 |
| 7280 | 0 |
| 7281 | 0 |
| 7282 | 0 |
| 7283 | 0 |
| 7284 | 0 |
| 7285 | 0 |
| 7286 | 0 |
| 7287 | 0 |
| 7288 | 0 |
| 7289 | 0 |
| 7290 | 0 |
| 7291 | 0 |
| 7292 | 0 |
| 7293 | 0 |
| 7294 | 0 |
| 7295 | 0 |
| 7296 | 0 |
| 7297 | 0 |
| 7298 | 0 |
| 7299 | 0 |
| 7300 | 0 |
| 7301 | 0 |
| 7302 | 0 |
| 7303 | 0 |
| 7304 | 0 |
| 7305 | 0 |
| 7306 | 0 |
| 7307 | 0 |
| 7308 | 0 |
| 7309 | 0 |
| 7310 | 0 |
| 7311 | 0 |
| 7312 | 0 |
| 7313 | 0 |
| 7314 | 0 |
| 7315 | 0 |
| 7316 | 0 |
| 7317 | 0 |
| 7318 | 0 |
| 7319 | 0 |
| 7320 | 0 |
| 7321 | 0 |
| 7322 | 0 |
| 7323 | 0 |
| 7324 | 0 |
| 7325 | 0 |
| 7326 | 0 |
| 7327 | 0 |
| 7328 | 0 |
| 7329 | 0 |
| 7330 | 0 |
| 7331 | 0 |
| 7332 | 0 |
| 7333 | 0 |
| 7334 | 0 |
| 7335 | 0 |
| 7336 | 0 |
| 7337 | 0 |
| 7338 | 0 |
| 7339 | 0 |
| 7340 | 0 |
| 7341 | 0 |
| 7342 | 0 |
| 7343 | 0 |
| 7344 | 0 |
| 7345 | 0 |
| 7346 | 0 |
| 7347 | 0 |
| 7348 | 0 |
| 7349 | 0 |
| 7350 | 0 |
| 7351 | 0 |
| 7352 | 0 |
| 7353 | 0 |
| 7354 | 0 |
| 7355 | 0 |
| 7356 | 0 |
| 7357 | 0 |
| 7358 | 0 |
| 7359 | 0 |
| 7360 | 0 |
| 7361 | 0 |
| 7362 | 0 |
| 7363 | 0 |
| 7364 | 0 |
| 7365 | 0 |
| 7366 | 0 |
| 7367 | 0 |
| 7368 | 0 |
| 7369 | 0 |
| 7370 | 0 |
| 7371 | 0 |
| 7372 | 0 |
| 7373 | 0 |
| 7374 | 0 |
| 7375 | 0 |
| 7376 | 0 |
| 7377 | 0 |
| 7378 | 0 |
| 7379 | 0 |
| 7380 | 0 |
| 7381 | 0 |
| 7382 | 0 |
| 7383 | 0 |
| 7384 | 0 |
| 7385 | 0 |
| 7386 | 0 |
| 7387 | 0 |
| 7388 | 0 |
| 7389 | 0 |
| 7390 | 0 |
| 7391 | 0 |
| 7392 | 0 |
| 7393 | 0 |
| 7394 | 0 |
| 7395 | 0 |
| 7396 | 0 |
| 7397 | 0 |
| 7398 | 0 |
| 7399 | 0 |
| 7400 | 0 |
| 7401 | 0 |
| 7402 | 0 |
| 7403 | 0 |
| 7404 | 0 |
| 7405 | 0 |
| 7406 | 0 |
| 7407 | 0 |
| 7408 | 0 |
| 7409 | 0 |
| 7410 | 0 |
| 7411 | 0 |
| 7412 | 0 |
| 7413 | 0 |
| 7414 | 0 |
| 7415 | 0 |
| 7416 | 0 |
| 7417 | 0 |
| 7418 | 0 |
| 7419 | 0 |
| 7420 | 0 |
| 7421 | 0 |
| 7422 | 0 |
| 7423 | 0 |
| 7424 | 0 |
| 7425 | 0 |
| 7426 | 0 |
| 7427 | 0 |
| 7428 | 0 |
| 7429 | 0 |
| 7430 | 0 |
| 7431 | 0 |
| 7432 | 0 |
| 7433 | 0 |
| 7434 | 0 |
| 7435 | 0 |
| 7436 | 0 |
| 7437 | 0 |
| 7438 | 0 |
| 7439 | 0 |
| 7440 | 0 |
| 7441 | 0 |
| 7442 | 0 |
| 7443 | 0 |
| 7444 | 0 |
| 7445 | 0 |
| 7446 | 0 |
| 7447 | 0 |
| 7448 | 0 |
| 7449 | 0 |
| 7450 | 0 |
| 7451 | 0 |
| 7452 | 0 |
| 7453 | 0 |
| 7454 | 0 |
| 7455 | 0 |
| 7456 | 0 |
| 7457 | 0 |
| 7458 | 0 |
| 7459 | 0 |
| 7460 | 0 |
| 7461 | 0 |
| 7462 | 0 |
| 7463 | 0 |
| 7464 | 0 |
| 7465 | 0 |
| 7466 | 0 |
| 7467 | 0 |
| 7468 | 0 |
| 7469 | 0 |
| 7470 | 0 |
| 7471 | 0 |
| 7472 | 0 |
| 7473 | 0 |
| 7474 | 0 |
| 7475 | 0 |
| 7476 | 0 |
| 7477 | 0 |
| 7478 | 0 |
| 7479 | 0 |
| 7480 | 0 |
| 7481 | 0 |
| 7482 | 0 |
| 7483 | 0 |
| 7484 | 0 |
| 7485 | 0 |
| 7486 | 0 |
| 7487 | 0 |
| 7488 | 0 |
| 7489 | 0 |
| 7490 | 0 |
| 7491 | 0 |
| 7492 | 0 |
| 7493 | 0 |
| 7494 | 0 |
| 7495 | 0 |
| 7496 | 0 |
| 7497 | 0 |
| 7498 | 0 |
| 7499 | 0 |
| 7500 | 0 |
| 7501 | 0 |
| 7502 | 0 |
| 7503 | 0 |
| 7504 | 0 |
| 7505 | 0 |
| 7506 | 0 |
| 7507 | 0 |
| 7508 | 0 |
| 7509 | 0 |
| 7510 | 0 |
| 7511 | 0 |
| 7512 | 0 |
| 7513 | 0 |
| 7514 | 0 |
| 7515 | 0 |
| 7516 | 0 |
| 7517 | 0 |
| 7518 | 0 |
| 7519 | 0 |
| 7520 | 0 |
| 7521 | 0 |
| 7522 | 0 |
| 7523 | 0 |
| 7524 | 0 |
| 7525 | 0 |
| 7526 | 0 |
| 7527 | 0 |
| 7528 | 0 |
| 7529 | 0 |
| 7530 | 0 |
| 7531 | 0 |
| 7532 | 0 |
| 7533 | 0 |
| 7534 | 0 |
| 7535 | 0 |
| 7536 | 0 |
| 7537 | 0 |
| 7538 | 0 |
| 7539 | 0 |
| 7540 | 0 |
| 7541 | 0 |
| 7542 | 0 |
| 7543 | 0 |
| 7544 | 0 |
| 7545 | 0 |
| 7546 | 0 |
| 7547 | 0 |
| 7548 | 0 |
| 7549 | 0 |
| 7550 | 0 |
| 7551 | 0 |
| 7552 | 0 |
| 7553 | 0 |
| 7554 | 0 |
| 7555 | 0 |
| 7556 | 0 |
| 7557 | 0 |
| 7558 | 0 |
| 7559 | 0 |
| 7560 | 0 |
| 7561 | 0 |
| 7562 | 0 |
| 7563 | 0 |
| 7564 | 0 |
| 7565 | 0 |
| 7566 | 0 |
| 7567 | 0 |
| 7568 | 0 |
| 7569 | 0 |
| 7570 | 0 |
| 7571 | 0 |
| 7572 | 0 |
| 7573 | 0 |
| 7574 | 0 |
| 7575 | 0 |
| 7576 | 0 |
| 7577 | 0 |
| 7578 | 0 |
| 7579 | 0 |
| 7580 | 0 |
| 7581 | 0 |
| 7582 | 0 |
| 7583 | 0 |
| 7584 | 0 |
| 7585 | 0 |
| 7586 | 0 |
| 7587 | 0 |
| 7588 | 0 |
| 7589 | 0 |
| 7590 | 0 |
| 7591 | 0 |
| 7592 | 0 |
| 7593 | 0 |
| 7594 | 0 |
| 7595 | 0 |
| 7596 | 0 |
| 7597 | 0 |
| 7598 | 0 |
| 7599 | 0 |
| 7600 | 0 |
| 7601 | 0 |
| 7602 | 0 |
| 7603 | 0 |
| 7604 | 0 |
| 7605 | 0 |
| 7606 | 0 |
| 7607 | 0 |
| 7608 | 0 |
| 7609 | 0 |
| 7610 | 0 |
| 7611 | 0 |
| 7612 | 0 |
| 7613 | 0 |
| 7614 | 0 |
| 7615 | 0 |
| 7616 | 0 |
| 7617 | 0 |
| 7618 | 0 |
| 7619 | 0 |
| 7620 | 0 |
| 7621 | 0 |
| 7622 | 0 |
| 7623 | 0 |
| 7624 | 0 |
| 7625 | 0 |
| 7626 | 0 |
| 7627 | 0 |
| 7628 | 0 |
| 7629 | 0 |
| 7630 | 0 |
| 7631 | 0 |
| 7632 | 0 |
| 7633 | 0 |
| 7634 | 0 |
| 7635 | 0 |
| 7636 | 0 |
| 7637 | 0 |
| 7638 | 0 |
| 7639 | 0 |
| 7640 | 0 |
| 7641 | 0 |
| 7642 | 0 |
| 7643 | 0 |
| 7644 | 0 |
| 7645 | 0 |
| 7646 | 0 |
| 7647 | 0 |
| 7648 | 0 |
| 7649 | 0 |
| 7650 | 0 |
| 7651 | 0 |
| 7652 | 0 |
| 7653 | 0 |
| 7654 | 0 |
| 7655 | 0 |
| 7656 | 0 |
| 7657 | 0 |
| 7658 | 0 |
| 7659 | 0 |
| 7660 | 0 |
| 7661 | 0 |
| 7662 | 0 |
| 7663 | 0 |
| 7664 | 0 |
| 7665 | 0 |
| 7666 | 0 |
| 7667 | 0 |
| 7668 | 0 |
| 7669 | 0 |
| 7670 | 0 |
| 7671 | 0 |
| 7672 | 0 |
| 7673 | 0 |
| 7674 | 0 |
| 7675 | 0 |
| 7676 | 0 |
| 7677 | 0 |
| 7678 | 0 |
| 7679 | 0 |
| 7680 | 0 |
| 7681 | 0 |
| 7682 | 0 |
| 7683 | 0 |
| 7684 | 0 |
| 7685 | 0 |
| 7686 | 0 |
| 7687 | 0 |
| 7688 | 0 |
| 7689 | 0 |
| 7690 | 0 |
| 7691 | 0 |
| 7692 | 0 |
| 7693 | 0 |
| 7694 | 0 |
| 7695 | 0 |
| 7696 | 0 |
| 7697 | 0 |
| 7698 | 0 |
| 7699 | 0 |
| 7700 | 0 |
| 7701 | 0 |
| 7702 | 0 |
| 7703 | 0 |
| 7704 | 0 |
| 7705 | 0 |
| 7706 | 0 |
| 7707 | 0 |
| 7708 | 0 |
| 7709 | 0 |
| 7710 | 0 |
| 7711 | 0 |
| 7712 | 0 |
| 7713 | 0 |
| 7714 | 0 |
| 7715 | 0 |
| 7716 | 0 |
| 7717 | 0 |
| 7718 | 0 |
| 7719 | 0 |
| 7720 | 0 |
| 7721 | 0 |
| 7722 | 0 |
| 7723 | 0 |
| 7724 | 0 |
| 7725 | 0 |
| 7726 | 0 |
| 7727 | 0 |
| 7728 | 0 |
| 7729 | 0 |
| 7730 | 0 |
| 7731 | 0 |
| 7732 | 0 |
| 7733 | 0 |
| 7734 | 0 |
| 7735 | 0 |
| 7736 | 0 |
| 7737 | 0 |
| 7738 | 0 |
| 7739 | 0 |
| 7740 | 0 |
| 7741 | 0 |
| 7742 | 0 |
| 7743 | 0 |
| 7744 | 0 |
| 7745 | 0 |
| 7746 | 0 |
| 7747 | 0 |
| 7748 | 0 |
| 7749 | 0 |
| 7750 | 0 |
| 7751 | 0 |
| 7752 | 0 |
| 7753 | 0 |
| 7754 | 0 |
| 7755 | 0 |
| 7756 | 0 |
| 7757 | 0 |
| 7758 | 0 |
| 7759 | 0 |
| 7760 | 0 |
| 7761 | 0 |
| 7762 | 0 |
| 7763 | 0 |
| 7764 | 0 |
| 7765 | 0 |
| 7766 | 0 |
| 7767 | 0 |
| 7768 | 0 |
| 7769 | 0 |
| 7770 | 0 |
| 7771 | 0 |
| 7772 | 0 |
| 7773 | 0 |
| 7774 | 0 |
| 7775 | 0 |
| 7776 | 0 |
| 7777 | 0 |
| 7778 | 0 |
| 7779 | 0 |
| 7780 | 0 |
| 7781 | 0 |
| 7782 | 0 |
| 7783 | 0 |
| 7784 | 0 |
| 7785 | 0 |
| 7786 | 0 |
| 7787 | 0 |
| 7788 | 0 |
| 7789 | 0 |
| 7790 | 0 |
| 7791 | 0 |
| 7792 | 0 |
| 7793 | 0 |
| 7794 | 0 |
| 7795 | 0 |
| 7796 | 0 |
| 7797 | 0 |
| 7798 | 0 |
| 7799 | 0 |
| 7800 | 0 |
| 7801 | 0 |
| 7802 | 0 |
| 7803 | 0 |
| 7804 | 0 |
| 7805 | 0 |
| 7806 | 0 |
| 7807 | 0 |
| 7808 | 0 |
| 7809 | 0 |
| 7810 | 0 |
| 7811 | 0 |
| 7812 | 0 |
| 7813 | 0 |
| 7814 | 0 |
| 7815 | 0 |
| 7816 | 0 |
| 7817 | 0 |
| 7818 | 0 |
| 7819 | 0 |
| 7820 | 0 |
| 7821 | 0 |
| 7822 | 0 |
| 7823 | 0 |
| 7824 | 0 |
| 7825 | 0 |
| 7826 | 0 |
| 7827 | 0 |
| 7828 | 0 |
| 7829 | 0 |
| 7830 | 0 |
| 7831 | 0 |
| 7832 | 0 |
| 7833 | 0 |
| 7834 | 0 |
| 7835 | 0 |
| 7836 | 0 |
| 7837 | 0 |
| 7838 | 0 |
| 7839 | 0 |
| 7840 | 0 |
| 7841 | 0 |
| 7842 | 0 |
| 7843 | 0 |
| 7844 | 0 |
| 7845 | 0 |
| 7846 | 0 |
| 7847 | 0 |
| 7848 | 0 |
| 7849 | 0 |
| 7850 | 0 |
| 7851 | 0 |
| 7852 | 0 |
| 7853 | 0 |
| 7854 | 0 |
| 7855 | 0 |
| 7856 | 0 |
| 7857 | 0 |
| 7858 | 0 |
| 7859 | 0 |
| 7860 | 0 |
| 7861 | 0 |
| 7862 | 0 |
| 7863 | 0 |
| 7864 | 0 |
| 7865 | 0 |
| 7866 | 0 |
| 7867 | 0 |
| 7868 | 0 |
| 7869 | 0 |
| 7870 | 0 |
| 7871 | 0 |
| 7872 | 0 |
| 7873 | 0 |
| 7874 | 0 |
| 7875 | 0 |
| 7876 | 0 |
| 7877 | 0 |
| 7878 | 0 |
| 7879 | 0 |
| 7880 | 0 |
| 7881 | 0 |
| 7882 | 0 |
| 7883 | 0 |
| 7884 | 0 |
| 7885 | 0 |
| 7886 | 0 |
| 7887 | 0 |
| 7888 | 0 |
| 7889 | 0 |
| 7890 | 0 |
| 7891 | 0 |
| 7892 | 0 |
| 7893 | 0 |
| 7894 | 0 |
| 7895 | 0 |
| 7896 | 0 |
| 7897 | 0 |
| 7898 | 0 |
| 7899 | 0 |
| 7900 | 0 |
| 7901 | 0 |
| 7902 | 0 |
| 7903 | 0 |
| 7904 | 0 |
| 7905 | 0 |
| 7906 | 0 |
| 7907 | 0 |
| 7908 | 0 |
| 7909 | 0 |
| 7910 | 0 |
| 7911 | 0 |
| 7912 | 0 |
| 7913 | 0 |
| 7914 | 0 |
| 7915 | 0 |
| 7916 | 0 |
| 7917 | 0 |
| 7918 | 0 |
| 7919 | 0 |
| 7920 | 0 |
| 7921 | 0 |
| 7922 | 0 |
| 7923 | 0 |
| 7924 | 0 |
| 7925 | 0 |
| 7926 | 0 |
| 7927 | 0 |
| 7928 | 0 |
| 7929 | 0 |
| 7930 | 0 |
| 7931 | 0 |
| 7932 | 0 |
| 7933 | 0 |
| 7934 | 0 |
| 7935 | 0 |
| 7936 | 0 |
| 7937 | 0 |
| 7938 | 0 |
| 7939 | 0 |
| 7940 | 0 |
| 7941 | 0 |
| 7942 | 0 |
| 7943 | 0 |
| 7944 | 0 |
| 7945 | 0 |
| 7946 | 0 |
| 7947 | 0 |
| 7948 | 0 |
| 7949 | 0 |
| 7950 | 0 |
| 7951 | 0 |
| 7952 | 0 |
| 7953 | 0 |
| 7954 | 0 |
| 7955 | 0 |
| 7956 | 0 |
| 7957 | 0 |
| 7958 | 0 |
| 7959 | 0 |
| 7960 | 0 |
| 7961 | 0 |
| 7962 | 0 |
| 7963 | 0 |
| 7964 | 0 |
| 7965 | 0 |
| 7966 | 0 |
| 7967 | 0 |
| 7968 | 0 |
| 7969 | 0 |
| 7970 | 0 |
| 7971 | 0 |
| 7972 | 0 |
| 7973 | 0 |
| 7974 | 0 |
| 7975 | 0 |
| 7976 | 0 |
| 7977 | 0 |
| 7978 | 0 |
| 7979 | 0 |
| 7980 | 0 |
| 7981 | 0 |
| 7982 | 0 |
| 7983 | 0 |
| 7984 | 0 |
| 7985 | 0 |
| 7986 | 0 |
| 7987 | 0 |
| 7988 | 0 |
| 7989 | 0 |
| 7990 | 0 |
| 7991 | 0 |
| 7992 | 0 |
| 7993 | 0 |
| 7994 | 0 |
| 7995 | 0 |
| 7996 | 0 |
| 7997 | 0 |
| 7998 | 0 |
| 7999 | 0 |
| 8000 | 0 |
| 8001 | 0 |
| 8002 | 0 |
| 8003 | 0 |
| 8004 | 0 |
| 8005 | 0 |
| 8006 | 0 |
| 8007 | 0 |
| 8008 | 0 |
| 8009 | 0 |
| 8010 | 0 |
| 8011 | 0 |
| 8012 | 0 |
| 8013 | 0 |
| 8014 | 0 |
| 8015 | 0 |
| 8016 | 0 |
| 8017 | 0 |
| 8018 | 0 |
| 8019 | 0 |
| 8020 | 0 |
| 8021 | 0 |
| 8022 | 0 |
| 8023 | 0 |
| 8024 | 0 |
| 8025 | 0 |
| 8026 | 0 |
| 8027 | 0 |
| 8028 | 0 |
| 8029 | 0 |
| 8030 | 0 |
| 8031 | 0 |
| 8032 | 0 |
| 8033 | 0 |
| 8034 | 0 |
| 8035 | 0 |
| 8036 | 0 |
| 8037 | 0 |
| 8038 | 0 |
| 8039 | 0 |
| 8040 | 0 |
| 8041 | 0 |
| 8042 | 0 |
| 8043 | 0 |
| 8044 | 0 |
| 8045 | 0 |
| 8046 | 0 |
| 8047 | 0 |
| 8048 | 0 |
| 8049 | 0 |
| 8050 | 0 |
| 8051 | 0 |
| 8052 | 0 |
| 8053 | 0 |
| 8054 | 0 |
| 8055 | 0 |
| 8056 | 0 |
| 8057 | 0 |
| 8058 | 0 |
| 8059 | 0 |
| 8060 | 0 |
| 8061 | 0 |
| 8062 | 0 |
| 8063 | 0 |
| 8064 | 0 |
| 8065 | 0 |
| 8066 | 0 |
| 8067 | 0 |
| 8068 | 0 |
| 8069 | 0 |
| 8070 | 0 |
| 8071 | 0 |
| 8072 | 0 |
| 8073 | 0 |
| 8074 | 0 |
| 8075 | 0 |
| 8076 | 0 |
| 8077 | 0 |
| 8078 | 0 |
| 8079 | 0 |
| 8080 | 0 |
| 8081 | 0 |
| 8082 | 0 |
| 8083 | 0 |
| 8084 | 0 |
| 8085 | 0 |
| 8086 | 0 |
| 8087 | 0 |
| 8088 | 0 |
| 8089 | 0 |
| 8090 | 0 |
| 8091 | 0 |
| 8092 | 0 |
| 8093 | 0 |
| 8094 | 0 |
| 8095 | 0 |
| 8096 | 0 |
| 8097 | 0 |
| 8098 | 0 |
| 8099 | 0 |
| 8100 | 0 |
| 8101 | 0 |
| 8102 | 0 |
| 8103 | 0 |
| 8104 | 0 |
| 8105 | 0 |
| 8106 | 0 |
| 8107 | 0 |
| 8108 | 0 |
| 8109 | 0 |
| 8110 | 0 |
| 8111 | 0 |
| 8112 | 0 |
| 8113 | 0 |
| 8114 | 0 |
| 8115 | 0 |
| 8116 | 0 |
| 8117 | 0 |
| 8118 | 0 |
| 8119 | 0 |
| 8120 | 0 |
| 8121 | 0 |
| 8122 | 0 |
| 8123 | 0 |
| 8124 | 0 |
| 8125 | 0 |
| 8126 | 0 |
| 8127 | 0 |
| 8128 | 0 |
| 8129 | 0 |
| 8130 | 0 |
| 8131 | 0 |
| 8132 | 0 |
| 8133 | 0 |
| 8134 | 0 |
| 8135 | 0 |
| 8136 | 0 |
| 8137 | 0 |
| 8138 | 0 |
| 8139 | 0 |
| 8140 | 0 |
| 8141 | 0 |
| 8142 | 0 |
| 8143 | 0 |
| 8144 | 0 |
| 8145 | 0 |
| 8146 | 0 |
| 8147 | 0 |
| 8148 | 0 |
| 8149 | 0 |
| 8150 | 0 |
| 8151 | 0 |
| 8152 | 0 |
| 8153 | 0 |
| 8154 | 0 |
| 8155 | 0 |
| 8156 | 0 |
| 8157 | 0 |
| 8158 | 0 |
| 8159 | 0 |
| 8160 | 0 |
| 8161 | 0 |
| 8162 | 0 |
| 8163 | 0 |
| 8164 | 0 |
| 8165 | 0 |
| 8166 | 0 |
| 8167 | 0 |
| 8168 | 0 |
| 8169 | 0 |
| 8170 | 0 |
| 8171 | 0 |
| 8172 | 0 |
| 8173 | 0 |
| 8174 | 0 |
| 8175 | 0 |
| 8176 | 0 |
| 8177 | 0 |
| 8178 | 0 |
| 8179 | 0 |
| 8180 | 0 |
| 8181 | 0 |
| 8182 | 0 |
| 8183 | 0 |
| 8184 | 0 |
| 8185 | 0 |
| 8186 | 0 |
| 8187 | 0 |
| 8188 | 0 |
| 8189 | 0 |
| 8190 | 0 |
| 8191 | 0 |
| 8192 | 0 |
| 8193 | 0 |
| 8194 | 0 |
| 8195 | 0 |
| 8196 | 0 |
| 8197 | 0 |
| 8198 | 0 |
| 8199 | 0 |
| 8200 | 0 |
| 8201 | 0 |
| 8202 | 0 |
| 8203 | 0 |
| 8204 | 0 |
| 8205 | 0 |
| 8206 | 0 |
| 8207 | 0 |
| 8208 | 0 |
| 8209 | 0 |
| 8210 | 0 |
| 8211 | 0 |
| 8212 | 0 |
| 8213 | 0 |
| 8214 | 0 |
| 8215 | 0 |
| 8216 | 0 |
| 8217 | 0 |
| 8218 | 0 |
| 8219 | 0 |
| 8220 | 0 |
| 8221 | 0 |
| 8222 | 0 |
| 8223 | 0 |
| 8224 | 0 |
| 8225 | 0 |
| 8226 | 0 |
| 8227 | 0 |
| 8228 | 0 |
| 8229 | 0 |
| 8230 | 0 |
| 8231 | 0 |
| 8232 | 0 |
| 8233 | 0 |
| 8234 | 0 |
| 8235 | 0 |
| 8236 | 0 |
| 8237 | 0 |
| 8238 | 0 |
| 8239 | 0 |
| 8240 | 0 |
| 8241 | 0 |
| 8242 | 0 |
| 8243 | 0 |
| 8244 | 0 |
| 8245 | 0 |
| 8246 | 0 |
| 8247 | 0 |
| 8248 | 0 |
| 8249 | 0 |
| 8250 | 0 |
| 8251 | 0 |
| 8252 | 0 |
| 8253 | 0 |
| 8254 | 0 |
| 8255 | 0 |
| 8256 | 0 |
| 8257 | 0 |
| 8258 | 0 |
| 8259 | 0 |
| 8260 | 0 |
| 8261 | 0 |
| 8262 | 0 |
| 8263 | 0 |
| 8264 | 0 |
| 8265 | 0 |
| 8266 | 0 |
| 8267 | 0 |
| 8268 | 0 |
| 8269 | 0 |
| 8270 | 0 |
| 8271 | 0 |
| 8272 | 0 |
| 8273 | 0 |
| 8274 | 0 |
| 8275 | 0 |
| 8276 | 0 |
| 8277 | 0 |
| 8278 | 0 |
| 8279 | 0 |
| 8280 | 0 |
| 8281 | 0 |
| 8282 | 0 |
| 8283 | 0 |
| 8284 | 0 |
| 8285 | 0 |
| 8286 | 0 |
| 8287 | 0 |
| 8288 | 0 |
| 8289 | 0 |
| 8290 | 0 |
| 8291 | 0 |
| 8292 | 0 |
| 8293 | 0 |
| 8294 | 0 |
| 8295 | 0 |
| 8296 | 0 |
| 8297 | 0 |
| 8298 | 0 |
| 8299 | 0 |
| 8300 | 0 |
| 8301 | 0 |
| 8302 | 0 |
| 8303 | 0 |
| 8304 | 0 |
| 8305 | 0 |
| 8306 | 0 |
| 8307 | 0 |
| 8308 | 0 |
| 8309 | 0 |
| 8310 | 0 |
| 8311 | 0 |
| 8312 | 0 |
| 8313 | 0 |
| 8314 | 0 |
| 8315 | 0 |
| 8316 | 0 |
| 8317 | 0 |
| 8318 | 0 |
| 8319 | 0 |
| 8320 | 0 |
| 8321 | 0 |
| 8322 | 0 |
| 8323 | 0 |
| 8324 | 0 |
| 8325 | 0 |
| 8326 | 0 |
| 8327 | 0 |
| 8328 | 0 |
| 8329 | 0 |
| 8330 | 0 |
| 8331 | 0 |
| 8332 | 0 |
| 8333 | 0 |
| 8334 | 0 |
| 8335 | 0 |
| 8336 | 0 |
| 8337 | 0 |
| 8338 | 0 |
| 8339 | 0 |
| 8340 | 0 |
| 8341 | 0 |
| 8342 | 0 |
| 8343 | 0 |
| 8344 | 0 |
| 8345 | 0 |
| 8346 | 0 |
| 8347 | 0 |
| 8348 | 0 |
| 8349 | 0 |
| 8350 | 0 |
| 8351 | 0 |
| 8352 | 0 |
| 8353 | 0 |
| 8354 | 0 |
| 8355 | 0 |
| 8356 | 0 |
| 8357 | 0 |
| 8358 | 0 |
| 8359 | 0 |
| 8360 | 0 |
| 8361 | 0 |
| 8362 | 0 |
| 8363 | 0 |
| 8364 | 0 |
| 8365 | 0 |
| 8366 | 0 |
| 8367 | 0 |
| 8368 | 0 |
| 8369 | 0 |
| 8370 | 0 |
| 8371 | 0 |
| 8372 | 0 |
| 8373 | 0 |
| 8374 | 0 |
| 8375 | 0 |
| 8376 | 0 |
| 8377 | 0 |
| 8378 | 0 |
| 8379 | 0 |
| 8380 | 0 |
| 8381 | 0 |
| 8382 | 0 |
| 8383 | 0 |
| 8384 | 0 |
| 8385 | 0 |
| 8386 | 0 |
| 8387 | 0 |
| 8388 | 0 |
| 8389 | 0 |
| 8390 | 0 |
| 8391 | 0 |
| 8392 | 0 |
| 8393 | 0 |
| 8394 | 0 |
| 8395 | 0 |
| 8396 | 0 |
| 8397 | 0 |
| 8398 | 0 |
| 8399 | 0 |
| 8400 | 0 |
| 8401 | 0 |
| 8402 | 0 |
| 8403 | 0 |
| 8404 | 0 |
| 8405 | 0 |
| 8406 | 0 |
| 8407 | 0 |
| 8408 | 0 |
| 8409 | 0 |
| 8410 | 0 |
| 8411 | 0 |
| 8412 | 0 |
| 8413 | 0 |
| 8414 | 0 |
| 8415 | 0 |
| 8416 | 0 |
| 8417 | 0 |
| 8418 | 0 |
| 8419 | 0 |
| 8420 | 0 |
| 8421 | 0 |
| 8422 | 0 |
| 8423 | 0 |
| 8424 | 0 |
| 8425 | 0 |
| 8426 | 0 |
| 8427 | 0 |
| 8428 | 0 |
| 8429 | 0 |
| 8430 | 0 |
| 8431 | 0 |
| 8432 | 0 |
| 8433 | 0 |
| 8434 | 0 |
| 8435 | 0 |
| 8436 | 0 |
| 8437 | 0 |
| 8438 | 0 |
| 8439 | 0 |
| 8440 | 0 |
| 8441 | 0 |
| 8442 | 0 |
| 8443 | 0 |
| 8444 | 0 |
| 8445 | 0 |
| 8446 | 0 |
| 8447 | 0 |
| 8448 | 0 |
| 8449 | 0 |
| 8450 | 0 |
| 8451 | 0 |
| 8452 | 0 |
| 8453 | 0 |
| 8454 | 0 |
| 8455 | 0 |
| 8456 | 0 |
| 8457 | 0 |
| 8458 | 0 |
| 8459 | 0 |
| 8460 | 0 |
| 8461 | 0 |
| 8462 | 0 |
| 8463 | 0 |
| 8464 | 0 |
| 8465 | 0 |
| 8466 | 0 |
| 8467 | 0 |
| 8468 | 0 |
| 8469 | 0 |
| 8470 | 0 |
| 8471 | 0 |
| 8472 | 0 |
| 8473 | 0 |
| 8474 | 0 |
| 8475 | 0 |
| 8476 | 0 |
| 8477 | 0 |
| 8478 | 0 |
| 8479 | 0 |
| 8480 | 0 |
| 8481 | 0 |
| 8482 | 0 |
| 8483 | 0 |
| 8484 | 0 |
| 8485 | 0 |
| 8486 | 0 |
| 8487 | 0 |
| 8488 | 0 |
| 8489 | 0 |
| 8490 | 0 |
| 8491 | 0 |
| 8492 | 0 |
| 8493 | 0 |
| 8494 | 0 |
| 8495 | 0 |
| 8496 | 0 |
| 8497 | 0 |
| 8498 | 0 |
| 8499 | 0 |
| 8500 | 0 |
| 8501 | 0 |
| 8502 | 0 |
| 8503 | 0 |
| 8504 | 0 |
| 8505 | 0 |
| 8506 | 0 |
| 8507 | 0 |
| 8508 | 0 |
| 8509 | 0 |
| 8510 | 0 |
| 8511 | 0 |
| 8512 | 0 |
| 8513 | 0 |
| 8514 | 0 |
| 8515 | 0 |
| 8516 | 0 |
| 8517 | 0 |
| 8518 | 0 |
| 8519 | 0 |
| 8520 | 0 |
| 8521 | 0 |
| 8522 | 0 |
| 8523 | 0 |
| 8524 | 0 |
| 8525 | 0 |
| 8526 | 0 |
| 8527 | 0 |
| 8528 | 0 |
| 8529 | 0 |
| 8530 | 0 |
| 8531 | 0 |
| 8532 | 0 |
| 8533 | 0 |
| 8534 | 0 |
| 8535 | 0 |
| 8536 | 0 |
| 8537 | 0 |
| 8538 | 0 |
| 8539 | 0 |
| 8540 | 0 |
| 8541 | 0 |
| 8542 | 0 |
| 8543 | 0 |
| 8544 | 0 |
| 8545 | 0 |
| 8546 | 0 |
| 8547 | 0 |
| 8548 | 0 |
| 8549 | 0 |
| 8550 | 0 |
| 8551 | 0 |
| 8552 | 0 |
| 8553 | 0 |
| 8554 | 0 |
| 8555 | 0 |
| 8556 | 0 |
| 8557 | 0 |
| 8558 | 0 |
| 8559 | 0 |
| 8560 | 0 |
| 8561 | 0 |
| 8562 | 0 |
| 8563 | 0 |
| 8564 | 0 |
| 8565 | 0 |
| 8566 | 0 |
| 8567 | 0 |
| 8568 | 0 |
| 8569 | 0 |
| 8570 | 0 |
| 8571 | 0 |
| 8572 | 0 |
| 8573 | 0 |
| 8574 | 0 |
| 8575 | 0 |
| 8576 | 0 |
| 8577 | 0 |
| 8578 | 0 |
| 8579 | 0 |
| 8580 | 0 |
| 8581 | 0 |
| 8582 | 0 |
| 8583 | 0 |
| 8584 | 0 |
| 8585 | 0 |
| 8586 | 0 |
| 8587 | 0 |
| 8588 | 0 |
| 8589 | 0 |
| 8590 | 0 |
| 8591 | 0 |
| 8592 | 0 |
| 8593 | 0 |
| 8594 | 0 |
| 8595 | 0 |
| 8596 | 0 |
| 8597 | 0 |
| 8598 | 0 |
| 8599 | 0 |
| 8600 | 0 |
| 8601 | 0 |
| 8602 | 0 |
| 8603 | 0 |
| 8604 | 0 |
| 8605 | 0 |
| 8606 | 0 |
| 8607 | 0 |
| 8608 | 0 |
| 8609 | 0 |
| 8610 | 0 |
| 8611 | 0 |
| 8612 | 0 |
| 8613 | 0 |
| 8614 | 0 |
| 8615 | 0 |
| 8616 | 0 |
| 8617 | 0 |
| 8618 | 0 |
| 8619 | 0 |
| 8620 | 0 |
| 8621 | 0 |
| 8622 | 0 |
| 8623 | 0 |
| 8624 | 0 |
| 8625 | 0 |
| 8626 | 0 |
| 8627 | 0 |
| 8628 | 0 |
| 8629 | 0 |
| 8630 | 0 |
| 8631 | 0 |
| 8632 | 0 |
| 8633 | 0 |
| 8634 | 0 |
| 8635 | 0 |
| 8636 | 0 |
| 8637 | 0 |
| 8638 | 0 |
| 8639 | 0 |
| 8640 | 0 |
| 8641 | 0 |
| 8642 | 0 |
| 8643 | 0 |
| 8644 | 0 |
| 8645 | 0 |
| 8646 | 0 |
| 8647 | 0 |
| 8648 | 0 |
| 8649 | 0 |
| 8650 | 0 |
| 8651 | 0 |
| 8652 | 0 |
| 8653 | 0 |
| 8654 | 0 |
| 8655 | 0 |
| 8656 | 0 |
| 8657 | 0 |
| 8658 | 0 |
| 8659 | 0 |
| 8660 | 0 |
| 8661 | 0 |
| 8662 | 0 |
| 8663 | 0 |
| 8664 | 0 |
| 8665 | 0 |
| 8666 | 0 |
| 8667 | 0 |
| 8668 | 0 |
| 8669 | 0 |
| 8670 | 0 |
| 8671 | 0 |
| 8672 | 0 |
| 8673 | 0 |
| 8674 | 0 |
| 8675 | 0 |
| 8676 | 0 |
| 8677 | 0 |
| 8678 | 0 |
| 8679 | 0 |
| 8680 | 0 |
| 8681 | 0 |
| 8682 | 0 |
| 8683 | 0 |
| 8684 | 0 |
| 8685 | 0 |
| 8686 | 0 |
| 8687 | 0 |
| 8688 | 0 |
| 8689 | 0 |
| 8690 | 0 |
| 8691 | 0 |
| 8692 | 0 |
| 8693 | 0 |
| 8694 | 0 |
| 8695 | 0 |
| 8696 | 0 |
| 8697 | 0 |
| 8698 | 0 |
| 8699 | 0 |
| 8700 | 0 |
| 8701 | 0 |
| 8702 | 0 |
| 8703 | 0 |
| 8704 | 0 |
| 8705 | 0 |
| 8706 | 0 |
| 8707 | 0 |
| 8708 | 0 |
| 8709 | 0 |
| 8710 | 0 |
| 8711 | 0 |
| 8712 | 0 |
| 8713 | 0 |
| 8714 | 0 |
| 8715 | 0 |
| 8716 | 0 |
| 8717 | 0 |
| 8718 | 0 |
| 8719 | 0 |
| 8720 | 0 |
| 8721 | 0 |
| 8722 | 0 |
| 8723 | 0 |
| 8724 | 0 |
| 8725 | 0 |
| 8726 | 0 |
| 8727 | 0 |
| 8728 | 0 |
| 8729 | 0 |
| 8730 | 0 |
| 8731 | 0 |
| 8732 | 0 |
| 8733 | 0 |
| 8734 | 0 |
| 8735 | 0 |
| 8736 | 0 |
| 8737 | 0 |
| 8738 | 0 |
| 8739 | 0 |
| 8740 | 0 |
| 8741 | 0 |
| 8742 | 0 |
| 8743 | 0 |
| 8744 | 0 |
| 8745 | 0 |
| 8746 | 0 |
| 8747 | 0 |
| 8748 | 0 |
| 8749 | 0 |
| 8750 | 0 |
| 8751 | 0 |
| 8752 | 0 |
| 8753 | 0 |
| 8754 | 0 |
| 8755 | 0 |
| 8756 | 0 |
| 8757 | 0 |
| 8758 | 0 |
| 8759 | 0 |
| 8760 | 0 |
| 8761 | 0 |
| 8762 | 0 |
| 8763 | 0 |
| 8764 | 0 |
| 8765 | 0 |
| 8766 | 0 |
| 8767 | 0 |
| 8768 | 0 |
| 8769 | 0 |
| 8770 | 0 |
| 8771 | 0 |
| 8772 | 0 |
| 8773 | 0 |
| 8774 | 0 |
| 8775 | 0 |
| 8776 | 0 |
| 8777 | 0 |
| 8778 | 0 |
| 8779 | 0 |
| 8780 | 0 |
| 8781 | 0 |
| 8782 | 0 |
| 8783 | 0 |
| 8784 | 0 |
| 8785 | 0 |
| 8786 | 0 |
| 8787 | 0 |
| 8788 | 0 |
| 8789 | 0 |
| 8790 | 0 |
| 8791 | 0 |
| 8792 | 0 |
| 8793 | 0 |
| 8794 | 0 |
| 8795 | 0 |
| 8796 | 0 |
| 8797 | 0 |
| 8798 | 0 |
| 8799 | 0 |
| 8800 | 0 |
| 8801 | 0 |
| 8802 | 0 |
| 8803 | 0 |
| 8804 | 0 |
| 8805 | 0 |
| 8806 | 0 |
| 8807 | 0 |
| 8808 | 0 |
| 8809 | 0 |
| 8810 | 0 |
| 8811 | 0 |
| 8812 | 0 |
| 8813 | 0 |
| 8814 | 0 |
| 8815 | 0 |
| 8816 | 0 |
| 8817 | 0 |
| 8818 | 0 |
| 8819 | 0 |
| 8820 | 0 |
| 8821 | 0 |
| 8822 | 0 |
| 8823 | 0 |
| 8824 | 0 |
| 8825 | 0 |
| 8826 | 0 |
| 8827 | 0 |
| 8828 | 0 |
| 8829 | 0 |
| 8830 | 0 |
| 8831 | 0 |
| 8832 | 0 |
| 8833 | 0 |
| 8834 | 0 |
| 8835 | 0 |
| 8836 | 0 |
| 8837 | 0 |
| 8838 | 0 |
| 8839 | 0 |
| 8840 | 0 |
| 8841 | 0 |
| 8842 | 0 |
| 8843 | 0 |
| 8844 | 0 |
| 8845 | 0 |
| 8846 | 0 |
| 8847 | 0 |
| 8848 | 0 |
| 8849 | 0 |
| 8850 | 0 |
| 8851 | 0 |
| 8852 | 0 |
| 8853 | 0 |
| 8854 | 0 |
| 8855 | 0 |
| 8856 | 0 |
| 8857 | 0 |
| 8858 | 0 |
| 8859 | 0 |
| 8860 | 0 |
| 8861 | 0 |
| 8862 | 0 |
| 8863 | 0 |
| 8864 | 0 |
| 8865 | 0 |
| 8866 | 0 |
| 8867 | 0 |
| 8868 | 0 |
| 8869 | 0 |
| 8870 | 0 |
| 8871 | 0 |
| 8872 | 0 |
| 8873 | 0 |
| 8874 | 0 |
| 8875 | 0 |
| 8876 | 0 |
| 8877 | 0 |
| 8878 | 0 |
| 8879 | 0 |
| 8880 | 0 |
| 8881 | 0 |
| 8882 | 0 |
| 8883 | 0 |
| 8884 | 0 |
| 8885 | 0 |
| 8886 | 0 |
| 8887 | 0 |
| 8888 | 0 |
| 8889 | 0 |
| 8890 | 0 |
| 8891 | 0 |
| 8892 | 0 |
| 8893 | 0 |
| 8894 | 0 |
| 8895 | 0 |
| 8896 | 0 |
| 8897 | 0 |
| 8898 | 0 |
| 8899 | 0 |
| 8900 | 0 |
| 8901 | 0 |
| 8902 | 0 |
| 8903 | 0 |
| 8904 | 0 |
| 8905 | 0 |
| 8906 | 0 |
| 8907 | 0 |
| 8908 | 0 |
| 8909 | 0 |
| 8910 | 0 |
| 8911 | 0 |
| 8912 | 0 |
| 8913 | 0 |
| 8914 | 0 |
| 8915 | 0 |
| 8916 | 0 |
| 8917 | 0 |
| 8918 | 0 |
| 8919 | 0 |
| 8920 | 0 |
| 8921 | 0 |
| 8922 | 0 |
| 8923 | 0 |
| 8924 | 0 |
| 8925 | 0 |
| 8926 | 0 |
| 8927 | 0 |
| 8928 | 0 |
| 8929 | 0 |
| 8930 | 0 |
| 8931 | 0 |
| 8932 | 0 |
| 8933 | 0 |
| 8934 | 0 |
| 8935 | 0 |
| 8936 | 0 |
| 8937 | 0 |
| 8938 | 0 |
| 8939 | 0 |
| 8940 | 0 |
| 8941 | 0 |
| 8942 | 0 |
| 8943 | 0 |
| 8944 | 0 |
| 8945 | 0 |
| 8946 | 0 |
| 8947 | 0 |
| 8948 | 0 |
| 8949 | 0 |
| 8950 | 0 |
| 8951 | 0 |
| 8952 | 0 |
| 8953 | 0 |
| 8954 | 0 |
| 8955 | 0 |
| 8956 | 0 |
| 8957 | 0 |
| 8958 | 0 |
| 8959 | 0 |
| 8960 | 0 |
| 8961 | 0 |
| 8962 | 0 |
| 8963 | 0 |
| 8964 | 0 |
| 8965 | 0 |
| 8966 | 0 |
| 8967 | 0 |
| 8968 | 0 |
| 8969 | 0 |
| 8970 | 0 |
| 8971 | 0 |
| 8972 | 0 |
| 8973 | 0 |
| 8974 | 0 |
| 8975 | 0 |
| 8976 | 0 |
| 8977 | 0 |
| 8978 | 0 |
| 8979 | 0 |
| 8980 | 0 |
| 8981 | 0 |
| 8982 | 0 |
| 8983 | 0 |
| 8984 | 0 |
| 8985 | 0 |
| 8986 | 0 |
| 8987 | 0 |
| 8988 | 0 |
| 8989 | 0 |
| 8990 | 0 |
| 8991 | 0 |
| 8992 | 0 |
| 8993 | 0 |
| 8994 | 0 |
| 8995 | 0 |
| 8996 | 0 |
| 8997 | 0 |
| 8998 | 0 |
| 8999 | 0 |
| 9000 | 0 |
| 9001 | 0 |
| 9002 | 0 |
| 9003 | 0 |
| 9004 | 0 |
| 9005 | 0 |
| 9006 | 0 |
| 9007 | 0 |
| 9008 | 0 |
| 9009 | 0 |
| 9010 | 0 |
| 9011 | 0 |
| 9012 | 0 |
| 9013 | 0 |
| 9014 | 0 |
| 9015 | 0 |
| 9016 | 0 |
| 9017 | 0 |
| 9018 | 0 |
| 9019 | 0 |
| 9020 | 0 |
| 9021 | 0 |
| 9022 | 0 |
| 9023 | 0 |
| 9024 | 0 |
| 9025 | 0 |
| 9026 | 0 |
| 9027 | 0 |
| 9028 | 0 |
| 9029 | 0 |
| 9030 | 0 |
| 9031 | 0 |
| 9032 | 0 |
| 9033 | 0 |
| 9034 | 0 |
| 9035 | 0 |
| 9036 | 0 |
| 9037 | 0 |
| 9038 | 0 |
| 9039 | 0 |
| 9040 | 0 |
| 9041 | 0 |
| 9042 | 0 |
| 9043 | 0 |
| 9044 | 0 |
| 9045 | 0 |
| 9046 | 0 |
| 9047 | 0 |
| 9048 | 0 |
| 9049 | 0 |
| 9050 | 0 |
| 9051 | 0 |
| 9052 | 0 |
| 9053 | 0 |
| 9054 | 0 |
| 9055 | 0 |
| 9056 | 0 |
| 9057 | 0 |
| 9058 | 0 |
| 9059 | 0 |
| 9060 | 0 |
| 9061 | 0 |
| 9062 | 0 |
| 9063 | 0 |
| 9064 | 0 |
| 9065 | 0 |
| 9066 | 0 |
| 9067 | 0 |
| 9068 | 0 |
| 9069 | 0 |
| 9070 | 0 |
| 9071 | 0 |
| 9072 | 0 |
| 9073 | 0 |
| 9074 | 0 |
| 9075 | 0 |
| 9076 | 0 |
| 9077 | 0 |
| 9078 | 0 |
| 9079 | 0 |
| 9080 | 0 |
| 9081 | 0 |
| 9082 | 0 |
| 9083 | 0 |
| 9084 | 0 |
| 9085 | 0 |
| 9086 | 0 |
| 9087 | 0 |
| 9088 | 0 |
| 9089 | 0 |
| 9090 | 0 |
| 9091 | 0 |
| 9092 | 0 |
| 9093 | 0 |
| 9094 | 0 |
| 9095 | 0 |
| 9096 | 0 |
| 9097 | 0 |
| 9098 | 0 |
| 9099 | 0 |
| 9100 | 0 |
| 9101 | 0 |
| 9102 | 0 |
| 9103 | 0 |
| 9104 | 0 |
| 9105 | 0 |
| 9106 | 0 |
| 9107 | 0 |
| 9108 | 0 |
| 9109 | 0 |
| 9110 | 0 |
| 9111 | 0 |
| 9112 | 0 |
| 9113 | 0 |
| 9114 | 0 |
| 9115 | 0 |
| 9116 | 0 |
| 9117 | 0 |
| 9118 | 0 |
| 9119 | 0 |
| 9120 | 0 |
| 9121 | 0 |
| 9122 | 0 |
| 9123 | 0 |
| 9124 | 0 |
| 9125 | 0 |
| 9126 | 0 |
| 9127 | 0 |
| 9128 | 0 |
| 9129 | 0 |
| 9130 | 0 |
| 9131 | 0 |
| 9132 | 0 |
| 9133 | 0 |
| 9134 | 0 |
| 9135 | 0 |
| 9136 | 0 |
| 9137 | 0 |
| 9138 | 0 |
| 9139 | 0 |
| 9140 | 0 |
| 9141 | 0 |
| 9142 | 0 |
| 9143 | 0 |
| 9144 | 0 |
| 9145 | 0 |
| 9146 | 0 |
| 9147 | 0 |
| 9148 | 0 |
| 9149 | 0 |
| 9150 | 0 |
| 9151 | 0 |
| 9152 | 0 |
| 9153 | 0 |
| 9154 | 0 |
| 9155 | 0 |
| 9156 | 0 |
| 9157 | 0 |
| 9158 | 0 |
| 9159 | 0 |
| 9160 | 0 |
| 9161 | 0 |
| 9162 | 0 |
| 9163 | 0 |
| 9164 | 0 |
| 9165 | 0 |
| 9166 | 0 |
| 9167 | 0 |
| 9168 | 0 |
| 9169 | 0 |
| 9170 | 0 |
| 9171 | 0 |
| 9172 | 0 |
| 9173 | 0 |
| 9174 | 0 |
| 9175 | 0 |
| 9176 | 0 |
| 9177 | 0 |
| 9178 | 0 |
| 9179 | 0 |
| 9180 | 0 |
| 9181 | 0 |
| 9182 | 0 |
| 9183 | 0 |
| 9184 | 0 |
| 9185 | 0 |
| 9186 | 0 |
| 9187 | 0 |
| 9188 | 0 |
| 9189 | 0 |
| 9190 | 0 |
| 9191 | 0 |
| 9192 | 0 |
| 9193 | 0 |
| 9194 | 0 |
| 9195 | 0 |
| 9196 | 0 |
| 9197 | 0 |
| 9198 | 0 |
| 9199 | 0 |
| 9200 | 0 |
| 9201 | 0 |
| 9202 | 0 |
| 9203 | 0 |
| 9204 | 0 |
| 9205 | 0 |
| 9206 | 0 |
| 9207 | 0 |
| 9208 | 0 |
| 9209 | 0 |
| 9210 | 0 |
| 9211 | 0 |
| 9212 | 0 |
| 9213 | 0 |
| 9214 | 0 |
| 9215 | 0 |
| 9216 | 0 |
| 9217 | 0 |
| 9218 | 0 |
| 9219 | 0 |
| 9220 | 0 |
| 9221 | 0 |
| 9222 | 0 |
| 9223 | 0 |
| 9224 | 0 |
| 9225 | 0 |
| 9226 | 0 |
| 9227 | 0 |
| 9228 | 0 |
| 9229 | 0 |
| 9230 | 0 |
| 9231 | 0 |
| 9232 | 0 |
| 9233 | 0 |
| 9234 | 0 |
| 9235 | 0 |
| 9236 | 0 |
| 9237 | 0 |
| 9238 | 0 |
| 9239 | 0 |
| 9240 | 0 |
| 9241 | 0 |
| 9242 | 0 |
| 9243 | 0 |
| 9244 | 0 |
| 9245 | 0 |
| 9246 | 0 |
| 9247 | 0 |
| 9248 | 0 |
| 9249 | 0 |
| 9250 | 0 |
| 9251 | 0 |
| 9252 | 0 |
| 9253 | 0 |
| 9254 | 0 |
| 9255 | 0 |
| 9256 | 0 |
| 9257 | 0 |
| 9258 | 0 |
| 9259 | 0 |
| 9260 | 0 |
| 9261 | 0 |
| 9262 | 0 |
| 9263 | 0 |
| 9264 | 0 |
| 9265 | 0 |
| 9266 | 0 |
| 9267 | 0 |
| 9268 | 0 |
| 9269 | 0 |
| 9270 | 0 |
| 9271 | 0 |
| 9272 | 0 |
| 9273 | 0 |
| 9274 | 0 |
| 9275 | 0 |
| 9276 | 0 |
| 9277 | 0 |
| 9278 | 0 |
| 9279 | 0 |
| 9280 | 0 |
| 9281 | 0 |
| 9282 | 0 |
| 9283 | 0 |
| 9284 | 0 |
| 9285 | 0 |
| 9286 | 0 |
| 9287 | 0 |
| 9288 | 0 |
| 9289 | 0 |
| 9290 | 0 |
| 9291 | 0 |
| 9292 | 0 |
| 9293 | 0 |
| 9294 | 0 |
| 9295 | 0 |
| 9296 | 0 |
| 9297 | 0 |
| 9298 | 0 |
| 9299 | 0 |
| 9300 | 0 |
| 9301 | 0 |
| 9302 | 0 |
| 9303 | 0 |
| 9304 | 0 |
| 9305 | 0 |
| 9306 | 0 |
| 9307 | 0 |
| 9308 | 0 |
| 9309 | 0 |
| 9310 | 0 |
| 9311 | 0 |
| 9312 | 0 |
| 9313 | 0 |
| 9314 | 0 |
| 9315 | 0 |
| 9316 | 0 |
| 9317 | 0 |
| 9318 | 0 |
| 9319 | 0 |
| 9320 | 0 |
| 9321 | 0 |
| 9322 | 0 |
| 9323 | 0 |
| 9324 | 0 |
| 9325 | 0 |
| 9326 | 0 |
| 9327 | 0 |
| 9328 | 0 |
| 9329 | 0 |
| 9330 | 0 |
| 9331 | 0 |
| 9332 | 0 |
| 9333 | 0 |
| 9334 | 0 |
| 9335 | 0 |
| 9336 | 0 |
| 9337 | 0 |
| 9338 | 0 |
| 9339 | 0 |
| 9340 | 0 |
| 9341 | 0 |
| 9342 | 0 |
| 9343 | 0 |
| 9344 | 0 |
| 9345 | 0 |
| 9346 | 0 |
| 9347 | 0 |
| 9348 | 0 |
| 9349 | 0 |
| 9350 | 0 |
| 9351 | 0 |
| 9352 | 0 |
| 9353 | 0 |
| 9354 | 0 |
| 9355 | 0 |
| 9356 | 0 |
| 9357 | 0 |
| 9358 | 0 |
| 9359 | 0 |
| 9360 | 0 |
| 9361 | 0 |
| 9362 | 0 |
| 9363 | 0 |
| 9364 | 0 |
| 9365 | 0 |
| 9366 | 0 |
| 9367 | 0 |
| 9368 | 0 |
| 9369 | 0 |
| 9370 | 0 |
| 9371 | 0 |
| 9372 | 0 |
| 9373 | 0 |
| 9374 | 0 |
| 9375 | 0 |
| 9376 | 0 |
| 9377 | 0 |
| 9378 | 0 |
| 9379 | 0 |
| 9380 | 0 |
| 9381 | 0 |
| 9382 | 0 |
| 9383 | 0 |
| 9384 | 0 |
| 9385 | 0 |
| 9386 | 0 |
| 9387 | 0 |
| 9388 | 0 |
| 9389 | 0 |
| 9390 | 0 |
| 9391 | 0 |
| 9392 | 0 |
| 9393 | 0 |
| 9394 | 0 |
| 9395 | 0 |
| 9396 | 0 |
| 9397 | 0 |
| 9398 | 0 |
| 9399 | 0 |
| 9400 | 0 |
| 9401 | 0 |
| 9402 | 0 |
| 9403 | 0 |
| 9404 | 0 |
| 9405 | 0 |
| 9406 | 0 |
| 9407 | 0 |
| 9408 | 0 |
| 9409 | 0 |
| 9410 | 0 |
| 9411 | 0 |
| 9412 | 0 |
| 9413 | 0 |
| 9414 | 0 |
| 9415 | 0 |
| 9416 | 0 |
| 9417 | 0 |
| 9418 | 0 |
| 9419 | 0 |
| 9420 | 0 |
| 9421 | 0 |
| 9422 | 0 |
| 9423 | 0 |
| 9424 | 0 |
| 9425 | 0 |
| 9426 | 0 |
| 9427 | 0 |
| 9428 | 0 |
| 9429 | 0 |
| 9430 | 0 |
| 9431 | 0 |
| 9432 | 0 |
| 9433 | 0 |
| 9434 | 0 |
| 9435 | 0 |
| 9436 | 0 |
| 9437 | 0 |
| 9438 | 0 |
| 9439 | 0 |
| 9440 | 0 |
| 9441 | 0 |
| 9442 | 0 |
| 9443 | 0 |
| 9444 | 0 |
| 9445 | 0 |
| 9446 | 0 |
| 9447 | 0 |
| 9448 | 0 |
| 9449 | 0 |
| 9450 | 0 |
| 9451 | 0 |
| 9452 | 0 |
| 9453 | 0 |
| 9454 | 0 |
| 9455 | 0 |
| 9456 | 0 |
| 9457 | 0 |
| 9458 | 0 |
| 9459 | 0 |
| 9460 | 0 |
| 9461 | 0 |
| 9462 | 0 |
| 9463 | 0 |
| 9464 | 0 |
| 9465 | 0 |
| 9466 | 0 |
| 9467 | 0 |
| 9468 | 0 |
| 9469 | 0 |
| 9470 | 0 |
| 9471 | 0 |
| 9472 | 0 |
| 9473 | 0 |
| 9474 | 0 |
| 9475 | 0 |
| 9476 | 0 |
| 9477 | 0 |
| 9478 | 0 |
| 9479 | 0 |
| 9480 | 0 |
| 9481 | 0 |
| 9482 | 0 |
| 9483 | 0 |
| 9484 | 0 |
| 9485 | 0 |
| 9486 | 0 |
| 9487 | 0 |
| 9488 | 0 |
| 9489 | 0 |
| 9490 | 0 |
| 9491 | 0 |
| 9492 | 0 |
| 9493 | 0 |
| 9494 | 0 |
| 9495 | 0 |
| 9496 | 0 |
| 9497 | 0 |
| 9498 | 0 |
| 9499 | 0 |
| 9500 | 0 |
| 9501 | 0 |
| 9502 | 0 |
| 9503 | 0 |
| 9504 | 0 |
| 9505 | 0 |
| 9506 | 0 |
| 9507 | 0 |
| 9508 | 0 |
| 9509 | 0 |
| 9510 | 0 |
| 9511 | 0 |
| 9512 | 0 |
| 9513 | 0 |
| 9514 | 0 |
| 9515 | 0 |
| 9516 | 0 |
| 9517 | 0 |
| 9518 | 0 |
| 9519 | 0 |
| 9520 | 0 |
| 9521 | 0 |
| 9522 | 0 |
| 9523 | 0 |
| 9524 | 0 |
| 9525 | 0 |
| 9526 | 0 |
| 9527 | 0 |
| 9528 | 0 |
| 9529 | 0 |
| 9530 | 0 |
| 9531 | 0 |
| 9532 | 0 |
| 9533 | 0 |
| 9534 | 0 |
| 9535 | 0 |
| 9536 | 0 |
| 9537 | 0 |
| 9538 | 0 |
| 9539 | 0 |
| 9540 | 0 |
| 9541 | 0 |
| 9542 | 0 |
| 9543 | 0 |
| 9544 | 0 |
| 9545 | 0 |
| 9546 | 0 |
| 9547 | 0 |
| 9548 | 0 |
| 9549 | 0 |
| 9550 | 0 |
| 9551 | 0 |
| 9552 | 0 |
| 9553 | 0 |
| 9554 | 0 |
| 9555 | 0 |
| 9556 | 0 |
| 9557 | 0 |
| 9558 | 0 |
| 9559 | 0 |
| 9560 | 0 |
| 9561 | 0 |
| 9562 | 0 |
| 9563 | 0 |
| 9564 | 0 |
| 9565 | 0 |
| 9566 | 0 |
| 9567 | 0 |
| 9568 | 0 |
| 9569 | 0 |
| 9570 | 0 |
| 9571 | 0 |
| 9572 | 0 |
| 9573 | 0 |
| 9574 | 0 |
| 9575 | 0 |
| 9576 | 0 |
| 9577 | 0 |
| 9578 | 0 |
| 9579 | 0 |
| 9580 | 0 |
| 9581 | 0 |
| 9582 | 0 |
| 9583 | 0 |
| 9584 | 0 |
| 9585 | 0 |
| 9586 | 0 |
| 9587 | 0 |
| 9588 | 0 |
| 9589 | 0 |
| 9590 | 0 |
| 9591 | 0 |
| 9592 | 0 |
| 9593 | 0 |
| 9594 | 0 |
| 9595 | 0 |
| 9596 | 0 |
| 9597 | 0 |
| 9598 | 0 |
| 9599 | 0 |
| 9600 | 0 |
| 9601 | 0 |
| 9602 | 0 |
| 9603 | 0 |
| 9604 | 0 |
| 9605 | 0 |
| 9606 | 0 |
| 9607 | 0 |
| 9608 | 0 |
| 9609 | 0 |
| 9610 | 0 |
| 9611 | 0 |
| 9612 | 0 |
| 9613 | 0 |
| 9614 | 0 |
| 9615 | 0 |
| 9616 | 0 |
| 9617 | 0 |
| 9618 | 0 |
| 9619 | 0 |
| 9620 | 0 |
| 9621 | 0 |
| 9622 | 0 |
| 9623 | 0 |
| 9624 | 0 |
| 9625 | 0 |
| 9626 | 0 |
| 9627 | 0 |
| 9628 | 0 |
| 9629 | 0 |
| 9630 | 0 |
| 9631 | 0 |
| 9632 | 0 |
| 9633 | 0 |
| 9634 | 0 |
| 9635 | 0 |
| 9636 | 0 |
| 9637 | 0 |
| 9638 | 0 |
| 9639 | 0 |
| 9640 | 0 |
| 9641 | 0 |
| 9642 | 0 |
| 9643 | 0 |
| 9644 | 0 |
| 9645 | 0 |
| 9646 | 0 |
| 9647 | 0 |
| 9648 | 0 |
| 9649 | 0 |
| 9650 | 0 |
| 9651 | 0 |
| 9652 | 0 |
| 9653 | 0 |
| 9654 | 0 |
| 9655 | 0 |
| 9656 | 0 |
| 9657 | 0 |
| 9658 | 0 |
| 9659 | 0 |
| 9660 | 0 |
| 9661 | 0 |
| 9662 | 0 |
| 9663 | 0 |
| 9664 | 0 |
| 9665 | 0 |
| 9666 | 0 |
| 9667 | 0 |
| 9668 | 0 |
| 9669 | 0 |
| 9670 | 0 |
| 9671 | 0 |
| 9672 | 0 |
| 9673 | 0 |
| 9674 | 0 |
| 9675 | 0 |
| 9676 | 0 |
| 9677 | 0 |
| 9678 | 0 |
| 9679 | 0 |
| 9680 | 0 |
| 9681 | 0 |
| 9682 | 0 |
| 9683 | 0 |
| 9684 | 0 |
| 9685 | 0 |
| 9686 | 0 |
| 9687 | 0 |
| 9688 | 0 |
| 9689 | 0 |
| 9690 | 0 |
| 9691 | 0 |
| 9692 | 0 |
| 9693 | 0 |
| 9694 | 0 |
| 9695 | 0 |
| 9696 | 0 |
| 9697 | 0 |
| 9698 | 0 |
| 9699 | 0 |
| 9700 | 0 |
| 9701 | 0 |
| 9702 | 0 |
| 9703 | 0 |
| 9704 | 0 |
| 9705 | 0 |
| 9706 | 0 |
| 9707 | 0 |
| 9708 | 0 |
| 9709 | 0 |
| 9710 | 0 |
| 9711 | 0 |
| 9712 | 0 |
| 9713 | 0 |
| 9714 | 0 |
| 9715 | 0 |
| 9716 | 0 |
| 9717 | 0 |
| 9718 | 0 |
| 9719 | 0 |
| 9720 | 0 |
| 9721 | 0 |
| 9722 | 0 |
| 9723 | 0 |
| 9724 | 0 |
| 9725 | 0 |
| 9726 | 0 |
| 9727 | 0 |
| 9728 | 0 |
| 9729 | 0 |
| 9730 | 0 |
| 9731 | 0 |
| 9732 | 0 |
| 9733 | 0 |
| 9734 | 0 |
| 9735 | 0 |
| 9736 | 0 |
| 9737 | 0 |
| 9738 | 0 |
| 9739 | 0 |
| 9740 | 0 |
| 9741 | 0 |
| 9742 | 0 |
| 9743 | 0 |
| 9744 | 0 |
| 9745 | 0 |
| 9746 | 0 |
| 9747 | 0 |
| 9748 | 0 |
| 9749 | 0 |
| 9750 | 0 |
| 9751 | 0 |
| 9752 | 0 |
| 9753 | 0 |
| 9754 | 0 |
| 9755 | 0 |
| 9756 | 0 |
| 9757 | 0 |
| 9758 | 0 |
| 9759 | 0 |
| 9760 | 0 |
| 9761 | 0 |
| 9762 | 0 |
| 9763 | 0 |
| 9764 | 0 |
| 9765 | 0 |
| 9766 | 0 |
| 9767 | 0 |
| 9768 | 0 |
| 9769 | 0 |
| 9770 | 0 |
| 9771 | 0 |
| 9772 | 0 |
| 9773 | 0 |
| 9774 | 0 |
| 9775 | 0 |
| 9776 | 0 |
| 9777 | 0 |
| 9778 | 0 |
| 9779 | 0 |
| 9780 | 0 |
| 9781 | 0 |
| 9782 | 0 |
| 9783 | 0 |
| 9784 | 0 |
| 9785 | 0 |
| 9786 | 0 |
| 9787 | 0 |
| 9788 | 0 |
| 9789 | 0 |
| 9790 | 0 |
| 9791 | 0 |
| 9792 | 0 |
| 9793 | 0 |
| 9794 | 0 |
| 9795 | 0 |
| 9796 | 0 |
| 9797 | 0 |
| 9798 | 0 |
| 9799 | 0 |
| 9800 | 0 |
| 9801 | 0 |
| 9802 | 0 |
| 9803 | 0 |
| 9804 | 0 |
| 9805 | 0 |
| 9806 | 0 |
| 9807 | 0 |
| 9808 | 0 |
| 9809 | 0 |
| 9810 | 0 |
| 9811 | 0 |
| 9812 | 0 |
| 9813 | 0 |
| 9814 | 0 |
| 9815 | 0 |
| 9816 | 0 |
| 9817 | 0 |
| 9818 | 0 |
| 9819 | 0 |
| 9820 | 0 |
| 9821 | 0 |
| 9822 | 0 |
| 9823 | 0 |
| 9824 | 0 |
| 9825 | 0 |
| 9826 | 0 |
| 9827 | 0 |
| 9828 | 0 |
| 9829 | 0 |
| 9830 | 0 |
| 9831 | 0 |
| 9832 | 0 |
| 9833 | 0 |
| 9834 | 0 |
| 9835 | 0 |
| 9836 | 0 |
| 9837 | 0 |
| 9838 | 0 |
| 9839 | 0 |
| 9840 | 0 |
| 9841 | 0 |
| 9842 | 0 |
| 9843 | 0 |
| 9844 | 0 |
| 9845 | 0 |
| 9846 | 0 |
| 9847 | 0 |
| 9848 | 0 |
| 9849 | 0 |
| 9850 | 0 |
| 9851 | 0 |
| 9852 | 0 |
| 9853 | 0 |
| 9854 | 0 |
| 9855 | 0 |
| 9856 | 0 |
| 9857 | 0 |
| 9858 | 0 |
| 9859 | 0 |
| 9860 | 0 |
| 9861 | 0 |
| 9862 | 0 |
| 9863 | 0 |
| 9864 | 0 |
| 9865 | 0 |
| 9866 | 0 |
| 9867 | 0 |
| 9868 | 0 |
| 9869 | 0 |
| 9870 | 0 |
| 9871 | 0 |
| 9872 | 0 |
| 9873 | 0 |
| 9874 | 0 |
| 9875 | 0 |
| 9876 | 0 |
| 9877 | 0 |
| 9878 | 0 |
| 9879 | 0 |
| 9880 | 0 |
| 9881 | 0 |
| 9882 | 0 |
| 9883 | 0 |
| 9884 | 0 |
| 9885 | 0 |
| 9886 | 0 |
| 9887 | 0 |
| 9888 | 0 |
| 9889 | 0 |
| 9890 | 0 |
| 9891 | 0 |
| 9892 | 0 |
| 9893 | 0 |
| 9894 | 0 |
| 9895 | 0 |
| 9896 | 0 |
| 9897 | 0 |
| 9898 | 0 |
| 9899 | 0 |
| 9900 | 0 |
| 9901 | 0 |
| 9902 | 0 |
| 9903 | 0 |
| 9904 | 0 |
| 9905 | 0 |
| 9906 | 0 |
| 9907 | 0 |
| 9908 | 0 |
| 9909 | 0 |
| 9910 | 0 |
| 9911 | 0 |
| 9912 | 0 |
| 9913 | 0 |
| 9914 | 0 |
| 9915 | 0 |
| 9916 | 0 |
| 9917 | 0 |
| 9918 | 0 |
| 9919 | 0 |
| 9920 | 0 |
| 9921 | 0 |
| 9922 | 0 |
| 9923 | 0 |
| 9924 | 0 |
| 9925 | 0 |
| 9926 | 0 |
| 9927 | 0 |
| 9928 | 0 |
| 9929 | 0 |
| 9930 | 0 |
| 9931 | 0 |
| 9932 | 0 |
| 9933 | 0 |
| 9934 | 0 |
| 9935 | 0 |
| 9936 | 0 |
| 9937 | 0 |
| 9938 | 0 |
| 9939 | 0 |
| 9940 | 0 |
| 9941 | 0 |
| 9942 | 0 |
| 9943 | 0 |
| 9944 | 0 |
| 9945 | 0 |
| 9946 | 0 |
| 9947 | 0 |
| 9948 | 0 |
| 9949 | 0 |
| 9950 | 0 |
| 9951 | 0 |
| 9952 | 0 |
| 9953 | 0 |
| 9954 | 0 |
| 9955 | 0 |
| 9956 | 0 |
| 9957 | 0 |
| 9958 | 0 |
| 9959 | 0 |
| 9960 | 0 |
| 9961 | 0 |
| 9962 | 0 |
| 9963 | 0 |
| 9964 | 0 |
| 9965 | 0 |
| 9966 | 0 |
| 9967 | 0 |
| 9968 | 0 |
| 9969 | 0 |
| 9970 | 0 |
| 9971 | 0 |
| 9972 | 0 |
| 9973 | 0 |
| 9974 | 0 |
| 9975 | 0 |
| 9976 | 0 |
| 9977 | 0 |
| 9978 | 0 |
| 9979 | 0 |
| 9980 | 0 |
| 9981 | 0 |
| 9982 | 0 |
| 9983 | 0 |
| 9984 | 0 |
| 9985 | 0 |
| 9986 | 0 |
| 9987 | 0 |
| 9988 | 0 |
| 9989 | 0 |
| 9990 | 0 |
| 9991 | 0 |
| 9992 | 0 |
| 9993 | 0 |
| 9994 | 0 |
| 9995 | 0 |
| 9996 | 0 |
| 9997 | 0 |
| 9998 | 0 |
| 9999 | 0 |